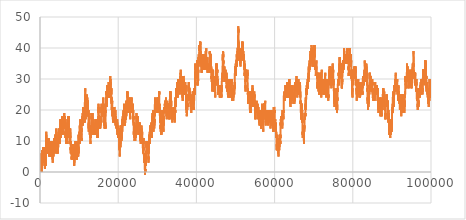
| Category | a |
|---|---|
| 2.0 | 0 |
| 3.0 | 1 |
| 5.0 | 0 |
| 7.0 | 1 |
| 11.0 | 2 |
| 13.0 | 1 |
| 17.0 | 0 |
| 19.0 | 1 |
| 23.0 | 2 |
| 29.0 | 1 |
| 31.0 | 2 |
| 37.0 | 1 |
| 41.0 | 0 |
| 43.0 | 1 |
| 47.0 | 2 |
| 53.0 | 1 |
| 59.0 | 2 |
| 61.0 | 1 |
| 67.0 | 2 |
| 71.0 | 3 |
| 73.0 | 2 |
| 79.0 | 3 |
| 83.0 | 4 |
| 89.0 | 3 |
| 97.0 | 2 |
| 101.0 | 1 |
| 103.0 | 2 |
| 107.0 | 3 |
| 109.0 | 2 |
| 113.0 | 1 |
| 127.0 | 2 |
| 131.0 | 3 |
| 137.0 | 2 |
| 139.0 | 3 |
| 149.0 | 2 |
| 151.0 | 3 |
| 157.0 | 2 |
| 163.0 | 3 |
| 167.0 | 4 |
| 173.0 | 3 |
| 179.0 | 4 |
| 181.0 | 3 |
| 191.0 | 4 |
| 193.0 | 3 |
| 197.0 | 2 |
| 199.0 | 3 |
| 211.0 | 4 |
| 223.0 | 5 |
| 227.0 | 6 |
| 229.0 | 5 |
| 233.0 | 4 |
| 239.0 | 5 |
| 241.0 | 4 |
| 251.0 | 5 |
| 257.0 | 4 |
| 263.0 | 5 |
| 269.0 | 4 |
| 271.0 | 5 |
| 277.0 | 4 |
| 281.0 | 3 |
| 283.0 | 4 |
| 293.0 | 3 |
| 307.0 | 4 |
| 311.0 | 5 |
| 313.0 | 4 |
| 317.0 | 3 |
| 331.0 | 4 |
| 337.0 | 3 |
| 347.0 | 4 |
| 349.0 | 3 |
| 353.0 | 2 |
| 359.0 | 3 |
| 367.0 | 4 |
| 373.0 | 3 |
| 379.0 | 4 |
| 383.0 | 5 |
| 389.0 | 4 |
| 397.0 | 3 |
| 401.0 | 2 |
| 409.0 | 1 |
| 419.0 | 2 |
| 421.0 | 1 |
| 431.0 | 2 |
| 433.0 | 1 |
| 439.0 | 2 |
| 443.0 | 3 |
| 449.0 | 2 |
| 457.0 | 1 |
| 461.0 | 0 |
| 463.0 | 1 |
| 467.0 | 2 |
| 479.0 | 3 |
| 487.0 | 4 |
| 491.0 | 5 |
| 499.0 | 6 |
| 503.0 | 7 |
| 509.0 | 6 |
| 521.0 | 5 |
| 523.0 | 6 |
| 541.0 | 5 |
| 547.0 | 6 |
| 557.0 | 5 |
| 563.0 | 6 |
| 569.0 | 5 |
| 571.0 | 6 |
| 577.0 | 5 |
| 587.0 | 6 |
| 593.0 | 5 |
| 599.0 | 6 |
| 601.0 | 5 |
| 607.0 | 6 |
| 613.0 | 5 |
| 617.0 | 4 |
| 619.0 | 5 |
| 631.0 | 6 |
| 641.0 | 5 |
| 643.0 | 6 |
| 647.0 | 7 |
| 653.0 | 6 |
| 659.0 | 7 |
| 661.0 | 6 |
| 673.0 | 5 |
| 677.0 | 4 |
| 683.0 | 5 |
| 691.0 | 6 |
| 701.0 | 5 |
| 709.0 | 4 |
| 719.0 | 5 |
| 727.0 | 6 |
| 733.0 | 5 |
| 739.0 | 6 |
| 743.0 | 7 |
| 751.0 | 8 |
| 757.0 | 7 |
| 761.0 | 6 |
| 769.0 | 5 |
| 773.0 | 4 |
| 787.0 | 5 |
| 797.0 | 4 |
| 809.0 | 3 |
| 811.0 | 4 |
| 821.0 | 3 |
| 823.0 | 4 |
| 827.0 | 5 |
| 829.0 | 4 |
| 839.0 | 5 |
| 853.0 | 4 |
| 857.0 | 3 |
| 859.0 | 4 |
| 863.0 | 5 |
| 877.0 | 4 |
| 881.0 | 3 |
| 883.0 | 4 |
| 887.0 | 5 |
| 907.0 | 6 |
| 911.0 | 7 |
| 919.0 | 8 |
| 929.0 | 7 |
| 937.0 | 6 |
| 941.0 | 5 |
| 947.0 | 6 |
| 953.0 | 5 |
| 967.0 | 6 |
| 971.0 | 7 |
| 977.0 | 6 |
| 983.0 | 7 |
| 991.0 | 8 |
| 997.0 | 7 |
| 1009.0 | 6 |
| 1013.0 | 5 |
| 1019.0 | 6 |
| 1021.0 | 5 |
| 1031.0 | 6 |
| 1033.0 | 5 |
| 1039.0 | 6 |
| 1049.0 | 5 |
| 1051.0 | 6 |
| 1061.0 | 5 |
| 1063.0 | 6 |
| 1069.0 | 5 |
| 1087.0 | 6 |
| 1091.0 | 7 |
| 1093.0 | 6 |
| 1097.0 | 5 |
| 1103.0 | 6 |
| 1109.0 | 5 |
| 1117.0 | 4 |
| 1123.0 | 5 |
| 1129.0 | 4 |
| 1151.0 | 5 |
| 1153.0 | 4 |
| 1163.0 | 5 |
| 1171.0 | 6 |
| 1181.0 | 5 |
| 1187.0 | 6 |
| 1193.0 | 5 |
| 1201.0 | 4 |
| 1213.0 | 3 |
| 1217.0 | 2 |
| 1223.0 | 3 |
| 1229.0 | 2 |
| 1231.0 | 3 |
| 1237.0 | 2 |
| 1249.0 | 1 |
| 1259.0 | 2 |
| 1277.0 | 1 |
| 1279.0 | 2 |
| 1283.0 | 3 |
| 1289.0 | 2 |
| 1291.0 | 3 |
| 1297.0 | 2 |
| 1301.0 | 1 |
| 1303.0 | 2 |
| 1307.0 | 3 |
| 1319.0 | 4 |
| 1321.0 | 3 |
| 1327.0 | 4 |
| 1361.0 | 3 |
| 1367.0 | 4 |
| 1373.0 | 3 |
| 1381.0 | 2 |
| 1399.0 | 3 |
| 1409.0 | 2 |
| 1423.0 | 3 |
| 1427.0 | 4 |
| 1429.0 | 3 |
| 1433.0 | 2 |
| 1439.0 | 3 |
| 1447.0 | 4 |
| 1451.0 | 5 |
| 1453.0 | 4 |
| 1459.0 | 5 |
| 1471.0 | 6 |
| 1481.0 | 5 |
| 1483.0 | 6 |
| 1487.0 | 7 |
| 1489.0 | 6 |
| 1493.0 | 5 |
| 1499.0 | 6 |
| 1511.0 | 7 |
| 1523.0 | 8 |
| 1531.0 | 9 |
| 1543.0 | 10 |
| 1549.0 | 9 |
| 1553.0 | 8 |
| 1559.0 | 9 |
| 1567.0 | 10 |
| 1571.0 | 11 |
| 1579.0 | 12 |
| 1583.0 | 13 |
| 1597.0 | 12 |
| 1601.0 | 11 |
| 1607.0 | 12 |
| 1609.0 | 11 |
| 1613.0 | 10 |
| 1619.0 | 11 |
| 1621.0 | 10 |
| 1627.0 | 11 |
| 1637.0 | 10 |
| 1657.0 | 9 |
| 1663.0 | 10 |
| 1667.0 | 11 |
| 1669.0 | 10 |
| 1693.0 | 9 |
| 1697.0 | 8 |
| 1699.0 | 9 |
| 1709.0 | 8 |
| 1721.0 | 7 |
| 1723.0 | 8 |
| 1733.0 | 7 |
| 1741.0 | 6 |
| 1747.0 | 7 |
| 1753.0 | 6 |
| 1759.0 | 7 |
| 1777.0 | 6 |
| 1783.0 | 7 |
| 1787.0 | 8 |
| 1789.0 | 7 |
| 1801.0 | 6 |
| 1811.0 | 7 |
| 1823.0 | 8 |
| 1831.0 | 9 |
| 1847.0 | 10 |
| 1861.0 | 9 |
| 1867.0 | 10 |
| 1871.0 | 11 |
| 1873.0 | 10 |
| 1877.0 | 9 |
| 1879.0 | 10 |
| 1889.0 | 9 |
| 1901.0 | 8 |
| 1907.0 | 9 |
| 1913.0 | 8 |
| 1931.0 | 9 |
| 1933.0 | 8 |
| 1949.0 | 7 |
| 1951.0 | 8 |
| 1973.0 | 7 |
| 1979.0 | 8 |
| 1987.0 | 9 |
| 1993.0 | 8 |
| 1997.0 | 7 |
| 1999.0 | 8 |
| 2003.0 | 9 |
| 2011.0 | 10 |
| 2017.0 | 9 |
| 2027.0 | 10 |
| 2029.0 | 9 |
| 2039.0 | 10 |
| 2053.0 | 9 |
| 2063.0 | 10 |
| 2069.0 | 9 |
| 2081.0 | 8 |
| 2083.0 | 9 |
| 2087.0 | 10 |
| 2089.0 | 9 |
| 2099.0 | 10 |
| 2111.0 | 11 |
| 2113.0 | 10 |
| 2129.0 | 9 |
| 2131.0 | 10 |
| 2137.0 | 9 |
| 2141.0 | 8 |
| 2143.0 | 9 |
| 2153.0 | 8 |
| 2161.0 | 7 |
| 2179.0 | 8 |
| 2203.0 | 9 |
| 2207.0 | 10 |
| 2213.0 | 9 |
| 2221.0 | 8 |
| 2237.0 | 7 |
| 2239.0 | 8 |
| 2243.0 | 9 |
| 2251.0 | 10 |
| 2267.0 | 11 |
| 2269.0 | 10 |
| 2273.0 | 9 |
| 2281.0 | 8 |
| 2287.0 | 9 |
| 2293.0 | 8 |
| 2297.0 | 7 |
| 2309.0 | 6 |
| 2311.0 | 7 |
| 2333.0 | 6 |
| 2339.0 | 7 |
| 2341.0 | 6 |
| 2347.0 | 7 |
| 2351.0 | 8 |
| 2357.0 | 7 |
| 2371.0 | 8 |
| 2377.0 | 7 |
| 2381.0 | 6 |
| 2383.0 | 7 |
| 2389.0 | 6 |
| 2393.0 | 5 |
| 2399.0 | 6 |
| 2411.0 | 7 |
| 2417.0 | 6 |
| 2423.0 | 7 |
| 2437.0 | 6 |
| 2441.0 | 5 |
| 2447.0 | 6 |
| 2459.0 | 7 |
| 2467.0 | 8 |
| 2473.0 | 7 |
| 2477.0 | 6 |
| 2503.0 | 7 |
| 2521.0 | 6 |
| 2531.0 | 7 |
| 2539.0 | 8 |
| 2543.0 | 9 |
| 2549.0 | 8 |
| 2551.0 | 9 |
| 2557.0 | 8 |
| 2579.0 | 9 |
| 2591.0 | 10 |
| 2593.0 | 9 |
| 2609.0 | 8 |
| 2617.0 | 7 |
| 2621.0 | 6 |
| 2633.0 | 5 |
| 2647.0 | 6 |
| 2657.0 | 5 |
| 2659.0 | 6 |
| 2663.0 | 7 |
| 2671.0 | 8 |
| 2677.0 | 7 |
| 2683.0 | 8 |
| 2687.0 | 9 |
| 2689.0 | 8 |
| 2693.0 | 7 |
| 2699.0 | 8 |
| 2707.0 | 9 |
| 2711.0 | 10 |
| 2713.0 | 9 |
| 2719.0 | 10 |
| 2729.0 | 9 |
| 2731.0 | 10 |
| 2741.0 | 9 |
| 2749.0 | 8 |
| 2753.0 | 7 |
| 2767.0 | 8 |
| 2777.0 | 7 |
| 2789.0 | 6 |
| 2791.0 | 7 |
| 2797.0 | 6 |
| 2801.0 | 5 |
| 2803.0 | 6 |
| 2819.0 | 7 |
| 2833.0 | 6 |
| 2837.0 | 5 |
| 2843.0 | 6 |
| 2851.0 | 7 |
| 2857.0 | 6 |
| 2861.0 | 5 |
| 2879.0 | 6 |
| 2887.0 | 7 |
| 2897.0 | 6 |
| 2903.0 | 7 |
| 2909.0 | 6 |
| 2917.0 | 5 |
| 2927.0 | 6 |
| 2939.0 | 7 |
| 2953.0 | 6 |
| 2957.0 | 5 |
| 2963.0 | 6 |
| 2969.0 | 5 |
| 2971.0 | 6 |
| 2999.0 | 7 |
| 3001.0 | 6 |
| 3011.0 | 7 |
| 3019.0 | 8 |
| 3023.0 | 9 |
| 3037.0 | 8 |
| 3041.0 | 7 |
| 3049.0 | 6 |
| 3061.0 | 5 |
| 3067.0 | 6 |
| 3079.0 | 7 |
| 3083.0 | 8 |
| 3089.0 | 7 |
| 3109.0 | 6 |
| 3119.0 | 7 |
| 3121.0 | 6 |
| 3137.0 | 5 |
| 3163.0 | 6 |
| 3167.0 | 7 |
| 3169.0 | 6 |
| 3181.0 | 5 |
| 3187.0 | 6 |
| 3191.0 | 7 |
| 3203.0 | 8 |
| 3209.0 | 7 |
| 3217.0 | 6 |
| 3221.0 | 5 |
| 3229.0 | 4 |
| 3251.0 | 5 |
| 3253.0 | 4 |
| 3257.0 | 3 |
| 3259.0 | 4 |
| 3271.0 | 5 |
| 3299.0 | 6 |
| 3301.0 | 5 |
| 3307.0 | 6 |
| 3313.0 | 5 |
| 3319.0 | 6 |
| 3323.0 | 7 |
| 3329.0 | 6 |
| 3331.0 | 7 |
| 3343.0 | 8 |
| 3347.0 | 9 |
| 3359.0 | 10 |
| 3361.0 | 9 |
| 3371.0 | 10 |
| 3373.0 | 9 |
| 3389.0 | 8 |
| 3391.0 | 9 |
| 3407.0 | 10 |
| 3413.0 | 9 |
| 3433.0 | 8 |
| 3449.0 | 7 |
| 3457.0 | 6 |
| 3461.0 | 5 |
| 3463.0 | 6 |
| 3467.0 | 7 |
| 3469.0 | 6 |
| 3491.0 | 7 |
| 3499.0 | 8 |
| 3511.0 | 9 |
| 3517.0 | 8 |
| 3527.0 | 9 |
| 3529.0 | 8 |
| 3533.0 | 7 |
| 3539.0 | 8 |
| 3541.0 | 7 |
| 3547.0 | 8 |
| 3557.0 | 7 |
| 3559.0 | 8 |
| 3571.0 | 9 |
| 3581.0 | 8 |
| 3583.0 | 9 |
| 3593.0 | 8 |
| 3607.0 | 9 |
| 3613.0 | 8 |
| 3617.0 | 7 |
| 3623.0 | 8 |
| 3631.0 | 9 |
| 3637.0 | 8 |
| 3643.0 | 9 |
| 3659.0 | 10 |
| 3671.0 | 11 |
| 3673.0 | 10 |
| 3677.0 | 9 |
| 3691.0 | 10 |
| 3697.0 | 9 |
| 3701.0 | 8 |
| 3709.0 | 7 |
| 3719.0 | 8 |
| 3727.0 | 9 |
| 3733.0 | 8 |
| 3739.0 | 9 |
| 3761.0 | 8 |
| 3767.0 | 9 |
| 3769.0 | 8 |
| 3779.0 | 9 |
| 3793.0 | 8 |
| 3797.0 | 7 |
| 3803.0 | 8 |
| 3821.0 | 7 |
| 3823.0 | 8 |
| 3833.0 | 7 |
| 3847.0 | 8 |
| 3851.0 | 9 |
| 3853.0 | 8 |
| 3863.0 | 9 |
| 3877.0 | 8 |
| 3881.0 | 7 |
| 3889.0 | 6 |
| 3907.0 | 7 |
| 3911.0 | 8 |
| 3917.0 | 7 |
| 3919.0 | 8 |
| 3923.0 | 9 |
| 3929.0 | 8 |
| 3931.0 | 9 |
| 3943.0 | 10 |
| 3947.0 | 11 |
| 3967.0 | 12 |
| 3989.0 | 11 |
| 4001.0 | 10 |
| 4003.0 | 11 |
| 4007.0 | 12 |
| 4013.0 | 11 |
| 4019.0 | 12 |
| 4021.0 | 11 |
| 4027.0 | 12 |
| 4049.0 | 11 |
| 4051.0 | 12 |
| 4057.0 | 11 |
| 4073.0 | 10 |
| 4079.0 | 11 |
| 4091.0 | 12 |
| 4093.0 | 11 |
| 4099.0 | 12 |
| 4111.0 | 13 |
| 4127.0 | 14 |
| 4129.0 | 13 |
| 4133.0 | 12 |
| 4139.0 | 13 |
| 4153.0 | 12 |
| 4157.0 | 11 |
| 4159.0 | 12 |
| 4177.0 | 11 |
| 4201.0 | 10 |
| 4211.0 | 11 |
| 4217.0 | 10 |
| 4219.0 | 11 |
| 4229.0 | 10 |
| 4231.0 | 11 |
| 4241.0 | 10 |
| 4243.0 | 11 |
| 4253.0 | 10 |
| 4259.0 | 11 |
| 4261.0 | 10 |
| 4271.0 | 11 |
| 4273.0 | 10 |
| 4283.0 | 11 |
| 4289.0 | 10 |
| 4297.0 | 9 |
| 4327.0 | 10 |
| 4337.0 | 9 |
| 4339.0 | 10 |
| 4349.0 | 9 |
| 4357.0 | 8 |
| 4363.0 | 9 |
| 4373.0 | 8 |
| 4391.0 | 9 |
| 4397.0 | 8 |
| 4409.0 | 7 |
| 4421.0 | 6 |
| 4423.0 | 7 |
| 4441.0 | 6 |
| 4447.0 | 7 |
| 4451.0 | 8 |
| 4457.0 | 7 |
| 4463.0 | 8 |
| 4481.0 | 7 |
| 4483.0 | 8 |
| 4493.0 | 7 |
| 4507.0 | 8 |
| 4513.0 | 7 |
| 4517.0 | 6 |
| 4519.0 | 7 |
| 4523.0 | 8 |
| 4547.0 | 9 |
| 4549.0 | 8 |
| 4561.0 | 7 |
| 4567.0 | 8 |
| 4583.0 | 9 |
| 4591.0 | 10 |
| 4597.0 | 9 |
| 4603.0 | 10 |
| 4621.0 | 9 |
| 4637.0 | 8 |
| 4639.0 | 9 |
| 4643.0 | 10 |
| 4649.0 | 9 |
| 4651.0 | 10 |
| 4657.0 | 9 |
| 4663.0 | 10 |
| 4673.0 | 9 |
| 4679.0 | 10 |
| 4691.0 | 11 |
| 4703.0 | 12 |
| 4721.0 | 11 |
| 4723.0 | 12 |
| 4729.0 | 11 |
| 4733.0 | 10 |
| 4751.0 | 11 |
| 4759.0 | 12 |
| 4783.0 | 13 |
| 4787.0 | 14 |
| 4789.0 | 13 |
| 4793.0 | 12 |
| 4799.0 | 13 |
| 4801.0 | 12 |
| 4813.0 | 11 |
| 4817.0 | 10 |
| 4831.0 | 11 |
| 4861.0 | 10 |
| 4871.0 | 11 |
| 4877.0 | 10 |
| 4889.0 | 9 |
| 4903.0 | 10 |
| 4909.0 | 9 |
| 4919.0 | 10 |
| 4931.0 | 11 |
| 4933.0 | 10 |
| 4937.0 | 9 |
| 4943.0 | 10 |
| 4951.0 | 11 |
| 4957.0 | 10 |
| 4967.0 | 11 |
| 4969.0 | 10 |
| 4973.0 | 9 |
| 4987.0 | 10 |
| 4993.0 | 9 |
| 4999.0 | 10 |
| 5003.0 | 11 |
| 5009.0 | 10 |
| 5011.0 | 11 |
| 5021.0 | 10 |
| 5023.0 | 11 |
| 5039.0 | 12 |
| 5051.0 | 13 |
| 5059.0 | 14 |
| 5077.0 | 13 |
| 5081.0 | 12 |
| 5087.0 | 13 |
| 5099.0 | 14 |
| 5101.0 | 13 |
| 5107.0 | 14 |
| 5113.0 | 13 |
| 5119.0 | 14 |
| 5147.0 | 15 |
| 5153.0 | 14 |
| 5167.0 | 15 |
| 5171.0 | 16 |
| 5179.0 | 17 |
| 5189.0 | 16 |
| 5197.0 | 15 |
| 5209.0 | 14 |
| 5227.0 | 15 |
| 5231.0 | 16 |
| 5233.0 | 15 |
| 5237.0 | 14 |
| 5261.0 | 13 |
| 5273.0 | 12 |
| 5279.0 | 13 |
| 5281.0 | 12 |
| 5297.0 | 11 |
| 5303.0 | 12 |
| 5309.0 | 11 |
| 5323.0 | 12 |
| 5333.0 | 11 |
| 5347.0 | 12 |
| 5351.0 | 13 |
| 5381.0 | 12 |
| 5387.0 | 13 |
| 5393.0 | 12 |
| 5399.0 | 13 |
| 5407.0 | 14 |
| 5413.0 | 13 |
| 5417.0 | 12 |
| 5419.0 | 13 |
| 5431.0 | 14 |
| 5437.0 | 13 |
| 5441.0 | 12 |
| 5443.0 | 13 |
| 5449.0 | 12 |
| 5471.0 | 13 |
| 5477.0 | 12 |
| 5479.0 | 13 |
| 5483.0 | 14 |
| 5501.0 | 13 |
| 5503.0 | 14 |
| 5507.0 | 15 |
| 5519.0 | 16 |
| 5521.0 | 15 |
| 5527.0 | 16 |
| 5531.0 | 17 |
| 5557.0 | 16 |
| 5563.0 | 17 |
| 5569.0 | 16 |
| 5573.0 | 15 |
| 5581.0 | 14 |
| 5591.0 | 15 |
| 5623.0 | 16 |
| 5639.0 | 17 |
| 5641.0 | 16 |
| 5647.0 | 17 |
| 5651.0 | 18 |
| 5653.0 | 17 |
| 5657.0 | 16 |
| 5659.0 | 17 |
| 5669.0 | 16 |
| 5683.0 | 17 |
| 5689.0 | 16 |
| 5693.0 | 15 |
| 5701.0 | 14 |
| 5711.0 | 15 |
| 5717.0 | 14 |
| 5737.0 | 13 |
| 5741.0 | 12 |
| 5743.0 | 13 |
| 5749.0 | 12 |
| 5779.0 | 13 |
| 5783.0 | 14 |
| 5791.0 | 15 |
| 5801.0 | 14 |
| 5807.0 | 15 |
| 5813.0 | 14 |
| 5821.0 | 13 |
| 5827.0 | 14 |
| 5839.0 | 15 |
| 5843.0 | 16 |
| 5849.0 | 15 |
| 5851.0 | 16 |
| 5857.0 | 15 |
| 5861.0 | 14 |
| 5867.0 | 15 |
| 5869.0 | 14 |
| 5879.0 | 15 |
| 5881.0 | 14 |
| 5897.0 | 13 |
| 5903.0 | 14 |
| 5923.0 | 15 |
| 5927.0 | 16 |
| 5939.0 | 17 |
| 5953.0 | 16 |
| 5981.0 | 15 |
| 5987.0 | 16 |
| 6007.0 | 17 |
| 6011.0 | 18 |
| 6029.0 | 17 |
| 6037.0 | 16 |
| 6043.0 | 17 |
| 6047.0 | 18 |
| 6053.0 | 17 |
| 6067.0 | 18 |
| 6073.0 | 17 |
| 6079.0 | 18 |
| 6089.0 | 17 |
| 6091.0 | 18 |
| 6101.0 | 17 |
| 6113.0 | 16 |
| 6121.0 | 15 |
| 6131.0 | 16 |
| 6133.0 | 15 |
| 6143.0 | 16 |
| 6151.0 | 17 |
| 6163.0 | 18 |
| 6173.0 | 17 |
| 6197.0 | 16 |
| 6199.0 | 17 |
| 6203.0 | 18 |
| 6211.0 | 19 |
| 6217.0 | 18 |
| 6221.0 | 17 |
| 6229.0 | 16 |
| 6247.0 | 17 |
| 6257.0 | 16 |
| 6263.0 | 17 |
| 6269.0 | 16 |
| 6271.0 | 17 |
| 6277.0 | 16 |
| 6287.0 | 17 |
| 6299.0 | 18 |
| 6301.0 | 17 |
| 6311.0 | 18 |
| 6317.0 | 17 |
| 6323.0 | 18 |
| 6329.0 | 17 |
| 6337.0 | 16 |
| 6343.0 | 17 |
| 6353.0 | 16 |
| 6359.0 | 17 |
| 6361.0 | 16 |
| 6367.0 | 17 |
| 6373.0 | 16 |
| 6379.0 | 17 |
| 6389.0 | 16 |
| 6397.0 | 15 |
| 6421.0 | 14 |
| 6427.0 | 15 |
| 6449.0 | 14 |
| 6451.0 | 15 |
| 6469.0 | 14 |
| 6473.0 | 13 |
| 6481.0 | 12 |
| 6491.0 | 13 |
| 6521.0 | 12 |
| 6529.0 | 11 |
| 6547.0 | 12 |
| 6551.0 | 13 |
| 6553.0 | 12 |
| 6563.0 | 13 |
| 6569.0 | 12 |
| 6571.0 | 13 |
| 6577.0 | 12 |
| 6581.0 | 11 |
| 6599.0 | 12 |
| 6607.0 | 13 |
| 6619.0 | 14 |
| 6637.0 | 13 |
| 6653.0 | 12 |
| 6659.0 | 13 |
| 6661.0 | 12 |
| 6673.0 | 11 |
| 6679.0 | 12 |
| 6689.0 | 11 |
| 6691.0 | 12 |
| 6701.0 | 11 |
| 6703.0 | 12 |
| 6709.0 | 11 |
| 6719.0 | 12 |
| 6733.0 | 11 |
| 6737.0 | 10 |
| 6761.0 | 9 |
| 6763.0 | 10 |
| 6779.0 | 11 |
| 6781.0 | 10 |
| 6791.0 | 11 |
| 6793.0 | 10 |
| 6803.0 | 11 |
| 6823.0 | 12 |
| 6827.0 | 13 |
| 6829.0 | 12 |
| 6833.0 | 11 |
| 6841.0 | 10 |
| 6857.0 | 9 |
| 6863.0 | 10 |
| 6869.0 | 9 |
| 6871.0 | 10 |
| 6883.0 | 11 |
| 6899.0 | 12 |
| 6907.0 | 13 |
| 6911.0 | 14 |
| 6917.0 | 13 |
| 6947.0 | 14 |
| 6949.0 | 13 |
| 6959.0 | 14 |
| 6961.0 | 13 |
| 6967.0 | 14 |
| 6971.0 | 15 |
| 6977.0 | 14 |
| 6983.0 | 15 |
| 6991.0 | 16 |
| 6997.0 | 15 |
| 7001.0 | 14 |
| 7013.0 | 13 |
| 7019.0 | 14 |
| 7027.0 | 15 |
| 7039.0 | 16 |
| 7043.0 | 17 |
| 7057.0 | 16 |
| 7069.0 | 15 |
| 7079.0 | 16 |
| 7103.0 | 17 |
| 7109.0 | 16 |
| 7121.0 | 15 |
| 7127.0 | 16 |
| 7129.0 | 15 |
| 7151.0 | 16 |
| 7159.0 | 17 |
| 7177.0 | 16 |
| 7187.0 | 17 |
| 7193.0 | 16 |
| 7207.0 | 17 |
| 7211.0 | 18 |
| 7213.0 | 17 |
| 7219.0 | 18 |
| 7229.0 | 17 |
| 7237.0 | 16 |
| 7243.0 | 17 |
| 7247.0 | 18 |
| 7253.0 | 17 |
| 7283.0 | 18 |
| 7297.0 | 17 |
| 7307.0 | 18 |
| 7309.0 | 17 |
| 7321.0 | 16 |
| 7331.0 | 17 |
| 7333.0 | 16 |
| 7349.0 | 15 |
| 7351.0 | 16 |
| 7369.0 | 15 |
| 7393.0 | 14 |
| 7411.0 | 15 |
| 7417.0 | 14 |
| 7433.0 | 13 |
| 7451.0 | 14 |
| 7457.0 | 13 |
| 7459.0 | 14 |
| 7477.0 | 13 |
| 7481.0 | 12 |
| 7487.0 | 13 |
| 7489.0 | 12 |
| 7499.0 | 13 |
| 7507.0 | 14 |
| 7517.0 | 13 |
| 7523.0 | 14 |
| 7529.0 | 13 |
| 7537.0 | 12 |
| 7541.0 | 11 |
| 7547.0 | 12 |
| 7549.0 | 11 |
| 7559.0 | 12 |
| 7561.0 | 11 |
| 7573.0 | 10 |
| 7577.0 | 9 |
| 7583.0 | 10 |
| 7589.0 | 9 |
| 7591.0 | 10 |
| 7603.0 | 11 |
| 7607.0 | 12 |
| 7621.0 | 11 |
| 7639.0 | 12 |
| 7643.0 | 13 |
| 7649.0 | 12 |
| 7669.0 | 11 |
| 7673.0 | 10 |
| 7681.0 | 9 |
| 7687.0 | 10 |
| 7691.0 | 11 |
| 7699.0 | 12 |
| 7703.0 | 13 |
| 7717.0 | 12 |
| 7723.0 | 13 |
| 7727.0 | 14 |
| 7741.0 | 13 |
| 7753.0 | 12 |
| 7757.0 | 11 |
| 7759.0 | 12 |
| 7789.0 | 11 |
| 7793.0 | 10 |
| 7817.0 | 9 |
| 7823.0 | 10 |
| 7829.0 | 9 |
| 7841.0 | 8 |
| 7853.0 | 7 |
| 7867.0 | 8 |
| 7873.0 | 7 |
| 7877.0 | 6 |
| 7879.0 | 7 |
| 7883.0 | 8 |
| 7901.0 | 7 |
| 7907.0 | 8 |
| 7919.0 | 9 |
| 7927.0 | 10 |
| 7933.0 | 9 |
| 7937.0 | 8 |
| 7949.0 | 7 |
| 7951.0 | 8 |
| 7963.0 | 9 |
| 7993.0 | 8 |
| 8009.0 | 7 |
| 8011.0 | 8 |
| 8017.0 | 7 |
| 8039.0 | 8 |
| 8053.0 | 7 |
| 8059.0 | 8 |
| 8069.0 | 7 |
| 8081.0 | 6 |
| 8087.0 | 7 |
| 8089.0 | 6 |
| 8093.0 | 5 |
| 8101.0 | 4 |
| 8111.0 | 5 |
| 8117.0 | 4 |
| 8123.0 | 5 |
| 8147.0 | 6 |
| 8161.0 | 5 |
| 8167.0 | 6 |
| 8171.0 | 7 |
| 8179.0 | 8 |
| 8191.0 | 9 |
| 8209.0 | 8 |
| 8219.0 | 9 |
| 8221.0 | 8 |
| 8231.0 | 9 |
| 8233.0 | 8 |
| 8237.0 | 7 |
| 8243.0 | 8 |
| 8263.0 | 9 |
| 8269.0 | 8 |
| 8273.0 | 7 |
| 8287.0 | 8 |
| 8291.0 | 9 |
| 8293.0 | 8 |
| 8297.0 | 7 |
| 8311.0 | 8 |
| 8317.0 | 7 |
| 8329.0 | 6 |
| 8353.0 | 5 |
| 8363.0 | 6 |
| 8369.0 | 5 |
| 8377.0 | 4 |
| 8387.0 | 5 |
| 8389.0 | 4 |
| 8419.0 | 5 |
| 8423.0 | 6 |
| 8429.0 | 5 |
| 8431.0 | 6 |
| 8443.0 | 7 |
| 8447.0 | 8 |
| 8461.0 | 7 |
| 8467.0 | 8 |
| 8501.0 | 7 |
| 8513.0 | 6 |
| 8521.0 | 5 |
| 8527.0 | 6 |
| 8537.0 | 5 |
| 8539.0 | 6 |
| 8543.0 | 7 |
| 8563.0 | 8 |
| 8573.0 | 7 |
| 8581.0 | 6 |
| 8597.0 | 5 |
| 8599.0 | 6 |
| 8609.0 | 5 |
| 8623.0 | 6 |
| 8627.0 | 7 |
| 8629.0 | 6 |
| 8641.0 | 5 |
| 8647.0 | 6 |
| 8663.0 | 7 |
| 8669.0 | 6 |
| 8677.0 | 5 |
| 8681.0 | 4 |
| 8689.0 | 3 |
| 8693.0 | 2 |
| 8699.0 | 3 |
| 8707.0 | 4 |
| 8713.0 | 3 |
| 8719.0 | 4 |
| 8731.0 | 5 |
| 8737.0 | 4 |
| 8741.0 | 3 |
| 8747.0 | 4 |
| 8753.0 | 3 |
| 8761.0 | 2 |
| 8779.0 | 3 |
| 8783.0 | 4 |
| 8803.0 | 5 |
| 8807.0 | 6 |
| 8819.0 | 7 |
| 8821.0 | 6 |
| 8831.0 | 7 |
| 8837.0 | 6 |
| 8839.0 | 7 |
| 8849.0 | 6 |
| 8861.0 | 5 |
| 8863.0 | 6 |
| 8867.0 | 7 |
| 8887.0 | 8 |
| 8893.0 | 7 |
| 8923.0 | 8 |
| 8929.0 | 7 |
| 8933.0 | 6 |
| 8941.0 | 5 |
| 8951.0 | 6 |
| 8963.0 | 7 |
| 8969.0 | 6 |
| 8971.0 | 7 |
| 8999.0 | 8 |
| 9001.0 | 7 |
| 9007.0 | 8 |
| 9011.0 | 9 |
| 9013.0 | 8 |
| 9029.0 | 7 |
| 9041.0 | 6 |
| 9043.0 | 7 |
| 9049.0 | 6 |
| 9059.0 | 7 |
| 9067.0 | 8 |
| 9091.0 | 9 |
| 9103.0 | 10 |
| 9109.0 | 9 |
| 9127.0 | 10 |
| 9133.0 | 9 |
| 9137.0 | 8 |
| 9151.0 | 9 |
| 9157.0 | 8 |
| 9161.0 | 7 |
| 9173.0 | 6 |
| 9181.0 | 5 |
| 9187.0 | 6 |
| 9199.0 | 7 |
| 9203.0 | 8 |
| 9209.0 | 7 |
| 9221.0 | 6 |
| 9227.0 | 7 |
| 9239.0 | 8 |
| 9241.0 | 7 |
| 9257.0 | 6 |
| 9277.0 | 5 |
| 9281.0 | 4 |
| 9283.0 | 5 |
| 9293.0 | 4 |
| 9311.0 | 5 |
| 9319.0 | 6 |
| 9323.0 | 7 |
| 9337.0 | 6 |
| 9341.0 | 5 |
| 9343.0 | 6 |
| 9349.0 | 5 |
| 9371.0 | 6 |
| 9377.0 | 5 |
| 9391.0 | 6 |
| 9397.0 | 5 |
| 9403.0 | 6 |
| 9413.0 | 5 |
| 9419.0 | 6 |
| 9421.0 | 5 |
| 9431.0 | 6 |
| 9433.0 | 5 |
| 9437.0 | 4 |
| 9439.0 | 5 |
| 9461.0 | 4 |
| 9463.0 | 5 |
| 9467.0 | 6 |
| 9473.0 | 5 |
| 9479.0 | 6 |
| 9491.0 | 7 |
| 9497.0 | 6 |
| 9511.0 | 7 |
| 9521.0 | 6 |
| 9533.0 | 5 |
| 9539.0 | 6 |
| 9547.0 | 7 |
| 9551.0 | 8 |
| 9587.0 | 9 |
| 9601.0 | 8 |
| 9613.0 | 7 |
| 9619.0 | 8 |
| 9623.0 | 9 |
| 9629.0 | 8 |
| 9631.0 | 9 |
| 9643.0 | 10 |
| 9649.0 | 9 |
| 9661.0 | 8 |
| 9677.0 | 7 |
| 9679.0 | 8 |
| 9689.0 | 7 |
| 9697.0 | 6 |
| 9719.0 | 7 |
| 9721.0 | 6 |
| 9733.0 | 5 |
| 9739.0 | 6 |
| 9743.0 | 7 |
| 9749.0 | 6 |
| 9767.0 | 7 |
| 9769.0 | 6 |
| 9781.0 | 5 |
| 9787.0 | 6 |
| 9791.0 | 7 |
| 9803.0 | 8 |
| 9811.0 | 9 |
| 9817.0 | 8 |
| 9829.0 | 7 |
| 9833.0 | 6 |
| 9839.0 | 7 |
| 9851.0 | 8 |
| 9857.0 | 7 |
| 9859.0 | 8 |
| 9871.0 | 9 |
| 9883.0 | 10 |
| 9887.0 | 11 |
| 9901.0 | 10 |
| 9907.0 | 11 |
| 9923.0 | 12 |
| 9929.0 | 11 |
| 9931.0 | 12 |
| 9941.0 | 11 |
| 9949.0 | 10 |
| 9967.0 | 11 |
| 9973.0 | 10 |
| 10007.0 | 11 |
| 10009.0 | 10 |
| 10037.0 | 9 |
| 10039.0 | 10 |
| 10061.0 | 9 |
| 10067.0 | 10 |
| 10069.0 | 9 |
| 10079.0 | 10 |
| 10091.0 | 11 |
| 10093.0 | 10 |
| 10099.0 | 11 |
| 10103.0 | 12 |
| 10111.0 | 13 |
| 10133.0 | 12 |
| 10139.0 | 13 |
| 10141.0 | 12 |
| 10151.0 | 13 |
| 10159.0 | 14 |
| 10163.0 | 15 |
| 10169.0 | 14 |
| 10177.0 | 13 |
| 10181.0 | 12 |
| 10193.0 | 11 |
| 10211.0 | 12 |
| 10223.0 | 13 |
| 10243.0 | 14 |
| 10247.0 | 15 |
| 10253.0 | 14 |
| 10259.0 | 15 |
| 10267.0 | 16 |
| 10271.0 | 17 |
| 10273.0 | 16 |
| 10289.0 | 15 |
| 10301.0 | 14 |
| 10303.0 | 15 |
| 10313.0 | 14 |
| 10321.0 | 13 |
| 10331.0 | 14 |
| 10333.0 | 13 |
| 10337.0 | 12 |
| 10343.0 | 13 |
| 10357.0 | 12 |
| 10369.0 | 11 |
| 10391.0 | 12 |
| 10399.0 | 13 |
| 10427.0 | 14 |
| 10429.0 | 13 |
| 10433.0 | 12 |
| 10453.0 | 11 |
| 10457.0 | 10 |
| 10459.0 | 11 |
| 10463.0 | 12 |
| 10477.0 | 11 |
| 10487.0 | 12 |
| 10499.0 | 13 |
| 10501.0 | 12 |
| 10513.0 | 11 |
| 10529.0 | 10 |
| 10531.0 | 11 |
| 10559.0 | 12 |
| 10567.0 | 13 |
| 10589.0 | 12 |
| 10597.0 | 11 |
| 10601.0 | 10 |
| 10607.0 | 11 |
| 10613.0 | 10 |
| 10627.0 | 11 |
| 10631.0 | 12 |
| 10639.0 | 13 |
| 10651.0 | 14 |
| 10657.0 | 13 |
| 10663.0 | 14 |
| 10667.0 | 15 |
| 10687.0 | 16 |
| 10691.0 | 17 |
| 10709.0 | 16 |
| 10711.0 | 17 |
| 10723.0 | 18 |
| 10729.0 | 17 |
| 10733.0 | 16 |
| 10739.0 | 17 |
| 10753.0 | 16 |
| 10771.0 | 17 |
| 10781.0 | 16 |
| 10789.0 | 15 |
| 10799.0 | 16 |
| 10831.0 | 17 |
| 10837.0 | 16 |
| 10847.0 | 17 |
| 10853.0 | 16 |
| 10859.0 | 17 |
| 10861.0 | 16 |
| 10867.0 | 17 |
| 10883.0 | 18 |
| 10889.0 | 17 |
| 10891.0 | 18 |
| 10903.0 | 19 |
| 10909.0 | 18 |
| 10937.0 | 17 |
| 10939.0 | 18 |
| 10949.0 | 17 |
| 10957.0 | 16 |
| 10973.0 | 15 |
| 10979.0 | 16 |
| 10987.0 | 17 |
| 10993.0 | 16 |
| 11003.0 | 17 |
| 11027.0 | 18 |
| 11047.0 | 19 |
| 11057.0 | 18 |
| 11059.0 | 19 |
| 11069.0 | 18 |
| 11071.0 | 19 |
| 11083.0 | 20 |
| 11087.0 | 21 |
| 11093.0 | 20 |
| 11113.0 | 19 |
| 11117.0 | 18 |
| 11119.0 | 19 |
| 11131.0 | 20 |
| 11149.0 | 19 |
| 11159.0 | 20 |
| 11161.0 | 19 |
| 11171.0 | 20 |
| 11173.0 | 19 |
| 11177.0 | 18 |
| 11197.0 | 17 |
| 11213.0 | 16 |
| 11239.0 | 17 |
| 11243.0 | 18 |
| 11251.0 | 19 |
| 11257.0 | 18 |
| 11261.0 | 17 |
| 11273.0 | 16 |
| 11279.0 | 17 |
| 11287.0 | 18 |
| 11299.0 | 19 |
| 11311.0 | 20 |
| 11317.0 | 19 |
| 11321.0 | 18 |
| 11329.0 | 17 |
| 11351.0 | 18 |
| 11353.0 | 17 |
| 11369.0 | 16 |
| 11383.0 | 17 |
| 11393.0 | 16 |
| 11399.0 | 17 |
| 11411.0 | 18 |
| 11423.0 | 19 |
| 11437.0 | 18 |
| 11443.0 | 19 |
| 11447.0 | 20 |
| 11467.0 | 21 |
| 11471.0 | 22 |
| 11483.0 | 23 |
| 11489.0 | 22 |
| 11491.0 | 23 |
| 11497.0 | 22 |
| 11503.0 | 23 |
| 11519.0 | 24 |
| 11527.0 | 25 |
| 11549.0 | 24 |
| 11551.0 | 25 |
| 11579.0 | 26 |
| 11587.0 | 27 |
| 11593.0 | 26 |
| 11597.0 | 25 |
| 11617.0 | 24 |
| 11621.0 | 23 |
| 11633.0 | 22 |
| 11657.0 | 21 |
| 11677.0 | 20 |
| 11681.0 | 19 |
| 11689.0 | 18 |
| 11699.0 | 19 |
| 11701.0 | 18 |
| 11717.0 | 17 |
| 11719.0 | 18 |
| 11731.0 | 19 |
| 11743.0 | 20 |
| 11777.0 | 19 |
| 11779.0 | 20 |
| 11783.0 | 21 |
| 11789.0 | 20 |
| 11801.0 | 19 |
| 11807.0 | 20 |
| 11813.0 | 19 |
| 11821.0 | 18 |
| 11827.0 | 19 |
| 11831.0 | 20 |
| 11833.0 | 19 |
| 11839.0 | 20 |
| 11863.0 | 21 |
| 11867.0 | 22 |
| 11887.0 | 23 |
| 11897.0 | 22 |
| 11903.0 | 23 |
| 11909.0 | 22 |
| 11923.0 | 23 |
| 11927.0 | 24 |
| 11933.0 | 23 |
| 11939.0 | 24 |
| 11941.0 | 23 |
| 11953.0 | 22 |
| 11959.0 | 23 |
| 11969.0 | 22 |
| 11971.0 | 23 |
| 11981.0 | 22 |
| 11987.0 | 23 |
| 12007.0 | 24 |
| 12011.0 | 25 |
| 12037.0 | 24 |
| 12041.0 | 23 |
| 12043.0 | 24 |
| 12049.0 | 23 |
| 12071.0 | 24 |
| 12073.0 | 23 |
| 12097.0 | 22 |
| 12101.0 | 21 |
| 12107.0 | 22 |
| 12109.0 | 21 |
| 12113.0 | 20 |
| 12119.0 | 21 |
| 12143.0 | 22 |
| 12149.0 | 21 |
| 12157.0 | 20 |
| 12161.0 | 19 |
| 12163.0 | 20 |
| 12197.0 | 19 |
| 12203.0 | 20 |
| 12211.0 | 21 |
| 12227.0 | 22 |
| 12239.0 | 23 |
| 12241.0 | 22 |
| 12251.0 | 23 |
| 12253.0 | 22 |
| 12263.0 | 23 |
| 12269.0 | 22 |
| 12277.0 | 21 |
| 12281.0 | 20 |
| 12289.0 | 19 |
| 12301.0 | 18 |
| 12323.0 | 19 |
| 12329.0 | 18 |
| 12343.0 | 19 |
| 12347.0 | 20 |
| 12373.0 | 19 |
| 12377.0 | 18 |
| 12379.0 | 19 |
| 12391.0 | 20 |
| 12401.0 | 19 |
| 12409.0 | 18 |
| 12413.0 | 17 |
| 12421.0 | 16 |
| 12433.0 | 15 |
| 12437.0 | 14 |
| 12451.0 | 15 |
| 12457.0 | 14 |
| 12473.0 | 13 |
| 12479.0 | 14 |
| 12487.0 | 15 |
| 12491.0 | 16 |
| 12497.0 | 15 |
| 12503.0 | 16 |
| 12511.0 | 17 |
| 12517.0 | 16 |
| 12527.0 | 17 |
| 12539.0 | 18 |
| 12541.0 | 17 |
| 12547.0 | 18 |
| 12553.0 | 17 |
| 12569.0 | 16 |
| 12577.0 | 15 |
| 12583.0 | 16 |
| 12589.0 | 15 |
| 12601.0 | 14 |
| 12611.0 | 15 |
| 12613.0 | 14 |
| 12619.0 | 15 |
| 12637.0 | 14 |
| 12641.0 | 13 |
| 12647.0 | 14 |
| 12653.0 | 13 |
| 12659.0 | 14 |
| 12671.0 | 15 |
| 12689.0 | 14 |
| 12697.0 | 13 |
| 12703.0 | 14 |
| 12713.0 | 13 |
| 12721.0 | 12 |
| 12739.0 | 13 |
| 12743.0 | 14 |
| 12757.0 | 13 |
| 12763.0 | 14 |
| 12781.0 | 13 |
| 12791.0 | 14 |
| 12799.0 | 15 |
| 12809.0 | 14 |
| 12821.0 | 13 |
| 12823.0 | 14 |
| 12829.0 | 13 |
| 12841.0 | 12 |
| 12853.0 | 11 |
| 12889.0 | 10 |
| 12893.0 | 9 |
| 12899.0 | 10 |
| 12907.0 | 11 |
| 12911.0 | 12 |
| 12917.0 | 11 |
| 12919.0 | 12 |
| 12923.0 | 13 |
| 12941.0 | 12 |
| 12953.0 | 11 |
| 12959.0 | 12 |
| 12967.0 | 13 |
| 12973.0 | 12 |
| 12979.0 | 13 |
| 12983.0 | 14 |
| 13001.0 | 13 |
| 13003.0 | 14 |
| 13007.0 | 15 |
| 13009.0 | 14 |
| 13033.0 | 13 |
| 13037.0 | 12 |
| 13043.0 | 13 |
| 13049.0 | 12 |
| 13063.0 | 13 |
| 13093.0 | 12 |
| 13099.0 | 13 |
| 13103.0 | 14 |
| 13109.0 | 13 |
| 13121.0 | 12 |
| 13127.0 | 13 |
| 13147.0 | 14 |
| 13151.0 | 15 |
| 13159.0 | 16 |
| 13163.0 | 17 |
| 13171.0 | 18 |
| 13177.0 | 17 |
| 13183.0 | 18 |
| 13187.0 | 19 |
| 13217.0 | 18 |
| 13219.0 | 19 |
| 13229.0 | 18 |
| 13241.0 | 17 |
| 13249.0 | 16 |
| 13259.0 | 17 |
| 13267.0 | 18 |
| 13291.0 | 19 |
| 13297.0 | 18 |
| 13309.0 | 17 |
| 13313.0 | 16 |
| 13327.0 | 17 |
| 13331.0 | 18 |
| 13337.0 | 17 |
| 13339.0 | 18 |
| 13367.0 | 19 |
| 13381.0 | 18 |
| 13397.0 | 17 |
| 13399.0 | 18 |
| 13411.0 | 19 |
| 13417.0 | 18 |
| 13421.0 | 17 |
| 13441.0 | 16 |
| 13451.0 | 17 |
| 13457.0 | 16 |
| 13463.0 | 17 |
| 13469.0 | 16 |
| 13477.0 | 15 |
| 13487.0 | 16 |
| 13499.0 | 17 |
| 13513.0 | 16 |
| 13523.0 | 17 |
| 13537.0 | 16 |
| 13553.0 | 15 |
| 13567.0 | 16 |
| 13577.0 | 15 |
| 13591.0 | 16 |
| 13597.0 | 15 |
| 13613.0 | 14 |
| 13619.0 | 15 |
| 13627.0 | 16 |
| 13633.0 | 15 |
| 13649.0 | 14 |
| 13669.0 | 13 |
| 13679.0 | 14 |
| 13681.0 | 13 |
| 13687.0 | 14 |
| 13691.0 | 15 |
| 13693.0 | 14 |
| 13697.0 | 13 |
| 13709.0 | 12 |
| 13711.0 | 13 |
| 13721.0 | 12 |
| 13723.0 | 13 |
| 13729.0 | 12 |
| 13751.0 | 13 |
| 13757.0 | 12 |
| 13759.0 | 13 |
| 13763.0 | 14 |
| 13781.0 | 13 |
| 13789.0 | 12 |
| 13799.0 | 13 |
| 13807.0 | 14 |
| 13829.0 | 13 |
| 13831.0 | 14 |
| 13841.0 | 13 |
| 13859.0 | 14 |
| 13873.0 | 13 |
| 13877.0 | 12 |
| 13879.0 | 13 |
| 13883.0 | 14 |
| 13901.0 | 13 |
| 13903.0 | 14 |
| 13907.0 | 15 |
| 13913.0 | 14 |
| 13921.0 | 13 |
| 13931.0 | 14 |
| 13933.0 | 13 |
| 13963.0 | 14 |
| 13967.0 | 15 |
| 13997.0 | 14 |
| 13999.0 | 15 |
| 14009.0 | 14 |
| 14011.0 | 15 |
| 14029.0 | 14 |
| 14033.0 | 13 |
| 14051.0 | 14 |
| 14057.0 | 13 |
| 14071.0 | 14 |
| 14081.0 | 13 |
| 14083.0 | 14 |
| 14087.0 | 15 |
| 14107.0 | 16 |
| 14143.0 | 17 |
| 14149.0 | 16 |
| 14153.0 | 15 |
| 14159.0 | 16 |
| 14173.0 | 15 |
| 14177.0 | 14 |
| 14197.0 | 13 |
| 14207.0 | 14 |
| 14221.0 | 13 |
| 14243.0 | 14 |
| 14249.0 | 13 |
| 14251.0 | 14 |
| 14281.0 | 13 |
| 14293.0 | 12 |
| 14303.0 | 13 |
| 14321.0 | 12 |
| 14323.0 | 13 |
| 14327.0 | 14 |
| 14341.0 | 13 |
| 14347.0 | 14 |
| 14369.0 | 13 |
| 14387.0 | 14 |
| 14389.0 | 13 |
| 14401.0 | 12 |
| 14407.0 | 13 |
| 14411.0 | 14 |
| 14419.0 | 15 |
| 14423.0 | 16 |
| 14431.0 | 17 |
| 14437.0 | 16 |
| 14447.0 | 17 |
| 14449.0 | 16 |
| 14461.0 | 15 |
| 14479.0 | 16 |
| 14489.0 | 15 |
| 14503.0 | 16 |
| 14519.0 | 17 |
| 14533.0 | 16 |
| 14537.0 | 15 |
| 14543.0 | 16 |
| 14549.0 | 15 |
| 14551.0 | 16 |
| 14557.0 | 15 |
| 14561.0 | 14 |
| 14563.0 | 15 |
| 14591.0 | 16 |
| 14593.0 | 15 |
| 14621.0 | 14 |
| 14627.0 | 15 |
| 14629.0 | 14 |
| 14633.0 | 13 |
| 14639.0 | 14 |
| 14653.0 | 13 |
| 14657.0 | 12 |
| 14669.0 | 11 |
| 14683.0 | 12 |
| 14699.0 | 13 |
| 14713.0 | 12 |
| 14717.0 | 11 |
| 14723.0 | 12 |
| 14731.0 | 13 |
| 14737.0 | 12 |
| 14741.0 | 11 |
| 14747.0 | 12 |
| 14753.0 | 11 |
| 14759.0 | 12 |
| 14767.0 | 13 |
| 14771.0 | 14 |
| 14779.0 | 15 |
| 14783.0 | 16 |
| 14797.0 | 15 |
| 14813.0 | 14 |
| 14821.0 | 13 |
| 14827.0 | 14 |
| 14831.0 | 15 |
| 14843.0 | 16 |
| 14851.0 | 17 |
| 14867.0 | 18 |
| 14869.0 | 17 |
| 14879.0 | 18 |
| 14887.0 | 19 |
| 14891.0 | 20 |
| 14897.0 | 19 |
| 14923.0 | 20 |
| 14929.0 | 19 |
| 14939.0 | 20 |
| 14947.0 | 21 |
| 14951.0 | 22 |
| 14957.0 | 21 |
| 14969.0 | 20 |
| 14983.0 | 21 |
| 15013.0 | 20 |
| 15017.0 | 19 |
| 15031.0 | 20 |
| 15053.0 | 19 |
| 15061.0 | 18 |
| 15073.0 | 17 |
| 15077.0 | 16 |
| 15083.0 | 17 |
| 15091.0 | 18 |
| 15101.0 | 17 |
| 15107.0 | 18 |
| 15121.0 | 17 |
| 15131.0 | 18 |
| 15137.0 | 17 |
| 15139.0 | 18 |
| 15149.0 | 17 |
| 15161.0 | 16 |
| 15173.0 | 15 |
| 15187.0 | 16 |
| 15193.0 | 15 |
| 15199.0 | 16 |
| 15217.0 | 15 |
| 15227.0 | 16 |
| 15233.0 | 15 |
| 15241.0 | 14 |
| 15259.0 | 15 |
| 15263.0 | 16 |
| 15269.0 | 15 |
| 15271.0 | 16 |
| 15277.0 | 15 |
| 15287.0 | 16 |
| 15289.0 | 15 |
| 15299.0 | 16 |
| 15307.0 | 17 |
| 15313.0 | 16 |
| 15319.0 | 17 |
| 15329.0 | 16 |
| 15331.0 | 17 |
| 15349.0 | 16 |
| 15359.0 | 17 |
| 15361.0 | 16 |
| 15373.0 | 15 |
| 15377.0 | 14 |
| 15383.0 | 15 |
| 15391.0 | 16 |
| 15401.0 | 15 |
| 15413.0 | 14 |
| 15427.0 | 15 |
| 15439.0 | 16 |
| 15443.0 | 17 |
| 15451.0 | 18 |
| 15461.0 | 17 |
| 15467.0 | 18 |
| 15473.0 | 17 |
| 15493.0 | 16 |
| 15497.0 | 15 |
| 15511.0 | 16 |
| 15527.0 | 17 |
| 15541.0 | 16 |
| 15551.0 | 17 |
| 15559.0 | 18 |
| 15569.0 | 17 |
| 15581.0 | 16 |
| 15583.0 | 17 |
| 15601.0 | 16 |
| 15607.0 | 17 |
| 15619.0 | 18 |
| 15629.0 | 17 |
| 15641.0 | 16 |
| 15643.0 | 17 |
| 15647.0 | 18 |
| 15649.0 | 17 |
| 15661.0 | 16 |
| 15667.0 | 17 |
| 15671.0 | 18 |
| 15679.0 | 19 |
| 15683.0 | 20 |
| 15727.0 | 21 |
| 15731.0 | 22 |
| 15733.0 | 21 |
| 15737.0 | 20 |
| 15739.0 | 21 |
| 15749.0 | 20 |
| 15761.0 | 19 |
| 15767.0 | 20 |
| 15773.0 | 19 |
| 15787.0 | 20 |
| 15791.0 | 21 |
| 15797.0 | 20 |
| 15803.0 | 21 |
| 15809.0 | 20 |
| 15817.0 | 19 |
| 15823.0 | 20 |
| 15859.0 | 21 |
| 15877.0 | 20 |
| 15881.0 | 19 |
| 15887.0 | 20 |
| 15889.0 | 19 |
| 15901.0 | 18 |
| 15907.0 | 19 |
| 15913.0 | 18 |
| 15919.0 | 19 |
| 15923.0 | 20 |
| 15937.0 | 19 |
| 15959.0 | 20 |
| 15971.0 | 21 |
| 15973.0 | 20 |
| 15991.0 | 21 |
| 16001.0 | 20 |
| 16007.0 | 21 |
| 16033.0 | 20 |
| 16057.0 | 19 |
| 16061.0 | 18 |
| 16063.0 | 19 |
| 16067.0 | 20 |
| 16069.0 | 19 |
| 16073.0 | 18 |
| 16087.0 | 19 |
| 16091.0 | 20 |
| 16097.0 | 19 |
| 16103.0 | 20 |
| 16111.0 | 21 |
| 16127.0 | 22 |
| 16139.0 | 23 |
| 16141.0 | 22 |
| 16183.0 | 23 |
| 16187.0 | 24 |
| 16189.0 | 23 |
| 16193.0 | 22 |
| 16217.0 | 21 |
| 16223.0 | 22 |
| 16229.0 | 21 |
| 16231.0 | 22 |
| 16249.0 | 21 |
| 16253.0 | 20 |
| 16267.0 | 21 |
| 16273.0 | 20 |
| 16301.0 | 19 |
| 16319.0 | 20 |
| 16333.0 | 19 |
| 16339.0 | 20 |
| 16349.0 | 19 |
| 16361.0 | 18 |
| 16363.0 | 19 |
| 16369.0 | 18 |
| 16381.0 | 17 |
| 16411.0 | 18 |
| 16417.0 | 17 |
| 16421.0 | 16 |
| 16427.0 | 17 |
| 16433.0 | 16 |
| 16447.0 | 17 |
| 16451.0 | 18 |
| 16453.0 | 17 |
| 16477.0 | 16 |
| 16481.0 | 15 |
| 16487.0 | 16 |
| 16493.0 | 15 |
| 16519.0 | 16 |
| 16529.0 | 15 |
| 16547.0 | 16 |
| 16553.0 | 15 |
| 16561.0 | 14 |
| 16567.0 | 15 |
| 16573.0 | 14 |
| 16603.0 | 15 |
| 16607.0 | 16 |
| 16619.0 | 17 |
| 16631.0 | 18 |
| 16633.0 | 17 |
| 16649.0 | 16 |
| 16651.0 | 17 |
| 16657.0 | 16 |
| 16661.0 | 15 |
| 16673.0 | 14 |
| 16691.0 | 15 |
| 16693.0 | 14 |
| 16699.0 | 15 |
| 16703.0 | 16 |
| 16729.0 | 15 |
| 16741.0 | 14 |
| 16747.0 | 15 |
| 16759.0 | 16 |
| 16763.0 | 17 |
| 16787.0 | 18 |
| 16811.0 | 19 |
| 16823.0 | 20 |
| 16829.0 | 19 |
| 16831.0 | 20 |
| 16843.0 | 21 |
| 16871.0 | 22 |
| 16879.0 | 23 |
| 16883.0 | 24 |
| 16889.0 | 23 |
| 16901.0 | 22 |
| 16903.0 | 23 |
| 16921.0 | 22 |
| 16927.0 | 23 |
| 16931.0 | 24 |
| 16937.0 | 23 |
| 16943.0 | 24 |
| 16963.0 | 25 |
| 16979.0 | 26 |
| 16981.0 | 25 |
| 16987.0 | 26 |
| 16993.0 | 25 |
| 17011.0 | 26 |
| 17021.0 | 25 |
| 17027.0 | 26 |
| 17029.0 | 25 |
| 17033.0 | 24 |
| 17041.0 | 23 |
| 17047.0 | 24 |
| 17053.0 | 23 |
| 17077.0 | 22 |
| 17093.0 | 21 |
| 17099.0 | 22 |
| 17107.0 | 23 |
| 17117.0 | 22 |
| 17123.0 | 23 |
| 17137.0 | 22 |
| 17159.0 | 23 |
| 17167.0 | 24 |
| 17183.0 | 25 |
| 17189.0 | 24 |
| 17191.0 | 25 |
| 17203.0 | 26 |
| 17207.0 | 27 |
| 17209.0 | 26 |
| 17231.0 | 27 |
| 17239.0 | 28 |
| 17257.0 | 27 |
| 17291.0 | 28 |
| 17293.0 | 27 |
| 17299.0 | 28 |
| 17317.0 | 27 |
| 17321.0 | 26 |
| 17327.0 | 27 |
| 17333.0 | 26 |
| 17341.0 | 25 |
| 17351.0 | 26 |
| 17359.0 | 27 |
| 17377.0 | 26 |
| 17383.0 | 27 |
| 17387.0 | 28 |
| 17389.0 | 27 |
| 17393.0 | 26 |
| 17401.0 | 25 |
| 17417.0 | 24 |
| 17419.0 | 25 |
| 17431.0 | 26 |
| 17443.0 | 27 |
| 17449.0 | 26 |
| 17467.0 | 27 |
| 17471.0 | 28 |
| 17477.0 | 27 |
| 17483.0 | 28 |
| 17489.0 | 27 |
| 17491.0 | 28 |
| 17497.0 | 27 |
| 17509.0 | 26 |
| 17519.0 | 27 |
| 17539.0 | 28 |
| 17551.0 | 29 |
| 17569.0 | 28 |
| 17573.0 | 27 |
| 17579.0 | 28 |
| 17581.0 | 27 |
| 17597.0 | 26 |
| 17599.0 | 27 |
| 17609.0 | 26 |
| 17623.0 | 27 |
| 17627.0 | 28 |
| 17657.0 | 27 |
| 17659.0 | 28 |
| 17669.0 | 27 |
| 17681.0 | 26 |
| 17683.0 | 27 |
| 17707.0 | 28 |
| 17713.0 | 27 |
| 17729.0 | 26 |
| 17737.0 | 25 |
| 17747.0 | 26 |
| 17749.0 | 25 |
| 17761.0 | 24 |
| 17783.0 | 25 |
| 17789.0 | 24 |
| 17791.0 | 25 |
| 17807.0 | 26 |
| 17827.0 | 27 |
| 17837.0 | 26 |
| 17839.0 | 27 |
| 17851.0 | 28 |
| 17863.0 | 29 |
| 17881.0 | 28 |
| 17891.0 | 29 |
| 17903.0 | 30 |
| 17909.0 | 29 |
| 17911.0 | 30 |
| 17921.0 | 29 |
| 17923.0 | 30 |
| 17929.0 | 29 |
| 17939.0 | 30 |
| 17957.0 | 29 |
| 17959.0 | 30 |
| 17971.0 | 31 |
| 17977.0 | 30 |
| 17981.0 | 29 |
| 17987.0 | 30 |
| 17989.0 | 29 |
| 18013.0 | 28 |
| 18041.0 | 27 |
| 18043.0 | 28 |
| 18047.0 | 29 |
| 18049.0 | 28 |
| 18059.0 | 29 |
| 18061.0 | 28 |
| 18077.0 | 27 |
| 18089.0 | 26 |
| 18097.0 | 25 |
| 18119.0 | 26 |
| 18121.0 | 25 |
| 18127.0 | 26 |
| 18131.0 | 27 |
| 18133.0 | 26 |
| 18143.0 | 27 |
| 18149.0 | 26 |
| 18169.0 | 25 |
| 18181.0 | 24 |
| 18191.0 | 25 |
| 18199.0 | 26 |
| 18211.0 | 27 |
| 18217.0 | 26 |
| 18223.0 | 27 |
| 18229.0 | 26 |
| 18233.0 | 25 |
| 18251.0 | 26 |
| 18253.0 | 25 |
| 18257.0 | 24 |
| 18269.0 | 23 |
| 18287.0 | 24 |
| 18289.0 | 23 |
| 18301.0 | 22 |
| 18307.0 | 23 |
| 18311.0 | 24 |
| 18313.0 | 23 |
| 18329.0 | 22 |
| 18341.0 | 21 |
| 18353.0 | 20 |
| 18367.0 | 21 |
| 18371.0 | 22 |
| 18379.0 | 23 |
| 18397.0 | 22 |
| 18401.0 | 21 |
| 18413.0 | 20 |
| 18427.0 | 21 |
| 18433.0 | 20 |
| 18439.0 | 21 |
| 18443.0 | 22 |
| 18451.0 | 23 |
| 18457.0 | 22 |
| 18461.0 | 21 |
| 18481.0 | 20 |
| 18493.0 | 19 |
| 18503.0 | 20 |
| 18517.0 | 19 |
| 18521.0 | 18 |
| 18523.0 | 19 |
| 18539.0 | 20 |
| 18541.0 | 19 |
| 18553.0 | 18 |
| 18583.0 | 19 |
| 18587.0 | 20 |
| 18593.0 | 19 |
| 18617.0 | 18 |
| 18637.0 | 17 |
| 18661.0 | 16 |
| 18671.0 | 17 |
| 18679.0 | 18 |
| 18691.0 | 19 |
| 18701.0 | 18 |
| 18713.0 | 17 |
| 18719.0 | 18 |
| 18731.0 | 19 |
| 18743.0 | 20 |
| 18749.0 | 19 |
| 18757.0 | 18 |
| 18773.0 | 17 |
| 18787.0 | 18 |
| 18793.0 | 17 |
| 18797.0 | 16 |
| 18803.0 | 17 |
| 18839.0 | 18 |
| 18859.0 | 19 |
| 18869.0 | 18 |
| 18899.0 | 19 |
| 18911.0 | 20 |
| 18913.0 | 19 |
| 18917.0 | 18 |
| 18919.0 | 19 |
| 18947.0 | 20 |
| 18959.0 | 21 |
| 18973.0 | 20 |
| 18979.0 | 21 |
| 19001.0 | 20 |
| 19009.0 | 19 |
| 19013.0 | 18 |
| 19031.0 | 19 |
| 19037.0 | 18 |
| 19051.0 | 19 |
| 19069.0 | 18 |
| 19073.0 | 17 |
| 19079.0 | 18 |
| 19081.0 | 17 |
| 19087.0 | 18 |
| 19121.0 | 17 |
| 19139.0 | 18 |
| 19141.0 | 17 |
| 19157.0 | 16 |
| 19163.0 | 17 |
| 19181.0 | 16 |
| 19183.0 | 17 |
| 19207.0 | 18 |
| 19211.0 | 19 |
| 19213.0 | 18 |
| 19219.0 | 19 |
| 19231.0 | 20 |
| 19237.0 | 19 |
| 19249.0 | 18 |
| 19259.0 | 19 |
| 19267.0 | 20 |
| 19273.0 | 19 |
| 19289.0 | 18 |
| 19301.0 | 17 |
| 19309.0 | 16 |
| 19319.0 | 17 |
| 19333.0 | 16 |
| 19373.0 | 15 |
| 19379.0 | 16 |
| 19381.0 | 15 |
| 19387.0 | 16 |
| 19391.0 | 17 |
| 19403.0 | 18 |
| 19417.0 | 17 |
| 19421.0 | 16 |
| 19423.0 | 17 |
| 19427.0 | 18 |
| 19429.0 | 17 |
| 19433.0 | 16 |
| 19441.0 | 15 |
| 19447.0 | 16 |
| 19457.0 | 15 |
| 19463.0 | 16 |
| 19469.0 | 15 |
| 19471.0 | 16 |
| 19477.0 | 15 |
| 19483.0 | 16 |
| 19489.0 | 15 |
| 19501.0 | 14 |
| 19507.0 | 15 |
| 19531.0 | 16 |
| 19541.0 | 15 |
| 19543.0 | 16 |
| 19553.0 | 15 |
| 19559.0 | 16 |
| 19571.0 | 17 |
| 19577.0 | 16 |
| 19583.0 | 17 |
| 19597.0 | 16 |
| 19603.0 | 17 |
| 19609.0 | 16 |
| 19661.0 | 15 |
| 19681.0 | 14 |
| 19687.0 | 15 |
| 19697.0 | 14 |
| 19699.0 | 15 |
| 19709.0 | 14 |
| 19717.0 | 13 |
| 19727.0 | 14 |
| 19739.0 | 15 |
| 19751.0 | 16 |
| 19753.0 | 15 |
| 19759.0 | 16 |
| 19763.0 | 17 |
| 19777.0 | 16 |
| 19793.0 | 15 |
| 19801.0 | 14 |
| 19813.0 | 13 |
| 19819.0 | 14 |
| 19841.0 | 13 |
| 19843.0 | 14 |
| 19853.0 | 13 |
| 19861.0 | 12 |
| 19867.0 | 13 |
| 19889.0 | 12 |
| 19891.0 | 13 |
| 19913.0 | 12 |
| 19919.0 | 13 |
| 19927.0 | 14 |
| 19937.0 | 13 |
| 19949.0 | 12 |
| 19961.0 | 11 |
| 19963.0 | 12 |
| 19973.0 | 11 |
| 19979.0 | 12 |
| 19991.0 | 13 |
| 19993.0 | 12 |
| 19997.0 | 11 |
| 20011.0 | 12 |
| 20021.0 | 11 |
| 20023.0 | 12 |
| 20029.0 | 11 |
| 20047.0 | 12 |
| 20051.0 | 13 |
| 20063.0 | 14 |
| 20071.0 | 15 |
| 20089.0 | 14 |
| 20101.0 | 13 |
| 20107.0 | 14 |
| 20113.0 | 13 |
| 20117.0 | 12 |
| 20123.0 | 13 |
| 20129.0 | 12 |
| 20143.0 | 13 |
| 20147.0 | 14 |
| 20149.0 | 13 |
| 20161.0 | 12 |
| 20173.0 | 11 |
| 20177.0 | 10 |
| 20183.0 | 11 |
| 20201.0 | 10 |
| 20219.0 | 11 |
| 20231.0 | 12 |
| 20233.0 | 11 |
| 20249.0 | 10 |
| 20261.0 | 9 |
| 20269.0 | 8 |
| 20287.0 | 9 |
| 20297.0 | 8 |
| 20323.0 | 9 |
| 20327.0 | 10 |
| 20333.0 | 9 |
| 20341.0 | 8 |
| 20347.0 | 9 |
| 20353.0 | 8 |
| 20357.0 | 7 |
| 20359.0 | 8 |
| 20369.0 | 7 |
| 20389.0 | 6 |
| 20393.0 | 5 |
| 20399.0 | 6 |
| 20407.0 | 7 |
| 20411.0 | 8 |
| 20431.0 | 9 |
| 20441.0 | 8 |
| 20443.0 | 9 |
| 20477.0 | 8 |
| 20479.0 | 9 |
| 20483.0 | 10 |
| 20507.0 | 11 |
| 20509.0 | 10 |
| 20521.0 | 9 |
| 20533.0 | 8 |
| 20543.0 | 9 |
| 20549.0 | 8 |
| 20551.0 | 9 |
| 20563.0 | 10 |
| 20593.0 | 9 |
| 20599.0 | 10 |
| 20611.0 | 11 |
| 20627.0 | 12 |
| 20639.0 | 13 |
| 20641.0 | 12 |
| 20663.0 | 13 |
| 20681.0 | 12 |
| 20693.0 | 11 |
| 20707.0 | 12 |
| 20717.0 | 11 |
| 20719.0 | 12 |
| 20731.0 | 13 |
| 20743.0 | 14 |
| 20747.0 | 15 |
| 20749.0 | 14 |
| 20753.0 | 13 |
| 20759.0 | 14 |
| 20771.0 | 15 |
| 20773.0 | 14 |
| 20789.0 | 13 |
| 20807.0 | 14 |
| 20809.0 | 13 |
| 20849.0 | 12 |
| 20857.0 | 11 |
| 20873.0 | 10 |
| 20879.0 | 11 |
| 20887.0 | 12 |
| 20897.0 | 11 |
| 20899.0 | 12 |
| 20903.0 | 13 |
| 20921.0 | 12 |
| 20929.0 | 11 |
| 20939.0 | 12 |
| 20947.0 | 13 |
| 20959.0 | 14 |
| 20963.0 | 15 |
| 20981.0 | 14 |
| 20983.0 | 15 |
| 21001.0 | 14 |
| 21011.0 | 15 |
| 21013.0 | 14 |
| 21017.0 | 13 |
| 21019.0 | 14 |
| 21023.0 | 15 |
| 21031.0 | 16 |
| 21059.0 | 17 |
| 21061.0 | 16 |
| 21067.0 | 17 |
| 21089.0 | 16 |
| 21101.0 | 15 |
| 21107.0 | 16 |
| 21121.0 | 15 |
| 21139.0 | 16 |
| 21143.0 | 17 |
| 21149.0 | 16 |
| 21157.0 | 15 |
| 21163.0 | 16 |
| 21169.0 | 15 |
| 21179.0 | 16 |
| 21187.0 | 17 |
| 21191.0 | 18 |
| 21193.0 | 17 |
| 21211.0 | 18 |
| 21221.0 | 17 |
| 21227.0 | 18 |
| 21247.0 | 19 |
| 21269.0 | 18 |
| 21277.0 | 17 |
| 21283.0 | 18 |
| 21313.0 | 17 |
| 21317.0 | 16 |
| 21319.0 | 17 |
| 21323.0 | 18 |
| 21341.0 | 17 |
| 21347.0 | 18 |
| 21377.0 | 17 |
| 21379.0 | 18 |
| 21383.0 | 19 |
| 21391.0 | 20 |
| 21397.0 | 19 |
| 21401.0 | 18 |
| 21407.0 | 19 |
| 21419.0 | 20 |
| 21433.0 | 19 |
| 21467.0 | 20 |
| 21481.0 | 19 |
| 21487.0 | 20 |
| 21491.0 | 21 |
| 21493.0 | 20 |
| 21499.0 | 21 |
| 21503.0 | 22 |
| 21517.0 | 21 |
| 21521.0 | 20 |
| 21523.0 | 21 |
| 21529.0 | 20 |
| 21557.0 | 19 |
| 21559.0 | 20 |
| 21563.0 | 21 |
| 21569.0 | 20 |
| 21577.0 | 19 |
| 21587.0 | 20 |
| 21589.0 | 19 |
| 21599.0 | 20 |
| 21601.0 | 19 |
| 21611.0 | 20 |
| 21613.0 | 19 |
| 21617.0 | 18 |
| 21647.0 | 19 |
| 21649.0 | 18 |
| 21661.0 | 17 |
| 21673.0 | 16 |
| 21683.0 | 17 |
| 21701.0 | 16 |
| 21713.0 | 15 |
| 21727.0 | 16 |
| 21737.0 | 15 |
| 21739.0 | 16 |
| 21751.0 | 17 |
| 21757.0 | 16 |
| 21767.0 | 17 |
| 21773.0 | 16 |
| 21787.0 | 17 |
| 21799.0 | 18 |
| 21803.0 | 19 |
| 21817.0 | 18 |
| 21821.0 | 17 |
| 21839.0 | 18 |
| 21841.0 | 17 |
| 21851.0 | 18 |
| 21859.0 | 19 |
| 21863.0 | 20 |
| 21871.0 | 21 |
| 21881.0 | 20 |
| 21893.0 | 19 |
| 21911.0 | 20 |
| 21929.0 | 19 |
| 21937.0 | 18 |
| 21943.0 | 19 |
| 21961.0 | 18 |
| 21977.0 | 17 |
| 21991.0 | 18 |
| 21997.0 | 17 |
| 22003.0 | 18 |
| 22013.0 | 17 |
| 22027.0 | 18 |
| 22031.0 | 19 |
| 22037.0 | 18 |
| 22039.0 | 19 |
| 22051.0 | 20 |
| 22063.0 | 21 |
| 22067.0 | 22 |
| 22073.0 | 21 |
| 22079.0 | 22 |
| 22091.0 | 23 |
| 22093.0 | 22 |
| 22109.0 | 21 |
| 22111.0 | 22 |
| 22123.0 | 23 |
| 22129.0 | 22 |
| 22133.0 | 21 |
| 22147.0 | 22 |
| 22153.0 | 21 |
| 22157.0 | 20 |
| 22159.0 | 21 |
| 22171.0 | 22 |
| 22189.0 | 21 |
| 22193.0 | 20 |
| 22229.0 | 19 |
| 22247.0 | 20 |
| 22259.0 | 21 |
| 22271.0 | 22 |
| 22273.0 | 21 |
| 22277.0 | 20 |
| 22279.0 | 21 |
| 22283.0 | 22 |
| 22291.0 | 23 |
| 22303.0 | 24 |
| 22307.0 | 25 |
| 22343.0 | 26 |
| 22349.0 | 25 |
| 22367.0 | 26 |
| 22369.0 | 25 |
| 22381.0 | 24 |
| 22391.0 | 25 |
| 22397.0 | 24 |
| 22409.0 | 23 |
| 22433.0 | 22 |
| 22441.0 | 21 |
| 22447.0 | 22 |
| 22453.0 | 21 |
| 22469.0 | 20 |
| 22481.0 | 19 |
| 22483.0 | 20 |
| 22501.0 | 19 |
| 22511.0 | 20 |
| 22531.0 | 21 |
| 22541.0 | 20 |
| 22543.0 | 21 |
| 22549.0 | 20 |
| 22567.0 | 21 |
| 22571.0 | 22 |
| 22573.0 | 21 |
| 22613.0 | 20 |
| 22619.0 | 21 |
| 22621.0 | 20 |
| 22637.0 | 19 |
| 22639.0 | 20 |
| 22643.0 | 21 |
| 22651.0 | 22 |
| 22669.0 | 21 |
| 22679.0 | 22 |
| 22691.0 | 23 |
| 22697.0 | 22 |
| 22699.0 | 23 |
| 22709.0 | 22 |
| 22717.0 | 21 |
| 22721.0 | 20 |
| 22727.0 | 21 |
| 22739.0 | 22 |
| 22741.0 | 21 |
| 22751.0 | 22 |
| 22769.0 | 21 |
| 22777.0 | 20 |
| 22783.0 | 21 |
| 22787.0 | 22 |
| 22807.0 | 23 |
| 22811.0 | 24 |
| 22817.0 | 23 |
| 22853.0 | 22 |
| 22859.0 | 23 |
| 22861.0 | 22 |
| 22871.0 | 23 |
| 22877.0 | 22 |
| 22901.0 | 21 |
| 22907.0 | 22 |
| 22921.0 | 21 |
| 22937.0 | 20 |
| 22943.0 | 21 |
| 22961.0 | 20 |
| 22963.0 | 21 |
| 22973.0 | 20 |
| 22993.0 | 19 |
| 23003.0 | 20 |
| 23011.0 | 21 |
| 23017.0 | 20 |
| 23021.0 | 19 |
| 23027.0 | 20 |
| 23029.0 | 19 |
| 23039.0 | 20 |
| 23041.0 | 19 |
| 23053.0 | 18 |
| 23057.0 | 17 |
| 23059.0 | 18 |
| 23063.0 | 19 |
| 23071.0 | 20 |
| 23081.0 | 19 |
| 23087.0 | 20 |
| 23099.0 | 21 |
| 23117.0 | 20 |
| 23131.0 | 21 |
| 23143.0 | 22 |
| 23159.0 | 23 |
| 23167.0 | 24 |
| 23173.0 | 23 |
| 23189.0 | 22 |
| 23197.0 | 21 |
| 23201.0 | 20 |
| 23203.0 | 21 |
| 23209.0 | 20 |
| 23227.0 | 21 |
| 23251.0 | 22 |
| 23269.0 | 21 |
| 23279.0 | 22 |
| 23291.0 | 23 |
| 23293.0 | 22 |
| 23297.0 | 21 |
| 23311.0 | 22 |
| 23321.0 | 21 |
| 23327.0 | 22 |
| 23333.0 | 21 |
| 23339.0 | 22 |
| 23357.0 | 21 |
| 23369.0 | 20 |
| 23371.0 | 21 |
| 23399.0 | 22 |
| 23417.0 | 21 |
| 23431.0 | 22 |
| 23447.0 | 23 |
| 23459.0 | 24 |
| 23473.0 | 23 |
| 23497.0 | 22 |
| 23509.0 | 21 |
| 23531.0 | 22 |
| 23537.0 | 21 |
| 23539.0 | 22 |
| 23549.0 | 21 |
| 23557.0 | 20 |
| 23561.0 | 19 |
| 23563.0 | 20 |
| 23567.0 | 21 |
| 23581.0 | 20 |
| 23593.0 | 19 |
| 23599.0 | 20 |
| 23603.0 | 21 |
| 23609.0 | 20 |
| 23623.0 | 21 |
| 23627.0 | 22 |
| 23629.0 | 21 |
| 23633.0 | 20 |
| 23663.0 | 21 |
| 23669.0 | 20 |
| 23671.0 | 21 |
| 23677.0 | 20 |
| 23687.0 | 21 |
| 23689.0 | 20 |
| 23719.0 | 21 |
| 23741.0 | 20 |
| 23743.0 | 21 |
| 23747.0 | 22 |
| 23753.0 | 21 |
| 23761.0 | 20 |
| 23767.0 | 21 |
| 23773.0 | 20 |
| 23789.0 | 19 |
| 23801.0 | 18 |
| 23813.0 | 17 |
| 23819.0 | 18 |
| 23827.0 | 19 |
| 23831.0 | 20 |
| 23833.0 | 19 |
| 23857.0 | 18 |
| 23869.0 | 17 |
| 23873.0 | 16 |
| 23879.0 | 17 |
| 23887.0 | 18 |
| 23893.0 | 17 |
| 23899.0 | 18 |
| 23909.0 | 17 |
| 23911.0 | 18 |
| 23917.0 | 17 |
| 23929.0 | 16 |
| 23957.0 | 15 |
| 23971.0 | 16 |
| 23977.0 | 15 |
| 23981.0 | 14 |
| 23993.0 | 13 |
| 24001.0 | 12 |
| 24007.0 | 13 |
| 24019.0 | 14 |
| 24023.0 | 15 |
| 24029.0 | 14 |
| 24043.0 | 15 |
| 24049.0 | 14 |
| 24061.0 | 13 |
| 24071.0 | 14 |
| 24077.0 | 13 |
| 24083.0 | 14 |
| 24091.0 | 15 |
| 24097.0 | 14 |
| 24103.0 | 15 |
| 24107.0 | 16 |
| 24109.0 | 15 |
| 24113.0 | 14 |
| 24121.0 | 13 |
| 24133.0 | 12 |
| 24137.0 | 11 |
| 24151.0 | 12 |
| 24169.0 | 11 |
| 24179.0 | 12 |
| 24181.0 | 11 |
| 24197.0 | 10 |
| 24203.0 | 11 |
| 24223.0 | 12 |
| 24229.0 | 11 |
| 24239.0 | 12 |
| 24247.0 | 13 |
| 24251.0 | 14 |
| 24281.0 | 13 |
| 24317.0 | 12 |
| 24329.0 | 11 |
| 24337.0 | 10 |
| 24359.0 | 11 |
| 24371.0 | 12 |
| 24373.0 | 11 |
| 24379.0 | 12 |
| 24391.0 | 13 |
| 24407.0 | 14 |
| 24413.0 | 13 |
| 24419.0 | 14 |
| 24421.0 | 13 |
| 24439.0 | 14 |
| 24443.0 | 15 |
| 24469.0 | 14 |
| 24473.0 | 13 |
| 24481.0 | 12 |
| 24499.0 | 13 |
| 24509.0 | 12 |
| 24517.0 | 11 |
| 24527.0 | 12 |
| 24533.0 | 11 |
| 24547.0 | 12 |
| 24551.0 | 13 |
| 24571.0 | 14 |
| 24593.0 | 13 |
| 24611.0 | 14 |
| 24623.0 | 15 |
| 24631.0 | 16 |
| 24659.0 | 17 |
| 24671.0 | 18 |
| 24677.0 | 17 |
| 24683.0 | 18 |
| 24691.0 | 19 |
| 24697.0 | 18 |
| 24709.0 | 17 |
| 24733.0 | 16 |
| 24749.0 | 15 |
| 24763.0 | 16 |
| 24767.0 | 17 |
| 24781.0 | 16 |
| 24793.0 | 15 |
| 24799.0 | 16 |
| 24809.0 | 15 |
| 24821.0 | 14 |
| 24841.0 | 13 |
| 24847.0 | 14 |
| 24851.0 | 15 |
| 24859.0 | 16 |
| 24877.0 | 15 |
| 24889.0 | 14 |
| 24907.0 | 15 |
| 24917.0 | 14 |
| 24919.0 | 15 |
| 24923.0 | 16 |
| 24943.0 | 17 |
| 24953.0 | 16 |
| 24967.0 | 17 |
| 24971.0 | 18 |
| 24977.0 | 17 |
| 24979.0 | 18 |
| 24989.0 | 17 |
| 25013.0 | 16 |
| 25031.0 | 17 |
| 25033.0 | 16 |
| 25037.0 | 15 |
| 25057.0 | 14 |
| 25073.0 | 13 |
| 25087.0 | 14 |
| 25097.0 | 13 |
| 25111.0 | 14 |
| 25117.0 | 13 |
| 25121.0 | 12 |
| 25127.0 | 13 |
| 25147.0 | 14 |
| 25153.0 | 13 |
| 25163.0 | 14 |
| 25169.0 | 13 |
| 25171.0 | 14 |
| 25183.0 | 15 |
| 25189.0 | 14 |
| 25219.0 | 15 |
| 25229.0 | 14 |
| 25237.0 | 13 |
| 25243.0 | 14 |
| 25247.0 | 15 |
| 25253.0 | 14 |
| 25261.0 | 13 |
| 25301.0 | 12 |
| 25303.0 | 13 |
| 25307.0 | 14 |
| 25309.0 | 13 |
| 25321.0 | 12 |
| 25339.0 | 13 |
| 25343.0 | 14 |
| 25349.0 | 13 |
| 25357.0 | 12 |
| 25367.0 | 13 |
| 25373.0 | 12 |
| 25391.0 | 13 |
| 25409.0 | 12 |
| 25411.0 | 13 |
| 25423.0 | 14 |
| 25439.0 | 15 |
| 25447.0 | 16 |
| 25453.0 | 15 |
| 25457.0 | 14 |
| 25463.0 | 15 |
| 25469.0 | 14 |
| 25471.0 | 15 |
| 25523.0 | 16 |
| 25537.0 | 15 |
| 25541.0 | 14 |
| 25561.0 | 13 |
| 25577.0 | 12 |
| 25579.0 | 13 |
| 25583.0 | 14 |
| 25589.0 | 13 |
| 25601.0 | 12 |
| 25603.0 | 13 |
| 25609.0 | 12 |
| 25621.0 | 11 |
| 25633.0 | 10 |
| 25639.0 | 11 |
| 25643.0 | 12 |
| 25657.0 | 11 |
| 25667.0 | 12 |
| 25673.0 | 11 |
| 25679.0 | 12 |
| 25693.0 | 11 |
| 25703.0 | 12 |
| 25717.0 | 11 |
| 25733.0 | 10 |
| 25741.0 | 9 |
| 25747.0 | 10 |
| 25759.0 | 11 |
| 25763.0 | 12 |
| 25771.0 | 13 |
| 25793.0 | 12 |
| 25799.0 | 13 |
| 25801.0 | 12 |
| 25819.0 | 13 |
| 25841.0 | 12 |
| 25847.0 | 13 |
| 25849.0 | 12 |
| 25867.0 | 13 |
| 25873.0 | 12 |
| 25889.0 | 11 |
| 25903.0 | 12 |
| 25913.0 | 11 |
| 25919.0 | 12 |
| 25931.0 | 13 |
| 25933.0 | 12 |
| 25939.0 | 13 |
| 25943.0 | 14 |
| 25951.0 | 15 |
| 25969.0 | 14 |
| 25981.0 | 13 |
| 25997.0 | 12 |
| 25999.0 | 13 |
| 26003.0 | 14 |
| 26017.0 | 13 |
| 26021.0 | 12 |
| 26029.0 | 11 |
| 26041.0 | 10 |
| 26053.0 | 9 |
| 26083.0 | 10 |
| 26099.0 | 11 |
| 26107.0 | 12 |
| 26111.0 | 13 |
| 26113.0 | 12 |
| 26119.0 | 13 |
| 26141.0 | 12 |
| 26153.0 | 11 |
| 26161.0 | 10 |
| 26171.0 | 11 |
| 26177.0 | 10 |
| 26183.0 | 11 |
| 26189.0 | 10 |
| 26203.0 | 11 |
| 26209.0 | 10 |
| 26227.0 | 11 |
| 26237.0 | 10 |
| 26249.0 | 9 |
| 26251.0 | 10 |
| 26261.0 | 9 |
| 26263.0 | 10 |
| 26267.0 | 11 |
| 26293.0 | 10 |
| 26297.0 | 9 |
| 26309.0 | 8 |
| 26317.0 | 7 |
| 26321.0 | 6 |
| 26339.0 | 7 |
| 26347.0 | 8 |
| 26357.0 | 7 |
| 26371.0 | 8 |
| 26387.0 | 9 |
| 26393.0 | 8 |
| 26399.0 | 9 |
| 26407.0 | 10 |
| 26417.0 | 9 |
| 26423.0 | 10 |
| 26431.0 | 11 |
| 26437.0 | 10 |
| 26449.0 | 9 |
| 26459.0 | 10 |
| 26479.0 | 11 |
| 26489.0 | 10 |
| 26497.0 | 9 |
| 26501.0 | 8 |
| 26513.0 | 7 |
| 26539.0 | 8 |
| 26557.0 | 7 |
| 26561.0 | 6 |
| 26573.0 | 5 |
| 26591.0 | 6 |
| 26597.0 | 5 |
| 26627.0 | 6 |
| 26633.0 | 5 |
| 26641.0 | 4 |
| 26647.0 | 5 |
| 26669.0 | 4 |
| 26681.0 | 3 |
| 26683.0 | 4 |
| 26687.0 | 5 |
| 26693.0 | 4 |
| 26699.0 | 5 |
| 26701.0 | 4 |
| 26711.0 | 5 |
| 26713.0 | 4 |
| 26717.0 | 3 |
| 26723.0 | 4 |
| 26729.0 | 3 |
| 26731.0 | 4 |
| 26737.0 | 3 |
| 26759.0 | 4 |
| 26777.0 | 3 |
| 26783.0 | 4 |
| 26801.0 | 3 |
| 26813.0 | 2 |
| 26821.0 | 1 |
| 26833.0 | 0 |
| 26839.0 | 1 |
| 26849.0 | 0 |
| 26861.0 | -1 |
| 26863.0 | 0 |
| 26879.0 | 1 |
| 26881.0 | 0 |
| 26891.0 | 1 |
| 26893.0 | 0 |
| 26903.0 | 1 |
| 26921.0 | 0 |
| 26927.0 | 1 |
| 26947.0 | 2 |
| 26951.0 | 3 |
| 26953.0 | 2 |
| 26959.0 | 3 |
| 26981.0 | 2 |
| 26987.0 | 3 |
| 26993.0 | 2 |
| 27011.0 | 3 |
| 27017.0 | 2 |
| 27031.0 | 3 |
| 27043.0 | 4 |
| 27059.0 | 5 |
| 27061.0 | 4 |
| 27067.0 | 5 |
| 27073.0 | 4 |
| 27077.0 | 3 |
| 27091.0 | 4 |
| 27103.0 | 5 |
| 27107.0 | 6 |
| 27109.0 | 5 |
| 27127.0 | 6 |
| 27143.0 | 7 |
| 27179.0 | 8 |
| 27191.0 | 9 |
| 27197.0 | 8 |
| 27211.0 | 9 |
| 27239.0 | 10 |
| 27241.0 | 9 |
| 27253.0 | 8 |
| 27259.0 | 9 |
| 27271.0 | 10 |
| 27277.0 | 9 |
| 27281.0 | 8 |
| 27283.0 | 9 |
| 27299.0 | 10 |
| 27329.0 | 9 |
| 27337.0 | 8 |
| 27361.0 | 7 |
| 27367.0 | 8 |
| 27397.0 | 7 |
| 27407.0 | 8 |
| 27409.0 | 7 |
| 27427.0 | 8 |
| 27431.0 | 9 |
| 27437.0 | 8 |
| 27449.0 | 7 |
| 27457.0 | 6 |
| 27479.0 | 7 |
| 27481.0 | 6 |
| 27487.0 | 7 |
| 27509.0 | 6 |
| 27527.0 | 7 |
| 27529.0 | 6 |
| 27539.0 | 7 |
| 27541.0 | 6 |
| 27551.0 | 7 |
| 27581.0 | 6 |
| 27583.0 | 7 |
| 27611.0 | 8 |
| 27617.0 | 7 |
| 27631.0 | 8 |
| 27647.0 | 9 |
| 27653.0 | 8 |
| 27673.0 | 7 |
| 27689.0 | 6 |
| 27691.0 | 7 |
| 27697.0 | 6 |
| 27701.0 | 5 |
| 27733.0 | 4 |
| 27737.0 | 3 |
| 27739.0 | 4 |
| 27743.0 | 5 |
| 27749.0 | 4 |
| 27751.0 | 5 |
| 27763.0 | 6 |
| 27767.0 | 7 |
| 27773.0 | 6 |
| 27779.0 | 7 |
| 27791.0 | 8 |
| 27793.0 | 7 |
| 27799.0 | 8 |
| 27803.0 | 9 |
| 27809.0 | 8 |
| 27817.0 | 7 |
| 27823.0 | 8 |
| 27827.0 | 9 |
| 27847.0 | 10 |
| 27851.0 | 11 |
| 27883.0 | 12 |
| 27893.0 | 11 |
| 27901.0 | 10 |
| 27917.0 | 9 |
| 27919.0 | 10 |
| 27941.0 | 9 |
| 27943.0 | 10 |
| 27947.0 | 11 |
| 27953.0 | 10 |
| 27961.0 | 9 |
| 27967.0 | 10 |
| 27983.0 | 11 |
| 27997.0 | 10 |
| 28001.0 | 9 |
| 28019.0 | 10 |
| 28027.0 | 11 |
| 28031.0 | 12 |
| 28051.0 | 13 |
| 28057.0 | 12 |
| 28069.0 | 11 |
| 28081.0 | 10 |
| 28087.0 | 11 |
| 28097.0 | 10 |
| 28099.0 | 11 |
| 28109.0 | 10 |
| 28111.0 | 11 |
| 28123.0 | 12 |
| 28151.0 | 13 |
| 28163.0 | 14 |
| 28181.0 | 13 |
| 28183.0 | 14 |
| 28201.0 | 13 |
| 28211.0 | 14 |
| 28219.0 | 15 |
| 28229.0 | 14 |
| 28277.0 | 13 |
| 28279.0 | 14 |
| 28283.0 | 15 |
| 28289.0 | 14 |
| 28297.0 | 13 |
| 28307.0 | 14 |
| 28309.0 | 13 |
| 28319.0 | 14 |
| 28349.0 | 13 |
| 28351.0 | 14 |
| 28387.0 | 15 |
| 28393.0 | 14 |
| 28403.0 | 15 |
| 28409.0 | 14 |
| 28411.0 | 15 |
| 28429.0 | 14 |
| 28433.0 | 13 |
| 28439.0 | 14 |
| 28447.0 | 15 |
| 28463.0 | 16 |
| 28477.0 | 15 |
| 28493.0 | 14 |
| 28499.0 | 15 |
| 28513.0 | 14 |
| 28517.0 | 13 |
| 28537.0 | 12 |
| 28541.0 | 11 |
| 28547.0 | 12 |
| 28549.0 | 11 |
| 28559.0 | 12 |
| 28571.0 | 13 |
| 28573.0 | 12 |
| 28579.0 | 13 |
| 28591.0 | 14 |
| 28597.0 | 13 |
| 28603.0 | 14 |
| 28607.0 | 15 |
| 28619.0 | 16 |
| 28621.0 | 15 |
| 28627.0 | 16 |
| 28631.0 | 17 |
| 28643.0 | 18 |
| 28649.0 | 17 |
| 28657.0 | 16 |
| 28661.0 | 15 |
| 28663.0 | 16 |
| 28669.0 | 15 |
| 28687.0 | 16 |
| 28697.0 | 15 |
| 28703.0 | 16 |
| 28711.0 | 17 |
| 28723.0 | 18 |
| 28729.0 | 17 |
| 28751.0 | 18 |
| 28753.0 | 17 |
| 28759.0 | 18 |
| 28771.0 | 19 |
| 28789.0 | 18 |
| 28793.0 | 17 |
| 28807.0 | 18 |
| 28813.0 | 17 |
| 28817.0 | 16 |
| 28837.0 | 15 |
| 28843.0 | 16 |
| 28859.0 | 17 |
| 28867.0 | 18 |
| 28871.0 | 19 |
| 28879.0 | 20 |
| 28901.0 | 19 |
| 28909.0 | 18 |
| 28921.0 | 17 |
| 28927.0 | 18 |
| 28933.0 | 17 |
| 28949.0 | 16 |
| 28961.0 | 15 |
| 28979.0 | 16 |
| 29009.0 | 15 |
| 29017.0 | 14 |
| 29021.0 | 13 |
| 29023.0 | 14 |
| 29027.0 | 15 |
| 29033.0 | 14 |
| 29059.0 | 15 |
| 29063.0 | 16 |
| 29077.0 | 15 |
| 29101.0 | 14 |
| 29123.0 | 15 |
| 29129.0 | 14 |
| 29131.0 | 15 |
| 29137.0 | 14 |
| 29147.0 | 15 |
| 29153.0 | 14 |
| 29167.0 | 15 |
| 29173.0 | 14 |
| 29179.0 | 15 |
| 29191.0 | 16 |
| 29201.0 | 15 |
| 29207.0 | 16 |
| 29209.0 | 15 |
| 29221.0 | 14 |
| 29231.0 | 15 |
| 29243.0 | 16 |
| 29251.0 | 17 |
| 29269.0 | 16 |
| 29287.0 | 17 |
| 29297.0 | 16 |
| 29303.0 | 17 |
| 29311.0 | 18 |
| 29327.0 | 19 |
| 29333.0 | 18 |
| 29339.0 | 19 |
| 29347.0 | 20 |
| 29363.0 | 21 |
| 29383.0 | 22 |
| 29387.0 | 23 |
| 29389.0 | 22 |
| 29399.0 | 23 |
| 29401.0 | 22 |
| 29411.0 | 23 |
| 29423.0 | 24 |
| 29429.0 | 23 |
| 29437.0 | 22 |
| 29443.0 | 23 |
| 29453.0 | 22 |
| 29473.0 | 21 |
| 29483.0 | 22 |
| 29501.0 | 21 |
| 29527.0 | 22 |
| 29531.0 | 23 |
| 29537.0 | 22 |
| 29567.0 | 23 |
| 29569.0 | 22 |
| 29573.0 | 21 |
| 29581.0 | 20 |
| 29587.0 | 21 |
| 29599.0 | 22 |
| 29611.0 | 23 |
| 29629.0 | 22 |
| 29633.0 | 21 |
| 29641.0 | 20 |
| 29663.0 | 21 |
| 29669.0 | 20 |
| 29671.0 | 21 |
| 29683.0 | 22 |
| 29717.0 | 21 |
| 29723.0 | 22 |
| 29741.0 | 21 |
| 29753.0 | 20 |
| 29759.0 | 21 |
| 29761.0 | 20 |
| 29789.0 | 19 |
| 29803.0 | 20 |
| 29819.0 | 21 |
| 29833.0 | 20 |
| 29837.0 | 19 |
| 29851.0 | 20 |
| 29863.0 | 21 |
| 29867.0 | 22 |
| 29873.0 | 21 |
| 29879.0 | 22 |
| 29881.0 | 21 |
| 29917.0 | 20 |
| 29921.0 | 19 |
| 29927.0 | 20 |
| 29947.0 | 21 |
| 29959.0 | 22 |
| 29983.0 | 23 |
| 29989.0 | 22 |
| 30011.0 | 23 |
| 30013.0 | 22 |
| 30029.0 | 21 |
| 30047.0 | 22 |
| 30059.0 | 23 |
| 30071.0 | 24 |
| 30089.0 | 23 |
| 30091.0 | 24 |
| 30097.0 | 23 |
| 30103.0 | 24 |
| 30109.0 | 23 |
| 30113.0 | 22 |
| 30119.0 | 23 |
| 30133.0 | 22 |
| 30137.0 | 21 |
| 30139.0 | 22 |
| 30161.0 | 21 |
| 30169.0 | 20 |
| 30181.0 | 19 |
| 30187.0 | 20 |
| 30197.0 | 19 |
| 30203.0 | 20 |
| 30211.0 | 21 |
| 30223.0 | 22 |
| 30241.0 | 21 |
| 30253.0 | 20 |
| 30259.0 | 21 |
| 30269.0 | 20 |
| 30271.0 | 21 |
| 30293.0 | 20 |
| 30307.0 | 21 |
| 30313.0 | 20 |
| 30319.0 | 21 |
| 30323.0 | 22 |
| 30341.0 | 21 |
| 30347.0 | 22 |
| 30367.0 | 23 |
| 30389.0 | 22 |
| 30391.0 | 23 |
| 30403.0 | 24 |
| 30427.0 | 25 |
| 30431.0 | 26 |
| 30449.0 | 25 |
| 30467.0 | 26 |
| 30469.0 | 25 |
| 30491.0 | 26 |
| 30493.0 | 25 |
| 30497.0 | 24 |
| 30509.0 | 23 |
| 30517.0 | 22 |
| 30529.0 | 21 |
| 30539.0 | 22 |
| 30553.0 | 21 |
| 30557.0 | 20 |
| 30559.0 | 21 |
| 30577.0 | 20 |
| 30593.0 | 19 |
| 30631.0 | 20 |
| 30637.0 | 19 |
| 30643.0 | 20 |
| 30649.0 | 19 |
| 30661.0 | 18 |
| 30671.0 | 19 |
| 30677.0 | 18 |
| 30689.0 | 17 |
| 30697.0 | 16 |
| 30703.0 | 17 |
| 30707.0 | 18 |
| 30713.0 | 17 |
| 30727.0 | 18 |
| 30757.0 | 17 |
| 30763.0 | 18 |
| 30773.0 | 17 |
| 30781.0 | 16 |
| 30803.0 | 17 |
| 30809.0 | 16 |
| 30817.0 | 15 |
| 30829.0 | 14 |
| 30839.0 | 15 |
| 30841.0 | 14 |
| 30851.0 | 15 |
| 30853.0 | 14 |
| 30859.0 | 15 |
| 30869.0 | 14 |
| 30871.0 | 15 |
| 30881.0 | 14 |
| 30893.0 | 13 |
| 30911.0 | 14 |
| 30931.0 | 15 |
| 30937.0 | 14 |
| 30941.0 | 13 |
| 30949.0 | 12 |
| 30971.0 | 13 |
| 30977.0 | 12 |
| 30983.0 | 13 |
| 31013.0 | 12 |
| 31019.0 | 13 |
| 31033.0 | 12 |
| 31039.0 | 13 |
| 31051.0 | 14 |
| 31063.0 | 15 |
| 31069.0 | 14 |
| 31079.0 | 15 |
| 31081.0 | 14 |
| 31091.0 | 15 |
| 31121.0 | 14 |
| 31123.0 | 15 |
| 31139.0 | 16 |
| 31147.0 | 17 |
| 31151.0 | 18 |
| 31153.0 | 17 |
| 31159.0 | 18 |
| 31177.0 | 17 |
| 31181.0 | 16 |
| 31183.0 | 17 |
| 31189.0 | 16 |
| 31193.0 | 15 |
| 31219.0 | 16 |
| 31223.0 | 17 |
| 31231.0 | 18 |
| 31237.0 | 17 |
| 31247.0 | 18 |
| 31249.0 | 17 |
| 31253.0 | 16 |
| 31259.0 | 17 |
| 31267.0 | 18 |
| 31271.0 | 19 |
| 31277.0 | 18 |
| 31307.0 | 19 |
| 31319.0 | 20 |
| 31321.0 | 19 |
| 31327.0 | 20 |
| 31333.0 | 19 |
| 31337.0 | 18 |
| 31357.0 | 17 |
| 31379.0 | 18 |
| 31387.0 | 19 |
| 31391.0 | 20 |
| 31393.0 | 19 |
| 31397.0 | 18 |
| 31469.0 | 17 |
| 31477.0 | 16 |
| 31481.0 | 15 |
| 31489.0 | 14 |
| 31511.0 | 15 |
| 31513.0 | 14 |
| 31517.0 | 13 |
| 31531.0 | 14 |
| 31541.0 | 13 |
| 31543.0 | 14 |
| 31547.0 | 15 |
| 31567.0 | 16 |
| 31573.0 | 15 |
| 31583.0 | 16 |
| 31601.0 | 15 |
| 31607.0 | 16 |
| 31627.0 | 17 |
| 31643.0 | 18 |
| 31649.0 | 17 |
| 31657.0 | 16 |
| 31663.0 | 17 |
| 31667.0 | 18 |
| 31687.0 | 19 |
| 31699.0 | 20 |
| 31721.0 | 19 |
| 31723.0 | 20 |
| 31727.0 | 21 |
| 31729.0 | 20 |
| 31741.0 | 19 |
| 31751.0 | 20 |
| 31769.0 | 19 |
| 31771.0 | 20 |
| 31793.0 | 19 |
| 31799.0 | 20 |
| 31817.0 | 19 |
| 31847.0 | 20 |
| 31849.0 | 19 |
| 31859.0 | 20 |
| 31873.0 | 19 |
| 31883.0 | 20 |
| 31891.0 | 21 |
| 31907.0 | 22 |
| 31957.0 | 21 |
| 31963.0 | 22 |
| 31973.0 | 21 |
| 31981.0 | 20 |
| 31991.0 | 21 |
| 32003.0 | 22 |
| 32009.0 | 21 |
| 32027.0 | 22 |
| 32029.0 | 21 |
| 32051.0 | 22 |
| 32057.0 | 21 |
| 32059.0 | 22 |
| 32063.0 | 23 |
| 32069.0 | 22 |
| 32077.0 | 21 |
| 32083.0 | 22 |
| 32089.0 | 21 |
| 32099.0 | 22 |
| 32117.0 | 21 |
| 32119.0 | 22 |
| 32141.0 | 21 |
| 32143.0 | 22 |
| 32159.0 | 23 |
| 32173.0 | 22 |
| 32183.0 | 23 |
| 32189.0 | 22 |
| 32191.0 | 23 |
| 32203.0 | 24 |
| 32213.0 | 23 |
| 32233.0 | 22 |
| 32237.0 | 21 |
| 32251.0 | 22 |
| 32257.0 | 21 |
| 32261.0 | 20 |
| 32297.0 | 19 |
| 32299.0 | 20 |
| 32303.0 | 21 |
| 32309.0 | 20 |
| 32321.0 | 19 |
| 32323.0 | 20 |
| 32327.0 | 21 |
| 32341.0 | 20 |
| 32353.0 | 19 |
| 32359.0 | 20 |
| 32363.0 | 21 |
| 32369.0 | 20 |
| 32371.0 | 21 |
| 32377.0 | 20 |
| 32381.0 | 19 |
| 32401.0 | 18 |
| 32411.0 | 19 |
| 32413.0 | 18 |
| 32423.0 | 19 |
| 32429.0 | 18 |
| 32441.0 | 17 |
| 32443.0 | 18 |
| 32467.0 | 19 |
| 32479.0 | 20 |
| 32491.0 | 21 |
| 32497.0 | 20 |
| 32503.0 | 21 |
| 32507.0 | 22 |
| 32531.0 | 23 |
| 32533.0 | 22 |
| 32537.0 | 21 |
| 32561.0 | 20 |
| 32563.0 | 21 |
| 32569.0 | 20 |
| 32573.0 | 19 |
| 32579.0 | 20 |
| 32587.0 | 21 |
| 32603.0 | 22 |
| 32609.0 | 21 |
| 32611.0 | 22 |
| 32621.0 | 21 |
| 32633.0 | 20 |
| 32647.0 | 21 |
| 32653.0 | 20 |
| 32687.0 | 21 |
| 32693.0 | 20 |
| 32707.0 | 21 |
| 32713.0 | 20 |
| 32717.0 | 19 |
| 32719.0 | 20 |
| 32749.0 | 19 |
| 32771.0 | 20 |
| 32779.0 | 21 |
| 32783.0 | 22 |
| 32789.0 | 21 |
| 32797.0 | 20 |
| 32801.0 | 19 |
| 32803.0 | 20 |
| 32831.0 | 21 |
| 32833.0 | 20 |
| 32839.0 | 21 |
| 32843.0 | 22 |
| 32869.0 | 21 |
| 32887.0 | 22 |
| 32909.0 | 21 |
| 32911.0 | 22 |
| 32917.0 | 21 |
| 32933.0 | 20 |
| 32939.0 | 21 |
| 32941.0 | 20 |
| 32957.0 | 19 |
| 32969.0 | 18 |
| 32971.0 | 19 |
| 32983.0 | 20 |
| 32987.0 | 21 |
| 32993.0 | 20 |
| 32999.0 | 21 |
| 33013.0 | 20 |
| 33023.0 | 21 |
| 33029.0 | 20 |
| 33037.0 | 19 |
| 33049.0 | 18 |
| 33053.0 | 17 |
| 33071.0 | 18 |
| 33073.0 | 17 |
| 33083.0 | 18 |
| 33091.0 | 19 |
| 33107.0 | 20 |
| 33113.0 | 19 |
| 33119.0 | 20 |
| 33149.0 | 19 |
| 33151.0 | 20 |
| 33161.0 | 19 |
| 33179.0 | 20 |
| 33181.0 | 19 |
| 33191.0 | 20 |
| 33199.0 | 21 |
| 33203.0 | 22 |
| 33211.0 | 23 |
| 33223.0 | 24 |
| 33247.0 | 25 |
| 33287.0 | 26 |
| 33289.0 | 25 |
| 33301.0 | 24 |
| 33311.0 | 25 |
| 33317.0 | 24 |
| 33329.0 | 23 |
| 33331.0 | 24 |
| 33343.0 | 25 |
| 33347.0 | 26 |
| 33349.0 | 25 |
| 33353.0 | 24 |
| 33359.0 | 25 |
| 33377.0 | 24 |
| 33391.0 | 25 |
| 33403.0 | 26 |
| 33409.0 | 25 |
| 33413.0 | 24 |
| 33427.0 | 25 |
| 33457.0 | 24 |
| 33461.0 | 23 |
| 33469.0 | 22 |
| 33479.0 | 23 |
| 33487.0 | 24 |
| 33493.0 | 23 |
| 33503.0 | 24 |
| 33521.0 | 23 |
| 33529.0 | 22 |
| 33533.0 | 21 |
| 33547.0 | 22 |
| 33563.0 | 23 |
| 33569.0 | 22 |
| 33577.0 | 21 |
| 33581.0 | 20 |
| 33587.0 | 21 |
| 33589.0 | 20 |
| 33599.0 | 21 |
| 33601.0 | 20 |
| 33613.0 | 19 |
| 33617.0 | 18 |
| 33619.0 | 19 |
| 33623.0 | 20 |
| 33629.0 | 19 |
| 33637.0 | 18 |
| 33641.0 | 17 |
| 33647.0 | 18 |
| 33679.0 | 19 |
| 33703.0 | 20 |
| 33713.0 | 19 |
| 33721.0 | 18 |
| 33739.0 | 19 |
| 33749.0 | 18 |
| 33751.0 | 19 |
| 33757.0 | 18 |
| 33767.0 | 19 |
| 33769.0 | 18 |
| 33773.0 | 17 |
| 33791.0 | 18 |
| 33797.0 | 17 |
| 33809.0 | 16 |
| 33811.0 | 17 |
| 33827.0 | 18 |
| 33829.0 | 17 |
| 33851.0 | 18 |
| 33857.0 | 17 |
| 33863.0 | 18 |
| 33871.0 | 19 |
| 33889.0 | 18 |
| 33893.0 | 17 |
| 33911.0 | 18 |
| 33923.0 | 19 |
| 33931.0 | 20 |
| 33937.0 | 19 |
| 33941.0 | 18 |
| 33961.0 | 17 |
| 33967.0 | 18 |
| 33997.0 | 17 |
| 34019.0 | 18 |
| 34031.0 | 19 |
| 34033.0 | 18 |
| 34039.0 | 19 |
| 34057.0 | 18 |
| 34061.0 | 17 |
| 34123.0 | 18 |
| 34127.0 | 19 |
| 34129.0 | 18 |
| 34141.0 | 17 |
| 34147.0 | 18 |
| 34157.0 | 17 |
| 34159.0 | 18 |
| 34171.0 | 19 |
| 34183.0 | 20 |
| 34211.0 | 21 |
| 34213.0 | 20 |
| 34217.0 | 19 |
| 34231.0 | 20 |
| 34253.0 | 19 |
| 34259.0 | 20 |
| 34261.0 | 19 |
| 34267.0 | 20 |
| 34273.0 | 19 |
| 34283.0 | 20 |
| 34297.0 | 19 |
| 34301.0 | 18 |
| 34303.0 | 19 |
| 34313.0 | 18 |
| 34319.0 | 19 |
| 34327.0 | 20 |
| 34337.0 | 19 |
| 34351.0 | 20 |
| 34361.0 | 19 |
| 34367.0 | 20 |
| 34369.0 | 19 |
| 34381.0 | 18 |
| 34403.0 | 19 |
| 34421.0 | 18 |
| 34429.0 | 17 |
| 34439.0 | 18 |
| 34457.0 | 17 |
| 34469.0 | 16 |
| 34471.0 | 17 |
| 34483.0 | 18 |
| 34487.0 | 19 |
| 34499.0 | 20 |
| 34501.0 | 19 |
| 34511.0 | 20 |
| 34513.0 | 19 |
| 34519.0 | 20 |
| 34537.0 | 19 |
| 34543.0 | 20 |
| 34549.0 | 19 |
| 34583.0 | 20 |
| 34589.0 | 19 |
| 34591.0 | 20 |
| 34603.0 | 21 |
| 34607.0 | 22 |
| 34613.0 | 21 |
| 34631.0 | 22 |
| 34649.0 | 21 |
| 34651.0 | 22 |
| 34667.0 | 23 |
| 34673.0 | 22 |
| 34679.0 | 23 |
| 34687.0 | 24 |
| 34693.0 | 23 |
| 34703.0 | 24 |
| 34721.0 | 23 |
| 34729.0 | 22 |
| 34739.0 | 23 |
| 34747.0 | 24 |
| 34757.0 | 23 |
| 34759.0 | 24 |
| 34763.0 | 25 |
| 34781.0 | 24 |
| 34807.0 | 25 |
| 34819.0 | 26 |
| 34841.0 | 25 |
| 34843.0 | 26 |
| 34847.0 | 27 |
| 34849.0 | 26 |
| 34871.0 | 27 |
| 34877.0 | 26 |
| 34883.0 | 27 |
| 34897.0 | 26 |
| 34913.0 | 25 |
| 34919.0 | 26 |
| 34939.0 | 27 |
| 34949.0 | 26 |
| 34961.0 | 25 |
| 34963.0 | 26 |
| 34981.0 | 25 |
| 35023.0 | 26 |
| 35027.0 | 27 |
| 35051.0 | 28 |
| 35053.0 | 27 |
| 35059.0 | 28 |
| 35069.0 | 27 |
| 35081.0 | 26 |
| 35083.0 | 27 |
| 35089.0 | 26 |
| 35099.0 | 27 |
| 35107.0 | 28 |
| 35111.0 | 29 |
| 35117.0 | 28 |
| 35129.0 | 27 |
| 35141.0 | 26 |
| 35149.0 | 25 |
| 35153.0 | 24 |
| 35159.0 | 25 |
| 35171.0 | 26 |
| 35201.0 | 25 |
| 35221.0 | 24 |
| 35227.0 | 25 |
| 35251.0 | 26 |
| 35257.0 | 25 |
| 35267.0 | 26 |
| 35279.0 | 27 |
| 35281.0 | 26 |
| 35291.0 | 27 |
| 35311.0 | 28 |
| 35317.0 | 27 |
| 35323.0 | 28 |
| 35327.0 | 29 |
| 35339.0 | 30 |
| 35353.0 | 29 |
| 35363.0 | 30 |
| 35381.0 | 29 |
| 35393.0 | 28 |
| 35401.0 | 27 |
| 35407.0 | 28 |
| 35419.0 | 29 |
| 35423.0 | 30 |
| 35437.0 | 29 |
| 35447.0 | 30 |
| 35449.0 | 29 |
| 35461.0 | 28 |
| 35491.0 | 29 |
| 35507.0 | 30 |
| 35509.0 | 29 |
| 35521.0 | 28 |
| 35527.0 | 29 |
| 35531.0 | 30 |
| 35533.0 | 29 |
| 35537.0 | 28 |
| 35543.0 | 29 |
| 35569.0 | 28 |
| 35573.0 | 27 |
| 35591.0 | 28 |
| 35593.0 | 27 |
| 35597.0 | 26 |
| 35603.0 | 27 |
| 35617.0 | 26 |
| 35671.0 | 27 |
| 35677.0 | 26 |
| 35729.0 | 25 |
| 35731.0 | 26 |
| 35747.0 | 27 |
| 35753.0 | 26 |
| 35759.0 | 27 |
| 35771.0 | 28 |
| 35797.0 | 27 |
| 35801.0 | 26 |
| 35803.0 | 27 |
| 35809.0 | 26 |
| 35831.0 | 27 |
| 35837.0 | 26 |
| 35839.0 | 27 |
| 35851.0 | 28 |
| 35863.0 | 29 |
| 35869.0 | 28 |
| 35879.0 | 29 |
| 35897.0 | 28 |
| 35899.0 | 29 |
| 35911.0 | 30 |
| 35923.0 | 31 |
| 35933.0 | 30 |
| 35951.0 | 31 |
| 35963.0 | 32 |
| 35969.0 | 31 |
| 35977.0 | 30 |
| 35983.0 | 31 |
| 35993.0 | 30 |
| 35999.0 | 31 |
| 36007.0 | 32 |
| 36011.0 | 33 |
| 36013.0 | 32 |
| 36017.0 | 31 |
| 36037.0 | 30 |
| 36061.0 | 29 |
| 36067.0 | 30 |
| 36073.0 | 29 |
| 36083.0 | 30 |
| 36097.0 | 29 |
| 36107.0 | 30 |
| 36109.0 | 29 |
| 36131.0 | 30 |
| 36137.0 | 29 |
| 36151.0 | 30 |
| 36161.0 | 29 |
| 36187.0 | 30 |
| 36191.0 | 31 |
| 36209.0 | 30 |
| 36217.0 | 29 |
| 36229.0 | 28 |
| 36241.0 | 27 |
| 36251.0 | 28 |
| 36263.0 | 29 |
| 36269.0 | 28 |
| 36277.0 | 27 |
| 36293.0 | 26 |
| 36299.0 | 27 |
| 36307.0 | 28 |
| 36313.0 | 27 |
| 36319.0 | 28 |
| 36341.0 | 27 |
| 36343.0 | 28 |
| 36353.0 | 27 |
| 36373.0 | 26 |
| 36383.0 | 27 |
| 36389.0 | 26 |
| 36433.0 | 25 |
| 36451.0 | 26 |
| 36457.0 | 25 |
| 36467.0 | 26 |
| 36469.0 | 25 |
| 36473.0 | 24 |
| 36479.0 | 25 |
| 36493.0 | 24 |
| 36497.0 | 23 |
| 36523.0 | 24 |
| 36527.0 | 25 |
| 36529.0 | 24 |
| 36541.0 | 23 |
| 36551.0 | 24 |
| 36559.0 | 25 |
| 36563.0 | 26 |
| 36571.0 | 27 |
| 36583.0 | 28 |
| 36587.0 | 29 |
| 36599.0 | 30 |
| 36607.0 | 31 |
| 36629.0 | 30 |
| 36637.0 | 29 |
| 36643.0 | 30 |
| 36653.0 | 29 |
| 36671.0 | 30 |
| 36677.0 | 29 |
| 36683.0 | 30 |
| 36691.0 | 31 |
| 36697.0 | 30 |
| 36709.0 | 29 |
| 36713.0 | 28 |
| 36721.0 | 27 |
| 36739.0 | 28 |
| 36749.0 | 27 |
| 36761.0 | 26 |
| 36767.0 | 27 |
| 36779.0 | 28 |
| 36781.0 | 27 |
| 36787.0 | 28 |
| 36791.0 | 29 |
| 36793.0 | 28 |
| 36809.0 | 27 |
| 36821.0 | 26 |
| 36833.0 | 25 |
| 36847.0 | 26 |
| 36857.0 | 25 |
| 36871.0 | 26 |
| 36877.0 | 25 |
| 36887.0 | 26 |
| 36899.0 | 27 |
| 36901.0 | 26 |
| 36913.0 | 25 |
| 36919.0 | 26 |
| 36923.0 | 27 |
| 36929.0 | 26 |
| 36931.0 | 27 |
| 36943.0 | 28 |
| 36947.0 | 29 |
| 36973.0 | 28 |
| 36979.0 | 29 |
| 36997.0 | 28 |
| 37003.0 | 29 |
| 37013.0 | 28 |
| 37019.0 | 29 |
| 37021.0 | 28 |
| 37039.0 | 29 |
| 37049.0 | 28 |
| 37057.0 | 27 |
| 37061.0 | 26 |
| 37087.0 | 27 |
| 37097.0 | 26 |
| 37117.0 | 25 |
| 37123.0 | 26 |
| 37139.0 | 27 |
| 37159.0 | 28 |
| 37171.0 | 29 |
| 37181.0 | 28 |
| 37189.0 | 27 |
| 37199.0 | 28 |
| 37201.0 | 27 |
| 37217.0 | 26 |
| 37223.0 | 27 |
| 37243.0 | 28 |
| 37253.0 | 27 |
| 37273.0 | 26 |
| 37277.0 | 25 |
| 37307.0 | 26 |
| 37309.0 | 25 |
| 37313.0 | 24 |
| 37321.0 | 23 |
| 37337.0 | 22 |
| 37339.0 | 23 |
| 37357.0 | 22 |
| 37361.0 | 21 |
| 37363.0 | 22 |
| 37369.0 | 21 |
| 37379.0 | 22 |
| 37397.0 | 21 |
| 37409.0 | 20 |
| 37423.0 | 21 |
| 37441.0 | 20 |
| 37447.0 | 21 |
| 37463.0 | 22 |
| 37483.0 | 23 |
| 37489.0 | 22 |
| 37493.0 | 21 |
| 37501.0 | 20 |
| 37507.0 | 21 |
| 37511.0 | 22 |
| 37517.0 | 21 |
| 37529.0 | 20 |
| 37537.0 | 19 |
| 37547.0 | 20 |
| 37549.0 | 19 |
| 37561.0 | 18 |
| 37567.0 | 19 |
| 37571.0 | 20 |
| 37573.0 | 19 |
| 37579.0 | 20 |
| 37589.0 | 19 |
| 37591.0 | 20 |
| 37607.0 | 21 |
| 37619.0 | 22 |
| 37633.0 | 21 |
| 37643.0 | 22 |
| 37649.0 | 21 |
| 37657.0 | 20 |
| 37663.0 | 21 |
| 37691.0 | 22 |
| 37693.0 | 21 |
| 37699.0 | 22 |
| 37717.0 | 21 |
| 37747.0 | 22 |
| 37781.0 | 21 |
| 37783.0 | 22 |
| 37799.0 | 23 |
| 37811.0 | 24 |
| 37813.0 | 23 |
| 37831.0 | 24 |
| 37847.0 | 25 |
| 37853.0 | 24 |
| 37861.0 | 23 |
| 37871.0 | 24 |
| 37879.0 | 25 |
| 37889.0 | 24 |
| 37897.0 | 23 |
| 37907.0 | 24 |
| 37951.0 | 25 |
| 37957.0 | 24 |
| 37963.0 | 25 |
| 37967.0 | 26 |
| 37987.0 | 27 |
| 37991.0 | 28 |
| 37993.0 | 27 |
| 37997.0 | 26 |
| 38011.0 | 27 |
| 38039.0 | 28 |
| 38047.0 | 29 |
| 38053.0 | 28 |
| 38069.0 | 27 |
| 38083.0 | 28 |
| 38113.0 | 27 |
| 38119.0 | 28 |
| 38149.0 | 27 |
| 38153.0 | 26 |
| 38167.0 | 27 |
| 38177.0 | 26 |
| 38183.0 | 27 |
| 38189.0 | 26 |
| 38197.0 | 25 |
| 38201.0 | 24 |
| 38219.0 | 25 |
| 38231.0 | 26 |
| 38237.0 | 25 |
| 38239.0 | 26 |
| 38261.0 | 25 |
| 38273.0 | 24 |
| 38281.0 | 23 |
| 38287.0 | 24 |
| 38299.0 | 25 |
| 38303.0 | 26 |
| 38317.0 | 25 |
| 38321.0 | 24 |
| 38327.0 | 25 |
| 38329.0 | 24 |
| 38333.0 | 23 |
| 38351.0 | 24 |
| 38371.0 | 25 |
| 38377.0 | 24 |
| 38393.0 | 23 |
| 38431.0 | 24 |
| 38447.0 | 25 |
| 38449.0 | 24 |
| 38453.0 | 23 |
| 38459.0 | 24 |
| 38461.0 | 23 |
| 38501.0 | 22 |
| 38543.0 | 23 |
| 38557.0 | 22 |
| 38561.0 | 21 |
| 38567.0 | 22 |
| 38569.0 | 21 |
| 38593.0 | 20 |
| 38603.0 | 21 |
| 38609.0 | 20 |
| 38611.0 | 21 |
| 38629.0 | 20 |
| 38639.0 | 21 |
| 38651.0 | 22 |
| 38653.0 | 21 |
| 38669.0 | 20 |
| 38671.0 | 21 |
| 38677.0 | 20 |
| 38693.0 | 19 |
| 38699.0 | 20 |
| 38707.0 | 21 |
| 38711.0 | 22 |
| 38713.0 | 21 |
| 38723.0 | 22 |
| 38729.0 | 21 |
| 38737.0 | 20 |
| 38747.0 | 21 |
| 38749.0 | 20 |
| 38767.0 | 21 |
| 38783.0 | 22 |
| 38791.0 | 23 |
| 38803.0 | 24 |
| 38821.0 | 23 |
| 38833.0 | 22 |
| 38839.0 | 23 |
| 38851.0 | 24 |
| 38861.0 | 23 |
| 38867.0 | 24 |
| 38873.0 | 23 |
| 38891.0 | 24 |
| 38903.0 | 25 |
| 38917.0 | 24 |
| 38921.0 | 23 |
| 38923.0 | 24 |
| 38933.0 | 23 |
| 38953.0 | 22 |
| 38959.0 | 23 |
| 38971.0 | 24 |
| 38977.0 | 23 |
| 38993.0 | 22 |
| 39019.0 | 23 |
| 39023.0 | 24 |
| 39041.0 | 23 |
| 39043.0 | 24 |
| 39047.0 | 25 |
| 39079.0 | 26 |
| 39089.0 | 25 |
| 39097.0 | 24 |
| 39103.0 | 25 |
| 39107.0 | 26 |
| 39113.0 | 25 |
| 39119.0 | 26 |
| 39133.0 | 25 |
| 39139.0 | 26 |
| 39157.0 | 25 |
| 39161.0 | 24 |
| 39163.0 | 25 |
| 39181.0 | 24 |
| 39191.0 | 25 |
| 39199.0 | 26 |
| 39209.0 | 25 |
| 39217.0 | 24 |
| 39227.0 | 25 |
| 39229.0 | 24 |
| 39233.0 | 23 |
| 39239.0 | 24 |
| 39241.0 | 23 |
| 39251.0 | 24 |
| 39293.0 | 23 |
| 39301.0 | 22 |
| 39313.0 | 21 |
| 39317.0 | 20 |
| 39323.0 | 21 |
| 39341.0 | 20 |
| 39343.0 | 21 |
| 39359.0 | 22 |
| 39367.0 | 23 |
| 39371.0 | 24 |
| 39373.0 | 23 |
| 39383.0 | 24 |
| 39397.0 | 23 |
| 39409.0 | 22 |
| 39419.0 | 23 |
| 39439.0 | 24 |
| 39443.0 | 25 |
| 39451.0 | 26 |
| 39461.0 | 25 |
| 39499.0 | 26 |
| 39503.0 | 27 |
| 39509.0 | 26 |
| 39511.0 | 27 |
| 39521.0 | 26 |
| 39541.0 | 25 |
| 39551.0 | 26 |
| 39563.0 | 27 |
| 39569.0 | 26 |
| 39581.0 | 25 |
| 39607.0 | 26 |
| 39619.0 | 27 |
| 39623.0 | 28 |
| 39631.0 | 29 |
| 39659.0 | 30 |
| 39667.0 | 31 |
| 39671.0 | 32 |
| 39679.0 | 33 |
| 39703.0 | 34 |
| 39709.0 | 33 |
| 39719.0 | 34 |
| 39727.0 | 35 |
| 39733.0 | 34 |
| 39749.0 | 33 |
| 39761.0 | 32 |
| 39769.0 | 31 |
| 39779.0 | 32 |
| 39791.0 | 33 |
| 39799.0 | 34 |
| 39821.0 | 33 |
| 39827.0 | 34 |
| 39829.0 | 33 |
| 39839.0 | 34 |
| 39841.0 | 33 |
| 39847.0 | 34 |
| 39857.0 | 33 |
| 39863.0 | 34 |
| 39869.0 | 33 |
| 39877.0 | 32 |
| 39883.0 | 33 |
| 39887.0 | 34 |
| 39901.0 | 33 |
| 39929.0 | 32 |
| 39937.0 | 31 |
| 39953.0 | 30 |
| 39971.0 | 31 |
| 39979.0 | 32 |
| 39983.0 | 33 |
| 39989.0 | 32 |
| 40009.0 | 31 |
| 40013.0 | 30 |
| 40031.0 | 31 |
| 40037.0 | 30 |
| 40039.0 | 31 |
| 40063.0 | 32 |
| 40087.0 | 33 |
| 40093.0 | 32 |
| 40099.0 | 33 |
| 40111.0 | 34 |
| 40123.0 | 35 |
| 40127.0 | 36 |
| 40129.0 | 35 |
| 40151.0 | 36 |
| 40153.0 | 35 |
| 40163.0 | 36 |
| 40169.0 | 35 |
| 40177.0 | 34 |
| 40189.0 | 33 |
| 40193.0 | 32 |
| 40213.0 | 31 |
| 40231.0 | 32 |
| 40237.0 | 31 |
| 40241.0 | 30 |
| 40253.0 | 29 |
| 40277.0 | 28 |
| 40283.0 | 29 |
| 40289.0 | 28 |
| 40343.0 | 29 |
| 40351.0 | 30 |
| 40357.0 | 29 |
| 40361.0 | 28 |
| 40387.0 | 29 |
| 40423.0 | 30 |
| 40427.0 | 31 |
| 40429.0 | 30 |
| 40433.0 | 29 |
| 40459.0 | 30 |
| 40471.0 | 31 |
| 40483.0 | 32 |
| 40487.0 | 33 |
| 40493.0 | 32 |
| 40499.0 | 33 |
| 40507.0 | 34 |
| 40519.0 | 35 |
| 40529.0 | 34 |
| 40531.0 | 35 |
| 40543.0 | 36 |
| 40559.0 | 37 |
| 40577.0 | 36 |
| 40583.0 | 37 |
| 40591.0 | 38 |
| 40597.0 | 37 |
| 40609.0 | 36 |
| 40627.0 | 37 |
| 40637.0 | 36 |
| 40639.0 | 37 |
| 40693.0 | 36 |
| 40697.0 | 35 |
| 40699.0 | 36 |
| 40709.0 | 35 |
| 40739.0 | 36 |
| 40751.0 | 37 |
| 40759.0 | 38 |
| 40763.0 | 39 |
| 40771.0 | 40 |
| 40787.0 | 41 |
| 40801.0 | 40 |
| 40813.0 | 39 |
| 40819.0 | 40 |
| 40823.0 | 41 |
| 40829.0 | 40 |
| 40841.0 | 39 |
| 40847.0 | 40 |
| 40849.0 | 39 |
| 40853.0 | 38 |
| 40867.0 | 39 |
| 40879.0 | 40 |
| 40883.0 | 41 |
| 40897.0 | 40 |
| 40903.0 | 41 |
| 40927.0 | 42 |
| 40933.0 | 41 |
| 40939.0 | 42 |
| 40949.0 | 41 |
| 40961.0 | 40 |
| 40973.0 | 39 |
| 40993.0 | 38 |
| 41011.0 | 39 |
| 41017.0 | 38 |
| 41023.0 | 39 |
| 41039.0 | 40 |
| 41047.0 | 41 |
| 41051.0 | 42 |
| 41057.0 | 41 |
| 41077.0 | 40 |
| 41081.0 | 39 |
| 41113.0 | 38 |
| 41117.0 | 37 |
| 41131.0 | 38 |
| 41141.0 | 37 |
| 41143.0 | 38 |
| 41149.0 | 37 |
| 41161.0 | 36 |
| 41177.0 | 35 |
| 41179.0 | 36 |
| 41183.0 | 37 |
| 41189.0 | 36 |
| 41201.0 | 35 |
| 41203.0 | 36 |
| 41213.0 | 35 |
| 41221.0 | 34 |
| 41227.0 | 35 |
| 41231.0 | 36 |
| 41233.0 | 35 |
| 41243.0 | 36 |
| 41257.0 | 35 |
| 41263.0 | 36 |
| 41269.0 | 35 |
| 41281.0 | 34 |
| 41299.0 | 35 |
| 41333.0 | 34 |
| 41341.0 | 33 |
| 41351.0 | 34 |
| 41357.0 | 33 |
| 41381.0 | 32 |
| 41387.0 | 33 |
| 41389.0 | 32 |
| 41399.0 | 33 |
| 41411.0 | 34 |
| 41413.0 | 33 |
| 41443.0 | 34 |
| 41453.0 | 33 |
| 41467.0 | 34 |
| 41479.0 | 35 |
| 41491.0 | 36 |
| 41507.0 | 37 |
| 41513.0 | 36 |
| 41519.0 | 37 |
| 41521.0 | 36 |
| 41539.0 | 37 |
| 41543.0 | 38 |
| 41549.0 | 37 |
| 41579.0 | 38 |
| 41593.0 | 37 |
| 41597.0 | 36 |
| 41603.0 | 37 |
| 41609.0 | 36 |
| 41611.0 | 37 |
| 41617.0 | 36 |
| 41621.0 | 35 |
| 41627.0 | 36 |
| 41641.0 | 35 |
| 41647.0 | 36 |
| 41651.0 | 37 |
| 41659.0 | 38 |
| 41669.0 | 37 |
| 41681.0 | 36 |
| 41687.0 | 37 |
| 41719.0 | 38 |
| 41729.0 | 37 |
| 41737.0 | 36 |
| 41759.0 | 37 |
| 41761.0 | 36 |
| 41771.0 | 37 |
| 41777.0 | 36 |
| 41801.0 | 35 |
| 41809.0 | 34 |
| 41813.0 | 33 |
| 41843.0 | 34 |
| 41849.0 | 33 |
| 41851.0 | 34 |
| 41863.0 | 35 |
| 41879.0 | 36 |
| 41887.0 | 37 |
| 41893.0 | 36 |
| 41897.0 | 35 |
| 41903.0 | 36 |
| 41911.0 | 37 |
| 41927.0 | 38 |
| 41941.0 | 37 |
| 41947.0 | 38 |
| 41953.0 | 37 |
| 41957.0 | 36 |
| 41959.0 | 37 |
| 41969.0 | 36 |
| 41981.0 | 35 |
| 41983.0 | 36 |
| 41999.0 | 37 |
| 42013.0 | 36 |
| 42017.0 | 35 |
| 42019.0 | 36 |
| 42023.0 | 37 |
| 42043.0 | 38 |
| 42061.0 | 37 |
| 42071.0 | 38 |
| 42073.0 | 37 |
| 42083.0 | 38 |
| 42089.0 | 37 |
| 42101.0 | 36 |
| 42131.0 | 37 |
| 42139.0 | 38 |
| 42157.0 | 37 |
| 42169.0 | 36 |
| 42179.0 | 37 |
| 42181.0 | 36 |
| 42187.0 | 37 |
| 42193.0 | 36 |
| 42197.0 | 35 |
| 42209.0 | 34 |
| 42221.0 | 33 |
| 42223.0 | 34 |
| 42227.0 | 35 |
| 42239.0 | 36 |
| 42257.0 | 35 |
| 42281.0 | 34 |
| 42283.0 | 35 |
| 42293.0 | 34 |
| 42299.0 | 35 |
| 42307.0 | 36 |
| 42323.0 | 37 |
| 42331.0 | 38 |
| 42337.0 | 37 |
| 42349.0 | 36 |
| 42359.0 | 37 |
| 42373.0 | 36 |
| 42379.0 | 37 |
| 42391.0 | 38 |
| 42397.0 | 37 |
| 42403.0 | 38 |
| 42407.0 | 39 |
| 42409.0 | 38 |
| 42433.0 | 37 |
| 42437.0 | 36 |
| 42443.0 | 37 |
| 42451.0 | 38 |
| 42457.0 | 37 |
| 42461.0 | 36 |
| 42463.0 | 37 |
| 42467.0 | 38 |
| 42473.0 | 37 |
| 42487.0 | 38 |
| 42491.0 | 39 |
| 42499.0 | 40 |
| 42509.0 | 39 |
| 42533.0 | 38 |
| 42557.0 | 37 |
| 42569.0 | 36 |
| 42571.0 | 37 |
| 42577.0 | 36 |
| 42589.0 | 35 |
| 42611.0 | 36 |
| 42641.0 | 35 |
| 42643.0 | 36 |
| 42649.0 | 35 |
| 42667.0 | 36 |
| 42677.0 | 35 |
| 42683.0 | 36 |
| 42689.0 | 35 |
| 42697.0 | 34 |
| 42701.0 | 33 |
| 42703.0 | 34 |
| 42709.0 | 33 |
| 42719.0 | 34 |
| 42727.0 | 35 |
| 42737.0 | 34 |
| 42743.0 | 35 |
| 42751.0 | 36 |
| 42767.0 | 37 |
| 42773.0 | 36 |
| 42787.0 | 37 |
| 42793.0 | 36 |
| 42797.0 | 35 |
| 42821.0 | 34 |
| 42829.0 | 33 |
| 42839.0 | 34 |
| 42841.0 | 33 |
| 42853.0 | 32 |
| 42859.0 | 33 |
| 42863.0 | 34 |
| 42899.0 | 35 |
| 42901.0 | 34 |
| 42923.0 | 35 |
| 42929.0 | 34 |
| 42937.0 | 33 |
| 42943.0 | 34 |
| 42953.0 | 33 |
| 42961.0 | 32 |
| 42967.0 | 33 |
| 42979.0 | 34 |
| 42989.0 | 33 |
| 43003.0 | 34 |
| 43013.0 | 33 |
| 43019.0 | 34 |
| 43037.0 | 33 |
| 43049.0 | 32 |
| 43051.0 | 33 |
| 43063.0 | 34 |
| 43067.0 | 35 |
| 43093.0 | 34 |
| 43103.0 | 35 |
| 43117.0 | 34 |
| 43133.0 | 33 |
| 43151.0 | 34 |
| 43159.0 | 35 |
| 43177.0 | 34 |
| 43189.0 | 33 |
| 43201.0 | 32 |
| 43207.0 | 33 |
| 43223.0 | 34 |
| 43237.0 | 33 |
| 43261.0 | 32 |
| 43271.0 | 33 |
| 43283.0 | 34 |
| 43291.0 | 35 |
| 43313.0 | 34 |
| 43319.0 | 35 |
| 43321.0 | 34 |
| 43331.0 | 35 |
| 43391.0 | 36 |
| 43397.0 | 35 |
| 43399.0 | 36 |
| 43403.0 | 37 |
| 43411.0 | 38 |
| 43427.0 | 39 |
| 43441.0 | 38 |
| 43451.0 | 39 |
| 43457.0 | 38 |
| 43481.0 | 37 |
| 43487.0 | 38 |
| 43499.0 | 39 |
| 43517.0 | 38 |
| 43541.0 | 37 |
| 43543.0 | 38 |
| 43573.0 | 37 |
| 43577.0 | 36 |
| 43579.0 | 37 |
| 43591.0 | 38 |
| 43597.0 | 37 |
| 43607.0 | 38 |
| 43609.0 | 37 |
| 43613.0 | 36 |
| 43627.0 | 37 |
| 43633.0 | 36 |
| 43649.0 | 35 |
| 43651.0 | 36 |
| 43661.0 | 35 |
| 43669.0 | 34 |
| 43691.0 | 35 |
| 43711.0 | 36 |
| 43717.0 | 35 |
| 43721.0 | 34 |
| 43753.0 | 33 |
| 43759.0 | 34 |
| 43777.0 | 33 |
| 43781.0 | 32 |
| 43783.0 | 33 |
| 43787.0 | 34 |
| 43789.0 | 33 |
| 43793.0 | 32 |
| 43801.0 | 31 |
| 43853.0 | 30 |
| 43867.0 | 31 |
| 43889.0 | 30 |
| 43891.0 | 31 |
| 43913.0 | 30 |
| 43933.0 | 29 |
| 43943.0 | 30 |
| 43951.0 | 31 |
| 43961.0 | 30 |
| 43963.0 | 31 |
| 43969.0 | 30 |
| 43973.0 | 29 |
| 43987.0 | 30 |
| 43991.0 | 31 |
| 43997.0 | 30 |
| 44017.0 | 29 |
| 44021.0 | 28 |
| 44027.0 | 29 |
| 44029.0 | 28 |
| 44041.0 | 27 |
| 44053.0 | 26 |
| 44059.0 | 27 |
| 44071.0 | 28 |
| 44087.0 | 29 |
| 44089.0 | 28 |
| 44101.0 | 27 |
| 44111.0 | 28 |
| 44119.0 | 29 |
| 44123.0 | 30 |
| 44129.0 | 29 |
| 44131.0 | 30 |
| 44159.0 | 31 |
| 44171.0 | 32 |
| 44179.0 | 33 |
| 44189.0 | 32 |
| 44201.0 | 31 |
| 44203.0 | 32 |
| 44207.0 | 33 |
| 44221.0 | 32 |
| 44249.0 | 31 |
| 44257.0 | 30 |
| 44263.0 | 31 |
| 44267.0 | 32 |
| 44269.0 | 31 |
| 44273.0 | 30 |
| 44279.0 | 31 |
| 44281.0 | 30 |
| 44293.0 | 29 |
| 44351.0 | 30 |
| 44357.0 | 29 |
| 44371.0 | 30 |
| 44381.0 | 29 |
| 44383.0 | 30 |
| 44389.0 | 29 |
| 44417.0 | 28 |
| 44449.0 | 27 |
| 44453.0 | 26 |
| 44483.0 | 27 |
| 44491.0 | 28 |
| 44497.0 | 27 |
| 44501.0 | 26 |
| 44507.0 | 27 |
| 44519.0 | 28 |
| 44531.0 | 29 |
| 44533.0 | 28 |
| 44537.0 | 27 |
| 44543.0 | 28 |
| 44549.0 | 27 |
| 44563.0 | 28 |
| 44579.0 | 29 |
| 44587.0 | 30 |
| 44617.0 | 29 |
| 44621.0 | 28 |
| 44623.0 | 29 |
| 44633.0 | 28 |
| 44641.0 | 27 |
| 44647.0 | 28 |
| 44651.0 | 29 |
| 44657.0 | 28 |
| 44683.0 | 29 |
| 44687.0 | 30 |
| 44699.0 | 31 |
| 44701.0 | 30 |
| 44711.0 | 31 |
| 44729.0 | 30 |
| 44741.0 | 29 |
| 44753.0 | 28 |
| 44771.0 | 29 |
| 44773.0 | 28 |
| 44777.0 | 27 |
| 44789.0 | 26 |
| 44797.0 | 25 |
| 44809.0 | 24 |
| 44819.0 | 25 |
| 44839.0 | 26 |
| 44843.0 | 27 |
| 44851.0 | 28 |
| 44867.0 | 29 |
| 44879.0 | 30 |
| 44887.0 | 31 |
| 44893.0 | 30 |
| 44909.0 | 29 |
| 44917.0 | 28 |
| 44927.0 | 29 |
| 44939.0 | 30 |
| 44953.0 | 29 |
| 44959.0 | 30 |
| 44963.0 | 31 |
| 44971.0 | 32 |
| 44983.0 | 33 |
| 44987.0 | 34 |
| 45007.0 | 35 |
| 45013.0 | 34 |
| 45053.0 | 33 |
| 45061.0 | 32 |
| 45077.0 | 31 |
| 45083.0 | 32 |
| 45119.0 | 33 |
| 45121.0 | 32 |
| 45127.0 | 33 |
| 45131.0 | 34 |
| 45137.0 | 33 |
| 45139.0 | 34 |
| 45161.0 | 33 |
| 45179.0 | 34 |
| 45181.0 | 33 |
| 45191.0 | 34 |
| 45197.0 | 33 |
| 45233.0 | 32 |
| 45247.0 | 33 |
| 45259.0 | 34 |
| 45263.0 | 35 |
| 45281.0 | 34 |
| 45289.0 | 33 |
| 45293.0 | 32 |
| 45307.0 | 33 |
| 45317.0 | 32 |
| 45319.0 | 33 |
| 45329.0 | 32 |
| 45337.0 | 31 |
| 45341.0 | 30 |
| 45343.0 | 31 |
| 45361.0 | 30 |
| 45377.0 | 29 |
| 45389.0 | 28 |
| 45403.0 | 29 |
| 45413.0 | 28 |
| 45427.0 | 29 |
| 45433.0 | 28 |
| 45439.0 | 29 |
| 45481.0 | 28 |
| 45491.0 | 29 |
| 45497.0 | 28 |
| 45503.0 | 29 |
| 45523.0 | 30 |
| 45533.0 | 29 |
| 45541.0 | 28 |
| 45553.0 | 27 |
| 45557.0 | 26 |
| 45569.0 | 25 |
| 45587.0 | 26 |
| 45589.0 | 25 |
| 45599.0 | 26 |
| 45613.0 | 25 |
| 45631.0 | 26 |
| 45641.0 | 25 |
| 45659.0 | 26 |
| 45667.0 | 27 |
| 45673.0 | 26 |
| 45677.0 | 25 |
| 45691.0 | 26 |
| 45697.0 | 25 |
| 45707.0 | 26 |
| 45737.0 | 25 |
| 45751.0 | 26 |
| 45757.0 | 25 |
| 45763.0 | 26 |
| 45767.0 | 27 |
| 45779.0 | 28 |
| 45817.0 | 27 |
| 45821.0 | 26 |
| 45823.0 | 27 |
| 45827.0 | 28 |
| 45833.0 | 27 |
| 45841.0 | 26 |
| 45853.0 | 25 |
| 45863.0 | 26 |
| 45869.0 | 25 |
| 45887.0 | 26 |
| 45893.0 | 25 |
| 45943.0 | 26 |
| 45949.0 | 25 |
| 45953.0 | 24 |
| 45959.0 | 25 |
| 45971.0 | 26 |
| 45979.0 | 27 |
| 45989.0 | 26 |
| 46021.0 | 25 |
| 46027.0 | 26 |
| 46049.0 | 25 |
| 46051.0 | 26 |
| 46061.0 | 25 |
| 46073.0 | 24 |
| 46091.0 | 25 |
| 46093.0 | 24 |
| 46099.0 | 25 |
| 46103.0 | 26 |
| 46133.0 | 25 |
| 46141.0 | 24 |
| 46147.0 | 25 |
| 46153.0 | 24 |
| 46171.0 | 25 |
| 46181.0 | 24 |
| 46183.0 | 25 |
| 46187.0 | 26 |
| 46199.0 | 27 |
| 46219.0 | 28 |
| 46229.0 | 27 |
| 46237.0 | 26 |
| 46261.0 | 25 |
| 46271.0 | 26 |
| 46273.0 | 25 |
| 46279.0 | 26 |
| 46301.0 | 25 |
| 46307.0 | 26 |
| 46309.0 | 25 |
| 46327.0 | 26 |
| 46337.0 | 25 |
| 46349.0 | 24 |
| 46351.0 | 25 |
| 46381.0 | 24 |
| 46399.0 | 25 |
| 46411.0 | 26 |
| 46439.0 | 27 |
| 46441.0 | 26 |
| 46447.0 | 27 |
| 46451.0 | 28 |
| 46457.0 | 27 |
| 46471.0 | 28 |
| 46477.0 | 27 |
| 46489.0 | 26 |
| 46499.0 | 27 |
| 46507.0 | 28 |
| 46511.0 | 29 |
| 46523.0 | 30 |
| 46549.0 | 29 |
| 46559.0 | 30 |
| 46567.0 | 31 |
| 46573.0 | 30 |
| 46589.0 | 29 |
| 46591.0 | 30 |
| 46601.0 | 29 |
| 46619.0 | 30 |
| 46633.0 | 29 |
| 46639.0 | 30 |
| 46643.0 | 31 |
| 46649.0 | 30 |
| 46663.0 | 31 |
| 46679.0 | 32 |
| 46681.0 | 31 |
| 46687.0 | 32 |
| 46691.0 | 33 |
| 46703.0 | 34 |
| 46723.0 | 35 |
| 46727.0 | 36 |
| 46747.0 | 37 |
| 46751.0 | 38 |
| 46757.0 | 37 |
| 46769.0 | 36 |
| 46771.0 | 37 |
| 46807.0 | 38 |
| 46811.0 | 39 |
| 46817.0 | 38 |
| 46819.0 | 39 |
| 46829.0 | 38 |
| 46831.0 | 39 |
| 46853.0 | 38 |
| 46861.0 | 37 |
| 46867.0 | 38 |
| 46877.0 | 37 |
| 46889.0 | 36 |
| 46901.0 | 35 |
| 46919.0 | 36 |
| 46933.0 | 35 |
| 46957.0 | 34 |
| 46993.0 | 33 |
| 46997.0 | 32 |
| 47017.0 | 31 |
| 47041.0 | 30 |
| 47051.0 | 31 |
| 47057.0 | 30 |
| 47059.0 | 31 |
| 47087.0 | 32 |
| 47093.0 | 31 |
| 47111.0 | 32 |
| 47119.0 | 33 |
| 47123.0 | 34 |
| 47129.0 | 33 |
| 47137.0 | 32 |
| 47143.0 | 33 |
| 47147.0 | 34 |
| 47149.0 | 33 |
| 47161.0 | 32 |
| 47189.0 | 31 |
| 47207.0 | 32 |
| 47221.0 | 31 |
| 47237.0 | 30 |
| 47251.0 | 31 |
| 47269.0 | 30 |
| 47279.0 | 31 |
| 47287.0 | 32 |
| 47293.0 | 31 |
| 47297.0 | 30 |
| 47303.0 | 31 |
| 47309.0 | 30 |
| 47317.0 | 29 |
| 47339.0 | 30 |
| 47351.0 | 31 |
| 47353.0 | 30 |
| 47363.0 | 31 |
| 47381.0 | 30 |
| 47387.0 | 31 |
| 47389.0 | 30 |
| 47407.0 | 31 |
| 47417.0 | 30 |
| 47419.0 | 31 |
| 47431.0 | 32 |
| 47441.0 | 31 |
| 47459.0 | 32 |
| 47491.0 | 33 |
| 47497.0 | 32 |
| 47501.0 | 31 |
| 47507.0 | 32 |
| 47513.0 | 31 |
| 47521.0 | 30 |
| 47527.0 | 31 |
| 47533.0 | 30 |
| 47543.0 | 31 |
| 47563.0 | 32 |
| 47569.0 | 31 |
| 47581.0 | 30 |
| 47591.0 | 31 |
| 47599.0 | 32 |
| 47609.0 | 31 |
| 47623.0 | 32 |
| 47629.0 | 31 |
| 47639.0 | 32 |
| 47653.0 | 31 |
| 47657.0 | 30 |
| 47659.0 | 31 |
| 47681.0 | 30 |
| 47699.0 | 31 |
| 47701.0 | 30 |
| 47711.0 | 31 |
| 47713.0 | 30 |
| 47717.0 | 29 |
| 47737.0 | 28 |
| 47741.0 | 27 |
| 47743.0 | 28 |
| 47777.0 | 27 |
| 47779.0 | 28 |
| 47791.0 | 29 |
| 47797.0 | 28 |
| 47807.0 | 29 |
| 47809.0 | 28 |
| 47819.0 | 29 |
| 47837.0 | 28 |
| 47843.0 | 29 |
| 47857.0 | 28 |
| 47869.0 | 27 |
| 47881.0 | 26 |
| 47903.0 | 27 |
| 47911.0 | 28 |
| 47917.0 | 27 |
| 47933.0 | 26 |
| 47939.0 | 27 |
| 47947.0 | 28 |
| 47951.0 | 29 |
| 47963.0 | 30 |
| 47969.0 | 29 |
| 47977.0 | 28 |
| 47981.0 | 27 |
| 48017.0 | 26 |
| 48023.0 | 27 |
| 48029.0 | 26 |
| 48049.0 | 25 |
| 48073.0 | 24 |
| 48079.0 | 25 |
| 48091.0 | 26 |
| 48109.0 | 25 |
| 48119.0 | 26 |
| 48121.0 | 25 |
| 48131.0 | 26 |
| 48157.0 | 25 |
| 48163.0 | 26 |
| 48179.0 | 27 |
| 48187.0 | 28 |
| 48193.0 | 27 |
| 48197.0 | 26 |
| 48221.0 | 25 |
| 48239.0 | 26 |
| 48247.0 | 27 |
| 48259.0 | 28 |
| 48271.0 | 29 |
| 48281.0 | 28 |
| 48299.0 | 29 |
| 48311.0 | 30 |
| 48313.0 | 29 |
| 48337.0 | 28 |
| 48341.0 | 27 |
| 48353.0 | 26 |
| 48371.0 | 27 |
| 48383.0 | 28 |
| 48397.0 | 27 |
| 48407.0 | 28 |
| 48409.0 | 27 |
| 48413.0 | 26 |
| 48437.0 | 25 |
| 48449.0 | 24 |
| 48463.0 | 25 |
| 48473.0 | 24 |
| 48479.0 | 25 |
| 48481.0 | 24 |
| 48487.0 | 25 |
| 48491.0 | 26 |
| 48497.0 | 25 |
| 48523.0 | 26 |
| 48527.0 | 27 |
| 48533.0 | 26 |
| 48539.0 | 27 |
| 48541.0 | 26 |
| 48563.0 | 27 |
| 48571.0 | 28 |
| 48589.0 | 27 |
| 48593.0 | 26 |
| 48611.0 | 27 |
| 48619.0 | 28 |
| 48623.0 | 29 |
| 48647.0 | 30 |
| 48649.0 | 29 |
| 48661.0 | 28 |
| 48673.0 | 27 |
| 48677.0 | 26 |
| 48679.0 | 27 |
| 48731.0 | 28 |
| 48733.0 | 27 |
| 48751.0 | 28 |
| 48757.0 | 27 |
| 48761.0 | 26 |
| 48767.0 | 27 |
| 48779.0 | 28 |
| 48781.0 | 27 |
| 48787.0 | 28 |
| 48799.0 | 29 |
| 48809.0 | 28 |
| 48817.0 | 27 |
| 48821.0 | 26 |
| 48823.0 | 27 |
| 48847.0 | 28 |
| 48857.0 | 27 |
| 48859.0 | 28 |
| 48869.0 | 27 |
| 48871.0 | 28 |
| 48883.0 | 29 |
| 48889.0 | 28 |
| 48907.0 | 29 |
| 48947.0 | 30 |
| 48953.0 | 29 |
| 48973.0 | 28 |
| 48989.0 | 27 |
| 48991.0 | 28 |
| 49003.0 | 29 |
| 49009.0 | 28 |
| 49019.0 | 29 |
| 49031.0 | 30 |
| 49033.0 | 29 |
| 49037.0 | 28 |
| 49043.0 | 29 |
| 49057.0 | 28 |
| 49069.0 | 27 |
| 49081.0 | 26 |
| 49103.0 | 27 |
| 49109.0 | 26 |
| 49117.0 | 25 |
| 49121.0 | 24 |
| 49123.0 | 25 |
| 49139.0 | 26 |
| 49157.0 | 25 |
| 49169.0 | 24 |
| 49171.0 | 25 |
| 49177.0 | 24 |
| 49193.0 | 23 |
| 49199.0 | 24 |
| 49201.0 | 23 |
| 49207.0 | 24 |
| 49211.0 | 25 |
| 49223.0 | 26 |
| 49253.0 | 25 |
| 49261.0 | 24 |
| 49277.0 | 23 |
| 49279.0 | 24 |
| 49297.0 | 23 |
| 49307.0 | 24 |
| 49331.0 | 25 |
| 49333.0 | 24 |
| 49339.0 | 25 |
| 49363.0 | 26 |
| 49367.0 | 27 |
| 49369.0 | 26 |
| 49391.0 | 27 |
| 49393.0 | 26 |
| 49409.0 | 25 |
| 49411.0 | 26 |
| 49417.0 | 25 |
| 49429.0 | 24 |
| 49433.0 | 23 |
| 49451.0 | 24 |
| 49459.0 | 25 |
| 49463.0 | 26 |
| 49477.0 | 25 |
| 49481.0 | 24 |
| 49499.0 | 25 |
| 49523.0 | 26 |
| 49529.0 | 25 |
| 49531.0 | 26 |
| 49537.0 | 25 |
| 49547.0 | 26 |
| 49549.0 | 25 |
| 49559.0 | 26 |
| 49597.0 | 25 |
| 49603.0 | 26 |
| 49613.0 | 25 |
| 49627.0 | 26 |
| 49633.0 | 25 |
| 49639.0 | 26 |
| 49663.0 | 27 |
| 49667.0 | 28 |
| 49669.0 | 27 |
| 49681.0 | 26 |
| 49697.0 | 25 |
| 49711.0 | 26 |
| 49727.0 | 27 |
| 49739.0 | 28 |
| 49741.0 | 27 |
| 49747.0 | 28 |
| 49757.0 | 27 |
| 49783.0 | 28 |
| 49787.0 | 29 |
| 49789.0 | 28 |
| 49801.0 | 27 |
| 49807.0 | 28 |
| 49811.0 | 29 |
| 49823.0 | 30 |
| 49831.0 | 31 |
| 49843.0 | 32 |
| 49853.0 | 31 |
| 49871.0 | 32 |
| 49877.0 | 31 |
| 49891.0 | 32 |
| 49919.0 | 33 |
| 49921.0 | 32 |
| 49927.0 | 33 |
| 49937.0 | 32 |
| 49939.0 | 33 |
| 49943.0 | 34 |
| 49957.0 | 33 |
| 49991.0 | 34 |
| 49993.0 | 33 |
| 49999.0 | 34 |
| 50021.0 | 33 |
| 50023.0 | 34 |
| 50033.0 | 33 |
| 50047.0 | 34 |
| 50051.0 | 35 |
| 50053.0 | 34 |
| 50069.0 | 33 |
| 50077.0 | 32 |
| 50087.0 | 33 |
| 50093.0 | 32 |
| 50101.0 | 31 |
| 50111.0 | 32 |
| 50119.0 | 33 |
| 50123.0 | 34 |
| 50129.0 | 33 |
| 50131.0 | 34 |
| 50147.0 | 35 |
| 50153.0 | 34 |
| 50159.0 | 35 |
| 50177.0 | 34 |
| 50207.0 | 35 |
| 50221.0 | 34 |
| 50227.0 | 35 |
| 50231.0 | 36 |
| 50261.0 | 35 |
| 50263.0 | 36 |
| 50273.0 | 35 |
| 50287.0 | 36 |
| 50291.0 | 37 |
| 50311.0 | 38 |
| 50321.0 | 37 |
| 50329.0 | 36 |
| 50333.0 | 35 |
| 50341.0 | 34 |
| 50359.0 | 35 |
| 50363.0 | 36 |
| 50377.0 | 35 |
| 50383.0 | 36 |
| 50387.0 | 37 |
| 50411.0 | 38 |
| 50417.0 | 37 |
| 50423.0 | 38 |
| 50441.0 | 37 |
| 50459.0 | 38 |
| 50461.0 | 37 |
| 50497.0 | 36 |
| 50503.0 | 37 |
| 50513.0 | 36 |
| 50527.0 | 37 |
| 50539.0 | 38 |
| 50543.0 | 39 |
| 50549.0 | 38 |
| 50551.0 | 39 |
| 50581.0 | 38 |
| 50587.0 | 39 |
| 50591.0 | 40 |
| 50593.0 | 39 |
| 50599.0 | 40 |
| 50627.0 | 41 |
| 50647.0 | 42 |
| 50651.0 | 43 |
| 50671.0 | 44 |
| 50683.0 | 45 |
| 50707.0 | 46 |
| 50723.0 | 47 |
| 50741.0 | 46 |
| 50753.0 | 45 |
| 50767.0 | 46 |
| 50773.0 | 45 |
| 50777.0 | 44 |
| 50789.0 | 43 |
| 50821.0 | 42 |
| 50833.0 | 41 |
| 50839.0 | 42 |
| 50849.0 | 41 |
| 50857.0 | 40 |
| 50867.0 | 41 |
| 50873.0 | 40 |
| 50891.0 | 41 |
| 50893.0 | 40 |
| 50909.0 | 39 |
| 50923.0 | 40 |
| 50929.0 | 39 |
| 50951.0 | 40 |
| 50957.0 | 39 |
| 50969.0 | 38 |
| 50971.0 | 39 |
| 50989.0 | 38 |
| 50993.0 | 37 |
| 51001.0 | 36 |
| 51031.0 | 37 |
| 51043.0 | 38 |
| 51047.0 | 39 |
| 51059.0 | 40 |
| 51061.0 | 39 |
| 51071.0 | 40 |
| 51109.0 | 39 |
| 51131.0 | 40 |
| 51133.0 | 39 |
| 51137.0 | 38 |
| 51151.0 | 39 |
| 51157.0 | 38 |
| 51169.0 | 37 |
| 51193.0 | 36 |
| 51197.0 | 35 |
| 51199.0 | 36 |
| 51203.0 | 37 |
| 51217.0 | 36 |
| 51229.0 | 35 |
| 51239.0 | 36 |
| 51241.0 | 35 |
| 51257.0 | 34 |
| 51263.0 | 35 |
| 51283.0 | 36 |
| 51287.0 | 37 |
| 51307.0 | 38 |
| 51329.0 | 37 |
| 51341.0 | 36 |
| 51343.0 | 37 |
| 51347.0 | 38 |
| 51349.0 | 37 |
| 51361.0 | 36 |
| 51383.0 | 37 |
| 51407.0 | 38 |
| 51413.0 | 37 |
| 51419.0 | 38 |
| 51421.0 | 37 |
| 51427.0 | 38 |
| 51431.0 | 39 |
| 51437.0 | 38 |
| 51439.0 | 39 |
| 51449.0 | 38 |
| 51461.0 | 37 |
| 51473.0 | 36 |
| 51479.0 | 37 |
| 51481.0 | 36 |
| 51487.0 | 37 |
| 51503.0 | 38 |
| 51511.0 | 39 |
| 51517.0 | 38 |
| 51521.0 | 37 |
| 51539.0 | 38 |
| 51551.0 | 39 |
| 51563.0 | 40 |
| 51577.0 | 39 |
| 51581.0 | 38 |
| 51593.0 | 37 |
| 51599.0 | 38 |
| 51607.0 | 39 |
| 51613.0 | 38 |
| 51631.0 | 39 |
| 51637.0 | 38 |
| 51647.0 | 39 |
| 51659.0 | 40 |
| 51673.0 | 39 |
| 51679.0 | 40 |
| 51683.0 | 41 |
| 51691.0 | 42 |
| 51713.0 | 41 |
| 51719.0 | 42 |
| 51721.0 | 41 |
| 51749.0 | 40 |
| 51767.0 | 41 |
| 51769.0 | 40 |
| 51787.0 | 41 |
| 51797.0 | 40 |
| 51803.0 | 41 |
| 51817.0 | 40 |
| 51827.0 | 41 |
| 51829.0 | 40 |
| 51839.0 | 41 |
| 51853.0 | 40 |
| 51859.0 | 41 |
| 51869.0 | 40 |
| 51871.0 | 41 |
| 51893.0 | 40 |
| 51899.0 | 41 |
| 51907.0 | 42 |
| 51913.0 | 41 |
| 51929.0 | 40 |
| 51941.0 | 39 |
| 51949.0 | 38 |
| 51971.0 | 39 |
| 51973.0 | 38 |
| 51977.0 | 37 |
| 51991.0 | 38 |
| 52009.0 | 37 |
| 52021.0 | 36 |
| 52027.0 | 37 |
| 52051.0 | 38 |
| 52057.0 | 37 |
| 52067.0 | 38 |
| 52069.0 | 37 |
| 52081.0 | 36 |
| 52103.0 | 37 |
| 52121.0 | 36 |
| 52127.0 | 37 |
| 52147.0 | 38 |
| 52153.0 | 37 |
| 52163.0 | 38 |
| 52177.0 | 37 |
| 52181.0 | 36 |
| 52183.0 | 37 |
| 52189.0 | 36 |
| 52201.0 | 35 |
| 52223.0 | 36 |
| 52237.0 | 35 |
| 52249.0 | 34 |
| 52253.0 | 33 |
| 52259.0 | 34 |
| 52267.0 | 35 |
| 52289.0 | 34 |
| 52291.0 | 35 |
| 52301.0 | 34 |
| 52313.0 | 33 |
| 52321.0 | 32 |
| 52361.0 | 31 |
| 52363.0 | 32 |
| 52369.0 | 31 |
| 52379.0 | 32 |
| 52387.0 | 33 |
| 52391.0 | 34 |
| 52433.0 | 33 |
| 52453.0 | 32 |
| 52457.0 | 31 |
| 52489.0 | 30 |
| 52501.0 | 29 |
| 52511.0 | 30 |
| 52517.0 | 29 |
| 52529.0 | 28 |
| 52541.0 | 27 |
| 52543.0 | 28 |
| 52553.0 | 27 |
| 52561.0 | 26 |
| 52567.0 | 27 |
| 52571.0 | 28 |
| 52579.0 | 29 |
| 52583.0 | 30 |
| 52609.0 | 29 |
| 52627.0 | 30 |
| 52631.0 | 31 |
| 52639.0 | 32 |
| 52667.0 | 33 |
| 52673.0 | 32 |
| 52691.0 | 33 |
| 52697.0 | 32 |
| 52709.0 | 31 |
| 52711.0 | 32 |
| 52721.0 | 31 |
| 52727.0 | 32 |
| 52733.0 | 31 |
| 52747.0 | 32 |
| 52757.0 | 31 |
| 52769.0 | 30 |
| 52783.0 | 31 |
| 52807.0 | 32 |
| 52813.0 | 31 |
| 52817.0 | 30 |
| 52837.0 | 29 |
| 52859.0 | 30 |
| 52861.0 | 29 |
| 52879.0 | 30 |
| 52883.0 | 31 |
| 52889.0 | 30 |
| 52901.0 | 29 |
| 52903.0 | 30 |
| 52919.0 | 31 |
| 52937.0 | 30 |
| 52951.0 | 31 |
| 52957.0 | 30 |
| 52963.0 | 31 |
| 52967.0 | 32 |
| 52973.0 | 31 |
| 52981.0 | 30 |
| 52999.0 | 31 |
| 53003.0 | 32 |
| 53017.0 | 31 |
| 53047.0 | 32 |
| 53051.0 | 33 |
| 53069.0 | 32 |
| 53077.0 | 31 |
| 53087.0 | 32 |
| 53089.0 | 31 |
| 53093.0 | 30 |
| 53101.0 | 29 |
| 53113.0 | 28 |
| 53117.0 | 27 |
| 53129.0 | 26 |
| 53147.0 | 27 |
| 53149.0 | 26 |
| 53161.0 | 25 |
| 53171.0 | 26 |
| 53173.0 | 25 |
| 53189.0 | 24 |
| 53197.0 | 23 |
| 53201.0 | 22 |
| 53231.0 | 23 |
| 53233.0 | 22 |
| 53239.0 | 23 |
| 53267.0 | 24 |
| 53269.0 | 23 |
| 53279.0 | 24 |
| 53281.0 | 23 |
| 53299.0 | 24 |
| 53309.0 | 23 |
| 53323.0 | 24 |
| 53327.0 | 25 |
| 53353.0 | 24 |
| 53359.0 | 25 |
| 53377.0 | 24 |
| 53381.0 | 23 |
| 53401.0 | 22 |
| 53407.0 | 23 |
| 53411.0 | 24 |
| 53419.0 | 25 |
| 53437.0 | 24 |
| 53441.0 | 23 |
| 53453.0 | 22 |
| 53479.0 | 23 |
| 53503.0 | 24 |
| 53507.0 | 25 |
| 53527.0 | 26 |
| 53549.0 | 25 |
| 53551.0 | 26 |
| 53569.0 | 25 |
| 53591.0 | 26 |
| 53593.0 | 25 |
| 53597.0 | 24 |
| 53609.0 | 23 |
| 53611.0 | 24 |
| 53617.0 | 23 |
| 53623.0 | 24 |
| 53629.0 | 23 |
| 53633.0 | 22 |
| 53639.0 | 23 |
| 53653.0 | 22 |
| 53657.0 | 21 |
| 53681.0 | 20 |
| 53693.0 | 19 |
| 53699.0 | 20 |
| 53717.0 | 19 |
| 53719.0 | 20 |
| 53731.0 | 21 |
| 53759.0 | 22 |
| 53773.0 | 21 |
| 53777.0 | 20 |
| 53783.0 | 21 |
| 53791.0 | 22 |
| 53813.0 | 21 |
| 53819.0 | 22 |
| 53831.0 | 23 |
| 53849.0 | 22 |
| 53857.0 | 21 |
| 53861.0 | 20 |
| 53881.0 | 19 |
| 53887.0 | 20 |
| 53891.0 | 21 |
| 53897.0 | 20 |
| 53899.0 | 21 |
| 53917.0 | 20 |
| 53923.0 | 21 |
| 53927.0 | 22 |
| 53939.0 | 23 |
| 53951.0 | 24 |
| 53959.0 | 25 |
| 53987.0 | 26 |
| 53993.0 | 25 |
| 54001.0 | 24 |
| 54011.0 | 25 |
| 54013.0 | 24 |
| 54037.0 | 23 |
| 54049.0 | 22 |
| 54059.0 | 23 |
| 54083.0 | 24 |
| 54091.0 | 25 |
| 54101.0 | 24 |
| 54121.0 | 23 |
| 54133.0 | 22 |
| 54139.0 | 23 |
| 54151.0 | 24 |
| 54163.0 | 25 |
| 54167.0 | 26 |
| 54181.0 | 25 |
| 54193.0 | 24 |
| 54217.0 | 23 |
| 54251.0 | 24 |
| 54269.0 | 23 |
| 54277.0 | 22 |
| 54287.0 | 23 |
| 54293.0 | 22 |
| 54311.0 | 23 |
| 54319.0 | 24 |
| 54323.0 | 25 |
| 54331.0 | 26 |
| 54347.0 | 27 |
| 54361.0 | 26 |
| 54367.0 | 27 |
| 54371.0 | 28 |
| 54377.0 | 27 |
| 54401.0 | 26 |
| 54403.0 | 27 |
| 54409.0 | 26 |
| 54413.0 | 25 |
| 54419.0 | 26 |
| 54421.0 | 25 |
| 54437.0 | 24 |
| 54443.0 | 25 |
| 54449.0 | 24 |
| 54469.0 | 23 |
| 54493.0 | 22 |
| 54497.0 | 21 |
| 54499.0 | 22 |
| 54503.0 | 23 |
| 54517.0 | 22 |
| 54521.0 | 21 |
| 54539.0 | 22 |
| 54541.0 | 21 |
| 54547.0 | 22 |
| 54559.0 | 23 |
| 54563.0 | 24 |
| 54577.0 | 23 |
| 54581.0 | 22 |
| 54583.0 | 23 |
| 54601.0 | 22 |
| 54617.0 | 21 |
| 54623.0 | 22 |
| 54629.0 | 21 |
| 54631.0 | 22 |
| 54647.0 | 23 |
| 54667.0 | 24 |
| 54673.0 | 23 |
| 54679.0 | 24 |
| 54709.0 | 23 |
| 54713.0 | 22 |
| 54721.0 | 21 |
| 54727.0 | 22 |
| 54751.0 | 23 |
| 54767.0 | 24 |
| 54773.0 | 23 |
| 54779.0 | 24 |
| 54787.0 | 25 |
| 54799.0 | 26 |
| 54829.0 | 25 |
| 54833.0 | 24 |
| 54851.0 | 25 |
| 54869.0 | 24 |
| 54877.0 | 23 |
| 54881.0 | 22 |
| 54907.0 | 23 |
| 54917.0 | 22 |
| 54919.0 | 23 |
| 54941.0 | 22 |
| 54949.0 | 21 |
| 54959.0 | 22 |
| 54973.0 | 21 |
| 54979.0 | 22 |
| 54983.0 | 23 |
| 55001.0 | 22 |
| 55009.0 | 21 |
| 55021.0 | 20 |
| 55049.0 | 19 |
| 55051.0 | 20 |
| 55057.0 | 19 |
| 55061.0 | 18 |
| 55073.0 | 17 |
| 55079.0 | 18 |
| 55103.0 | 19 |
| 55109.0 | 18 |
| 55117.0 | 17 |
| 55127.0 | 18 |
| 55147.0 | 19 |
| 55163.0 | 20 |
| 55171.0 | 21 |
| 55201.0 | 20 |
| 55207.0 | 21 |
| 55213.0 | 20 |
| 55217.0 | 19 |
| 55219.0 | 20 |
| 55229.0 | 19 |
| 55243.0 | 20 |
| 55249.0 | 19 |
| 55259.0 | 20 |
| 55291.0 | 21 |
| 55313.0 | 20 |
| 55331.0 | 21 |
| 55333.0 | 20 |
| 55337.0 | 19 |
| 55339.0 | 20 |
| 55343.0 | 21 |
| 55351.0 | 22 |
| 55373.0 | 21 |
| 55381.0 | 20 |
| 55399.0 | 21 |
| 55411.0 | 22 |
| 55439.0 | 23 |
| 55441.0 | 22 |
| 55457.0 | 21 |
| 55469.0 | 20 |
| 55487.0 | 21 |
| 55501.0 | 20 |
| 55511.0 | 21 |
| 55529.0 | 20 |
| 55541.0 | 19 |
| 55547.0 | 20 |
| 55579.0 | 21 |
| 55589.0 | 20 |
| 55603.0 | 21 |
| 55609.0 | 20 |
| 55619.0 | 21 |
| 55621.0 | 20 |
| 55631.0 | 21 |
| 55633.0 | 20 |
| 55639.0 | 21 |
| 55661.0 | 20 |
| 55663.0 | 21 |
| 55667.0 | 22 |
| 55673.0 | 21 |
| 55681.0 | 20 |
| 55691.0 | 21 |
| 55697.0 | 20 |
| 55711.0 | 21 |
| 55717.0 | 20 |
| 55721.0 | 19 |
| 55733.0 | 18 |
| 55763.0 | 19 |
| 55787.0 | 20 |
| 55793.0 | 19 |
| 55799.0 | 20 |
| 55807.0 | 21 |
| 55813.0 | 20 |
| 55817.0 | 19 |
| 55819.0 | 20 |
| 55823.0 | 21 |
| 55829.0 | 20 |
| 55837.0 | 19 |
| 55843.0 | 20 |
| 55849.0 | 19 |
| 55871.0 | 20 |
| 55889.0 | 19 |
| 55897.0 | 18 |
| 55901.0 | 17 |
| 55903.0 | 18 |
| 55921.0 | 17 |
| 55927.0 | 18 |
| 55931.0 | 19 |
| 55933.0 | 18 |
| 55949.0 | 17 |
| 55967.0 | 18 |
| 55987.0 | 19 |
| 55997.0 | 18 |
| 56003.0 | 19 |
| 56009.0 | 18 |
| 56039.0 | 19 |
| 56041.0 | 18 |
| 56053.0 | 17 |
| 56081.0 | 16 |
| 56087.0 | 17 |
| 56093.0 | 16 |
| 56099.0 | 17 |
| 56101.0 | 16 |
| 56113.0 | 15 |
| 56123.0 | 16 |
| 56131.0 | 17 |
| 56149.0 | 16 |
| 56167.0 | 17 |
| 56171.0 | 18 |
| 56179.0 | 19 |
| 56197.0 | 18 |
| 56207.0 | 19 |
| 56209.0 | 18 |
| 56237.0 | 17 |
| 56239.0 | 18 |
| 56249.0 | 17 |
| 56263.0 | 18 |
| 56267.0 | 19 |
| 56269.0 | 18 |
| 56299.0 | 19 |
| 56311.0 | 20 |
| 56333.0 | 19 |
| 56359.0 | 20 |
| 56369.0 | 19 |
| 56377.0 | 18 |
| 56383.0 | 19 |
| 56393.0 | 18 |
| 56401.0 | 17 |
| 56417.0 | 16 |
| 56431.0 | 17 |
| 56437.0 | 16 |
| 56443.0 | 17 |
| 56453.0 | 16 |
| 56467.0 | 17 |
| 56473.0 | 16 |
| 56477.0 | 15 |
| 56479.0 | 16 |
| 56489.0 | 15 |
| 56501.0 | 14 |
| 56503.0 | 15 |
| 56509.0 | 14 |
| 56519.0 | 15 |
| 56527.0 | 16 |
| 56531.0 | 17 |
| 56533.0 | 16 |
| 56543.0 | 17 |
| 56569.0 | 16 |
| 56591.0 | 17 |
| 56597.0 | 16 |
| 56599.0 | 17 |
| 56611.0 | 18 |
| 56629.0 | 17 |
| 56633.0 | 16 |
| 56659.0 | 17 |
| 56663.0 | 18 |
| 56671.0 | 19 |
| 56681.0 | 18 |
| 56687.0 | 19 |
| 56701.0 | 18 |
| 56711.0 | 19 |
| 56713.0 | 18 |
| 56731.0 | 19 |
| 56737.0 | 18 |
| 56747.0 | 19 |
| 56767.0 | 20 |
| 56773.0 | 19 |
| 56779.0 | 20 |
| 56783.0 | 21 |
| 56807.0 | 22 |
| 56809.0 | 21 |
| 56813.0 | 20 |
| 56821.0 | 19 |
| 56827.0 | 20 |
| 56843.0 | 21 |
| 56857.0 | 20 |
| 56873.0 | 19 |
| 56891.0 | 20 |
| 56893.0 | 19 |
| 56897.0 | 18 |
| 56909.0 | 17 |
| 56911.0 | 18 |
| 56921.0 | 17 |
| 56923.0 | 18 |
| 56929.0 | 17 |
| 56941.0 | 16 |
| 56951.0 | 17 |
| 56957.0 | 16 |
| 56963.0 | 17 |
| 56983.0 | 18 |
| 56989.0 | 17 |
| 56993.0 | 16 |
| 56999.0 | 17 |
| 57037.0 | 16 |
| 57041.0 | 15 |
| 57047.0 | 16 |
| 57059.0 | 17 |
| 57073.0 | 16 |
| 57077.0 | 15 |
| 57089.0 | 14 |
| 57097.0 | 13 |
| 57107.0 | 14 |
| 57119.0 | 15 |
| 57131.0 | 16 |
| 57139.0 | 17 |
| 57143.0 | 18 |
| 57149.0 | 17 |
| 57163.0 | 18 |
| 57173.0 | 17 |
| 57179.0 | 18 |
| 57191.0 | 19 |
| 57193.0 | 18 |
| 57203.0 | 19 |
| 57221.0 | 18 |
| 57223.0 | 19 |
| 57241.0 | 18 |
| 57251.0 | 19 |
| 57259.0 | 20 |
| 57269.0 | 19 |
| 57271.0 | 20 |
| 57283.0 | 21 |
| 57287.0 | 22 |
| 57301.0 | 21 |
| 57329.0 | 20 |
| 57331.0 | 21 |
| 57347.0 | 22 |
| 57349.0 | 21 |
| 57367.0 | 22 |
| 57373.0 | 21 |
| 57383.0 | 22 |
| 57389.0 | 21 |
| 57397.0 | 20 |
| 57413.0 | 19 |
| 57427.0 | 20 |
| 57457.0 | 19 |
| 57467.0 | 20 |
| 57487.0 | 21 |
| 57493.0 | 20 |
| 57503.0 | 21 |
| 57527.0 | 22 |
| 57529.0 | 21 |
| 57557.0 | 20 |
| 57559.0 | 21 |
| 57571.0 | 22 |
| 57587.0 | 23 |
| 57593.0 | 22 |
| 57601.0 | 21 |
| 57637.0 | 20 |
| 57641.0 | 19 |
| 57649.0 | 18 |
| 57653.0 | 17 |
| 57667.0 | 18 |
| 57679.0 | 19 |
| 57689.0 | 18 |
| 57697.0 | 17 |
| 57709.0 | 16 |
| 57713.0 | 15 |
| 57719.0 | 16 |
| 57727.0 | 17 |
| 57731.0 | 18 |
| 57737.0 | 17 |
| 57751.0 | 18 |
| 57773.0 | 17 |
| 57781.0 | 16 |
| 57787.0 | 17 |
| 57791.0 | 18 |
| 57793.0 | 17 |
| 57803.0 | 18 |
| 57809.0 | 17 |
| 57829.0 | 16 |
| 57839.0 | 17 |
| 57847.0 | 18 |
| 57853.0 | 17 |
| 57859.0 | 18 |
| 57881.0 | 17 |
| 57899.0 | 18 |
| 57901.0 | 17 |
| 57917.0 | 16 |
| 57923.0 | 17 |
| 57943.0 | 18 |
| 57947.0 | 19 |
| 57973.0 | 18 |
| 57977.0 | 17 |
| 57991.0 | 18 |
| 58013.0 | 17 |
| 58027.0 | 18 |
| 58031.0 | 19 |
| 58043.0 | 20 |
| 58049.0 | 19 |
| 58057.0 | 18 |
| 58061.0 | 17 |
| 58067.0 | 18 |
| 58073.0 | 17 |
| 58099.0 | 18 |
| 58109.0 | 17 |
| 58111.0 | 18 |
| 58129.0 | 17 |
| 58147.0 | 18 |
| 58151.0 | 19 |
| 58153.0 | 18 |
| 58169.0 | 17 |
| 58171.0 | 18 |
| 58189.0 | 17 |
| 58193.0 | 16 |
| 58199.0 | 17 |
| 58207.0 | 18 |
| 58211.0 | 19 |
| 58217.0 | 18 |
| 58229.0 | 17 |
| 58231.0 | 18 |
| 58237.0 | 17 |
| 58243.0 | 18 |
| 58271.0 | 19 |
| 58309.0 | 18 |
| 58313.0 | 17 |
| 58321.0 | 16 |
| 58337.0 | 15 |
| 58363.0 | 16 |
| 58367.0 | 17 |
| 58369.0 | 16 |
| 58379.0 | 17 |
| 58391.0 | 18 |
| 58393.0 | 17 |
| 58403.0 | 18 |
| 58411.0 | 19 |
| 58417.0 | 18 |
| 58427.0 | 19 |
| 58439.0 | 20 |
| 58441.0 | 19 |
| 58451.0 | 20 |
| 58453.0 | 19 |
| 58477.0 | 18 |
| 58481.0 | 17 |
| 58511.0 | 18 |
| 58537.0 | 17 |
| 58543.0 | 18 |
| 58549.0 | 17 |
| 58567.0 | 18 |
| 58573.0 | 17 |
| 58579.0 | 18 |
| 58601.0 | 17 |
| 58603.0 | 18 |
| 58613.0 | 17 |
| 58631.0 | 18 |
| 58657.0 | 17 |
| 58661.0 | 16 |
| 58679.0 | 17 |
| 58687.0 | 18 |
| 58693.0 | 17 |
| 58699.0 | 18 |
| 58711.0 | 19 |
| 58727.0 | 20 |
| 58733.0 | 19 |
| 58741.0 | 18 |
| 58757.0 | 17 |
| 58763.0 | 18 |
| 58771.0 | 19 |
| 58787.0 | 20 |
| 58789.0 | 19 |
| 58831.0 | 20 |
| 58889.0 | 19 |
| 58897.0 | 18 |
| 58901.0 | 17 |
| 58907.0 | 18 |
| 58909.0 | 17 |
| 58913.0 | 16 |
| 58921.0 | 15 |
| 58937.0 | 14 |
| 58943.0 | 15 |
| 58963.0 | 16 |
| 58967.0 | 17 |
| 58979.0 | 18 |
| 58991.0 | 19 |
| 58997.0 | 18 |
| 59009.0 | 17 |
| 59011.0 | 18 |
| 59021.0 | 17 |
| 59023.0 | 18 |
| 59029.0 | 17 |
| 59051.0 | 18 |
| 59053.0 | 17 |
| 59063.0 | 18 |
| 59069.0 | 17 |
| 59077.0 | 16 |
| 59083.0 | 17 |
| 59093.0 | 16 |
| 59107.0 | 17 |
| 59113.0 | 16 |
| 59119.0 | 17 |
| 59123.0 | 18 |
| 59141.0 | 17 |
| 59149.0 | 16 |
| 59159.0 | 17 |
| 59167.0 | 18 |
| 59183.0 | 19 |
| 59197.0 | 18 |
| 59207.0 | 19 |
| 59209.0 | 18 |
| 59219.0 | 19 |
| 59221.0 | 18 |
| 59233.0 | 17 |
| 59239.0 | 18 |
| 59243.0 | 19 |
| 59263.0 | 20 |
| 59273.0 | 19 |
| 59281.0 | 18 |
| 59333.0 | 17 |
| 59341.0 | 16 |
| 59351.0 | 17 |
| 59357.0 | 16 |
| 59359.0 | 17 |
| 59369.0 | 16 |
| 59377.0 | 15 |
| 59387.0 | 16 |
| 59393.0 | 15 |
| 59399.0 | 16 |
| 59407.0 | 17 |
| 59417.0 | 16 |
| 59419.0 | 17 |
| 59441.0 | 16 |
| 59443.0 | 17 |
| 59447.0 | 18 |
| 59453.0 | 17 |
| 59467.0 | 18 |
| 59471.0 | 19 |
| 59473.0 | 18 |
| 59497.0 | 17 |
| 59509.0 | 16 |
| 59513.0 | 15 |
| 59539.0 | 16 |
| 59557.0 | 15 |
| 59561.0 | 14 |
| 59567.0 | 15 |
| 59581.0 | 14 |
| 59611.0 | 15 |
| 59617.0 | 14 |
| 59621.0 | 13 |
| 59627.0 | 14 |
| 59629.0 | 13 |
| 59651.0 | 14 |
| 59659.0 | 15 |
| 59663.0 | 16 |
| 59669.0 | 15 |
| 59671.0 | 16 |
| 59693.0 | 15 |
| 59699.0 | 16 |
| 59707.0 | 17 |
| 59723.0 | 18 |
| 59729.0 | 17 |
| 59743.0 | 18 |
| 59747.0 | 19 |
| 59753.0 | 18 |
| 59771.0 | 19 |
| 59779.0 | 20 |
| 59791.0 | 21 |
| 59797.0 | 20 |
| 59809.0 | 19 |
| 59833.0 | 18 |
| 59863.0 | 19 |
| 59879.0 | 20 |
| 59887.0 | 21 |
| 59921.0 | 20 |
| 59929.0 | 19 |
| 59951.0 | 20 |
| 59957.0 | 19 |
| 59971.0 | 20 |
| 59981.0 | 19 |
| 59999.0 | 20 |
| 60013.0 | 19 |
| 60017.0 | 18 |
| 60029.0 | 17 |
| 60037.0 | 16 |
| 60041.0 | 15 |
| 60077.0 | 14 |
| 60083.0 | 15 |
| 60089.0 | 14 |
| 60091.0 | 15 |
| 60101.0 | 14 |
| 60103.0 | 15 |
| 60107.0 | 16 |
| 60127.0 | 17 |
| 60133.0 | 16 |
| 60139.0 | 17 |
| 60149.0 | 16 |
| 60161.0 | 15 |
| 60167.0 | 16 |
| 60169.0 | 15 |
| 60209.0 | 14 |
| 60217.0 | 13 |
| 60223.0 | 14 |
| 60251.0 | 15 |
| 60257.0 | 14 |
| 60259.0 | 15 |
| 60271.0 | 16 |
| 60289.0 | 15 |
| 60293.0 | 14 |
| 60317.0 | 13 |
| 60331.0 | 14 |
| 60337.0 | 13 |
| 60343.0 | 14 |
| 60353.0 | 13 |
| 60373.0 | 12 |
| 60383.0 | 13 |
| 60397.0 | 12 |
| 60413.0 | 11 |
| 60427.0 | 12 |
| 60443.0 | 13 |
| 60449.0 | 12 |
| 60457.0 | 11 |
| 60493.0 | 10 |
| 60497.0 | 9 |
| 60509.0 | 8 |
| 60521.0 | 7 |
| 60527.0 | 8 |
| 60539.0 | 9 |
| 60589.0 | 8 |
| 60601.0 | 7 |
| 60607.0 | 8 |
| 60611.0 | 9 |
| 60617.0 | 8 |
| 60623.0 | 9 |
| 60631.0 | 10 |
| 60637.0 | 9 |
| 60647.0 | 10 |
| 60649.0 | 9 |
| 60659.0 | 10 |
| 60661.0 | 9 |
| 60679.0 | 10 |
| 60689.0 | 9 |
| 60703.0 | 10 |
| 60719.0 | 11 |
| 60727.0 | 12 |
| 60733.0 | 11 |
| 60737.0 | 10 |
| 60757.0 | 9 |
| 60761.0 | 8 |
| 60763.0 | 9 |
| 60773.0 | 8 |
| 60779.0 | 9 |
| 60793.0 | 8 |
| 60811.0 | 9 |
| 60821.0 | 8 |
| 60859.0 | 9 |
| 60869.0 | 8 |
| 60887.0 | 9 |
| 60889.0 | 8 |
| 60899.0 | 9 |
| 60901.0 | 8 |
| 60913.0 | 7 |
| 60917.0 | 6 |
| 60919.0 | 7 |
| 60923.0 | 8 |
| 60937.0 | 7 |
| 60943.0 | 8 |
| 60953.0 | 7 |
| 60961.0 | 6 |
| 61001.0 | 5 |
| 61007.0 | 6 |
| 61027.0 | 7 |
| 61031.0 | 8 |
| 61043.0 | 9 |
| 61051.0 | 10 |
| 61057.0 | 9 |
| 61091.0 | 10 |
| 61099.0 | 11 |
| 61121.0 | 10 |
| 61129.0 | 9 |
| 61141.0 | 8 |
| 61151.0 | 9 |
| 61153.0 | 8 |
| 61169.0 | 7 |
| 61211.0 | 8 |
| 61223.0 | 9 |
| 61231.0 | 10 |
| 61253.0 | 9 |
| 61261.0 | 8 |
| 61283.0 | 9 |
| 61291.0 | 10 |
| 61297.0 | 9 |
| 61331.0 | 10 |
| 61333.0 | 9 |
| 61339.0 | 10 |
| 61343.0 | 11 |
| 61357.0 | 10 |
| 61363.0 | 11 |
| 61379.0 | 12 |
| 61381.0 | 11 |
| 61403.0 | 12 |
| 61409.0 | 11 |
| 61417.0 | 10 |
| 61441.0 | 9 |
| 61463.0 | 10 |
| 61469.0 | 9 |
| 61471.0 | 10 |
| 61483.0 | 11 |
| 61487.0 | 12 |
| 61493.0 | 11 |
| 61507.0 | 12 |
| 61511.0 | 13 |
| 61519.0 | 14 |
| 61543.0 | 15 |
| 61547.0 | 16 |
| 61553.0 | 15 |
| 61559.0 | 16 |
| 61561.0 | 15 |
| 61583.0 | 16 |
| 61603.0 | 17 |
| 61609.0 | 16 |
| 61613.0 | 15 |
| 61627.0 | 16 |
| 61631.0 | 17 |
| 61637.0 | 16 |
| 61643.0 | 17 |
| 61651.0 | 18 |
| 61657.0 | 17 |
| 61667.0 | 18 |
| 61673.0 | 17 |
| 61681.0 | 16 |
| 61687.0 | 17 |
| 61703.0 | 18 |
| 61717.0 | 17 |
| 61723.0 | 18 |
| 61729.0 | 17 |
| 61751.0 | 18 |
| 61757.0 | 17 |
| 61781.0 | 16 |
| 61813.0 | 15 |
| 61819.0 | 16 |
| 61837.0 | 15 |
| 61843.0 | 16 |
| 61861.0 | 15 |
| 61871.0 | 16 |
| 61879.0 | 17 |
| 61909.0 | 16 |
| 61927.0 | 17 |
| 61933.0 | 16 |
| 61949.0 | 15 |
| 61961.0 | 14 |
| 61967.0 | 15 |
| 61979.0 | 16 |
| 61981.0 | 15 |
| 61987.0 | 16 |
| 61991.0 | 17 |
| 62003.0 | 18 |
| 62011.0 | 19 |
| 62017.0 | 18 |
| 62039.0 | 19 |
| 62047.0 | 20 |
| 62053.0 | 19 |
| 62057.0 | 18 |
| 62071.0 | 19 |
| 62081.0 | 18 |
| 62099.0 | 19 |
| 62119.0 | 20 |
| 62129.0 | 19 |
| 62131.0 | 20 |
| 62137.0 | 19 |
| 62141.0 | 18 |
| 62143.0 | 19 |
| 62171.0 | 20 |
| 62189.0 | 19 |
| 62191.0 | 20 |
| 62201.0 | 19 |
| 62207.0 | 20 |
| 62213.0 | 19 |
| 62219.0 | 20 |
| 62233.0 | 19 |
| 62273.0 | 18 |
| 62297.0 | 17 |
| 62299.0 | 18 |
| 62303.0 | 19 |
| 62311.0 | 20 |
| 62323.0 | 21 |
| 62327.0 | 22 |
| 62347.0 | 23 |
| 62351.0 | 24 |
| 62383.0 | 25 |
| 62401.0 | 24 |
| 62417.0 | 23 |
| 62423.0 | 24 |
| 62459.0 | 25 |
| 62467.0 | 26 |
| 62473.0 | 25 |
| 62477.0 | 24 |
| 62483.0 | 25 |
| 62497.0 | 24 |
| 62501.0 | 23 |
| 62507.0 | 24 |
| 62533.0 | 23 |
| 62539.0 | 24 |
| 62549.0 | 23 |
| 62563.0 | 24 |
| 62581.0 | 23 |
| 62591.0 | 24 |
| 62597.0 | 23 |
| 62603.0 | 24 |
| 62617.0 | 23 |
| 62627.0 | 24 |
| 62633.0 | 23 |
| 62639.0 | 24 |
| 62653.0 | 23 |
| 62659.0 | 24 |
| 62683.0 | 25 |
| 62687.0 | 26 |
| 62701.0 | 25 |
| 62723.0 | 26 |
| 62731.0 | 27 |
| 62743.0 | 28 |
| 62753.0 | 27 |
| 62761.0 | 26 |
| 62773.0 | 25 |
| 62791.0 | 26 |
| 62801.0 | 25 |
| 62819.0 | 26 |
| 62827.0 | 27 |
| 62851.0 | 28 |
| 62861.0 | 27 |
| 62869.0 | 26 |
| 62873.0 | 25 |
| 62897.0 | 24 |
| 62903.0 | 25 |
| 62921.0 | 24 |
| 62927.0 | 25 |
| 62929.0 | 24 |
| 62939.0 | 25 |
| 62969.0 | 24 |
| 62971.0 | 25 |
| 62981.0 | 24 |
| 62983.0 | 25 |
| 62987.0 | 26 |
| 62989.0 | 25 |
| 63029.0 | 24 |
| 63031.0 | 25 |
| 63059.0 | 26 |
| 63067.0 | 27 |
| 63073.0 | 26 |
| 63079.0 | 27 |
| 63097.0 | 26 |
| 63103.0 | 27 |
| 63113.0 | 26 |
| 63127.0 | 27 |
| 63131.0 | 28 |
| 63149.0 | 27 |
| 63179.0 | 28 |
| 63197.0 | 27 |
| 63199.0 | 28 |
| 63211.0 | 29 |
| 63241.0 | 28 |
| 63247.0 | 29 |
| 63277.0 | 28 |
| 63281.0 | 27 |
| 63299.0 | 28 |
| 63311.0 | 29 |
| 63313.0 | 28 |
| 63317.0 | 27 |
| 63331.0 | 28 |
| 63337.0 | 27 |
| 63347.0 | 28 |
| 63353.0 | 27 |
| 63361.0 | 26 |
| 63367.0 | 27 |
| 63377.0 | 26 |
| 63389.0 | 25 |
| 63391.0 | 26 |
| 63397.0 | 25 |
| 63409.0 | 24 |
| 63419.0 | 25 |
| 63421.0 | 24 |
| 63439.0 | 25 |
| 63443.0 | 26 |
| 63463.0 | 27 |
| 63467.0 | 28 |
| 63473.0 | 27 |
| 63487.0 | 28 |
| 63493.0 | 27 |
| 63499.0 | 28 |
| 63521.0 | 27 |
| 63527.0 | 28 |
| 63533.0 | 27 |
| 63541.0 | 26 |
| 63559.0 | 27 |
| 63577.0 | 26 |
| 63587.0 | 27 |
| 63589.0 | 26 |
| 63599.0 | 27 |
| 63601.0 | 26 |
| 63607.0 | 27 |
| 63611.0 | 28 |
| 63617.0 | 27 |
| 63629.0 | 26 |
| 63647.0 | 27 |
| 63649.0 | 26 |
| 63659.0 | 27 |
| 63667.0 | 28 |
| 63671.0 | 29 |
| 63689.0 | 28 |
| 63691.0 | 29 |
| 63697.0 | 28 |
| 63703.0 | 29 |
| 63709.0 | 28 |
| 63719.0 | 29 |
| 63727.0 | 30 |
| 63737.0 | 29 |
| 63743.0 | 30 |
| 63761.0 | 29 |
| 63773.0 | 28 |
| 63781.0 | 27 |
| 63793.0 | 26 |
| 63799.0 | 27 |
| 63803.0 | 28 |
| 63809.0 | 27 |
| 63823.0 | 28 |
| 63839.0 | 29 |
| 63841.0 | 28 |
| 63853.0 | 27 |
| 63857.0 | 26 |
| 63863.0 | 27 |
| 63901.0 | 26 |
| 63907.0 | 27 |
| 63913.0 | 26 |
| 63929.0 | 25 |
| 63949.0 | 24 |
| 63977.0 | 23 |
| 63997.0 | 22 |
| 64007.0 | 23 |
| 64013.0 | 22 |
| 64019.0 | 23 |
| 64033.0 | 22 |
| 64037.0 | 21 |
| 64063.0 | 22 |
| 64067.0 | 23 |
| 64081.0 | 22 |
| 64091.0 | 23 |
| 64109.0 | 22 |
| 64123.0 | 23 |
| 64151.0 | 24 |
| 64153.0 | 23 |
| 64157.0 | 22 |
| 64171.0 | 23 |
| 64187.0 | 24 |
| 64189.0 | 23 |
| 64217.0 | 22 |
| 64223.0 | 23 |
| 64231.0 | 24 |
| 64237.0 | 23 |
| 64271.0 | 24 |
| 64279.0 | 25 |
| 64283.0 | 26 |
| 64301.0 | 25 |
| 64303.0 | 26 |
| 64319.0 | 27 |
| 64327.0 | 28 |
| 64333.0 | 27 |
| 64373.0 | 26 |
| 64381.0 | 25 |
| 64399.0 | 26 |
| 64403.0 | 27 |
| 64433.0 | 26 |
| 64439.0 | 27 |
| 64451.0 | 28 |
| 64453.0 | 27 |
| 64483.0 | 28 |
| 64489.0 | 27 |
| 64499.0 | 28 |
| 64513.0 | 27 |
| 64553.0 | 26 |
| 64567.0 | 27 |
| 64577.0 | 26 |
| 64579.0 | 27 |
| 64591.0 | 28 |
| 64601.0 | 27 |
| 64609.0 | 26 |
| 64613.0 | 25 |
| 64621.0 | 24 |
| 64627.0 | 25 |
| 64633.0 | 24 |
| 64661.0 | 23 |
| 64663.0 | 24 |
| 64667.0 | 25 |
| 64679.0 | 26 |
| 64693.0 | 25 |
| 64709.0 | 24 |
| 64717.0 | 23 |
| 64747.0 | 24 |
| 64763.0 | 25 |
| 64781.0 | 24 |
| 64783.0 | 25 |
| 64793.0 | 24 |
| 64811.0 | 25 |
| 64817.0 | 24 |
| 64849.0 | 23 |
| 64853.0 | 22 |
| 64871.0 | 23 |
| 64877.0 | 22 |
| 64879.0 | 23 |
| 64891.0 | 24 |
| 64901.0 | 23 |
| 64919.0 | 24 |
| 64921.0 | 23 |
| 64927.0 | 24 |
| 64937.0 | 23 |
| 64951.0 | 24 |
| 64969.0 | 23 |
| 64997.0 | 22 |
| 65003.0 | 23 |
| 65011.0 | 24 |
| 65027.0 | 25 |
| 65029.0 | 24 |
| 65033.0 | 23 |
| 65053.0 | 22 |
| 65063.0 | 23 |
| 65071.0 | 24 |
| 65089.0 | 23 |
| 65099.0 | 24 |
| 65101.0 | 23 |
| 65111.0 | 24 |
| 65119.0 | 25 |
| 65123.0 | 26 |
| 65129.0 | 25 |
| 65141.0 | 24 |
| 65147.0 | 25 |
| 65167.0 | 26 |
| 65171.0 | 27 |
| 65173.0 | 26 |
| 65179.0 | 27 |
| 65183.0 | 28 |
| 65203.0 | 29 |
| 65213.0 | 28 |
| 65239.0 | 29 |
| 65257.0 | 28 |
| 65267.0 | 29 |
| 65269.0 | 28 |
| 65287.0 | 29 |
| 65293.0 | 28 |
| 65309.0 | 27 |
| 65323.0 | 28 |
| 65327.0 | 29 |
| 65353.0 | 28 |
| 65357.0 | 27 |
| 65371.0 | 28 |
| 65381.0 | 27 |
| 65393.0 | 26 |
| 65407.0 | 27 |
| 65413.0 | 26 |
| 65419.0 | 27 |
| 65423.0 | 28 |
| 65437.0 | 27 |
| 65447.0 | 28 |
| 65449.0 | 27 |
| 65479.0 | 28 |
| 65497.0 | 27 |
| 65519.0 | 28 |
| 65521.0 | 27 |
| 65537.0 | 26 |
| 65539.0 | 27 |
| 65543.0 | 28 |
| 65551.0 | 29 |
| 65557.0 | 28 |
| 65563.0 | 29 |
| 65579.0 | 30 |
| 65581.0 | 29 |
| 65587.0 | 30 |
| 65599.0 | 31 |
| 65609.0 | 30 |
| 65617.0 | 29 |
| 65629.0 | 28 |
| 65633.0 | 27 |
| 65647.0 | 28 |
| 65651.0 | 29 |
| 65657.0 | 28 |
| 65677.0 | 27 |
| 65687.0 | 28 |
| 65699.0 | 29 |
| 65701.0 | 28 |
| 65707.0 | 29 |
| 65713.0 | 28 |
| 65717.0 | 27 |
| 65719.0 | 28 |
| 65729.0 | 27 |
| 65731.0 | 28 |
| 65761.0 | 27 |
| 65777.0 | 26 |
| 65789.0 | 25 |
| 65809.0 | 24 |
| 65827.0 | 25 |
| 65831.0 | 26 |
| 65837.0 | 25 |
| 65839.0 | 26 |
| 65843.0 | 27 |
| 65851.0 | 28 |
| 65867.0 | 29 |
| 65881.0 | 28 |
| 65899.0 | 29 |
| 65921.0 | 28 |
| 65927.0 | 29 |
| 65929.0 | 28 |
| 65951.0 | 29 |
| 65957.0 | 28 |
| 65963.0 | 29 |
| 65981.0 | 28 |
| 65983.0 | 29 |
| 65993.0 | 28 |
| 66029.0 | 27 |
| 66037.0 | 26 |
| 66041.0 | 25 |
| 66047.0 | 26 |
| 66067.0 | 27 |
| 66071.0 | 28 |
| 66083.0 | 29 |
| 66089.0 | 28 |
| 66103.0 | 29 |
| 66107.0 | 30 |
| 66109.0 | 29 |
| 66137.0 | 28 |
| 66161.0 | 27 |
| 66169.0 | 26 |
| 66173.0 | 25 |
| 66179.0 | 26 |
| 66191.0 | 27 |
| 66221.0 | 26 |
| 66239.0 | 27 |
| 66271.0 | 28 |
| 66293.0 | 27 |
| 66301.0 | 26 |
| 66337.0 | 25 |
| 66343.0 | 26 |
| 66347.0 | 27 |
| 66359.0 | 28 |
| 66361.0 | 27 |
| 66373.0 | 26 |
| 66377.0 | 25 |
| 66383.0 | 26 |
| 66403.0 | 27 |
| 66413.0 | 26 |
| 66431.0 | 27 |
| 66449.0 | 26 |
| 66457.0 | 25 |
| 66463.0 | 26 |
| 66467.0 | 27 |
| 66491.0 | 28 |
| 66499.0 | 29 |
| 66509.0 | 28 |
| 66523.0 | 29 |
| 66529.0 | 28 |
| 66533.0 | 27 |
| 66541.0 | 26 |
| 66553.0 | 25 |
| 66569.0 | 24 |
| 66571.0 | 25 |
| 66587.0 | 26 |
| 66593.0 | 25 |
| 66601.0 | 24 |
| 66617.0 | 23 |
| 66629.0 | 22 |
| 66643.0 | 23 |
| 66653.0 | 22 |
| 66683.0 | 23 |
| 66697.0 | 22 |
| 66701.0 | 21 |
| 66713.0 | 20 |
| 66721.0 | 19 |
| 66733.0 | 18 |
| 66739.0 | 19 |
| 66749.0 | 18 |
| 66751.0 | 19 |
| 66763.0 | 20 |
| 66791.0 | 21 |
| 66797.0 | 20 |
| 66809.0 | 19 |
| 66821.0 | 18 |
| 66841.0 | 17 |
| 66851.0 | 18 |
| 66853.0 | 17 |
| 66863.0 | 18 |
| 66877.0 | 17 |
| 66883.0 | 18 |
| 66889.0 | 17 |
| 66919.0 | 18 |
| 66923.0 | 19 |
| 66931.0 | 20 |
| 66943.0 | 21 |
| 66947.0 | 22 |
| 66949.0 | 21 |
| 66959.0 | 22 |
| 66973.0 | 21 |
| 66977.0 | 20 |
| 67003.0 | 21 |
| 67021.0 | 20 |
| 67033.0 | 19 |
| 67043.0 | 20 |
| 67049.0 | 19 |
| 67057.0 | 18 |
| 67061.0 | 17 |
| 67073.0 | 16 |
| 67079.0 | 17 |
| 67103.0 | 18 |
| 67121.0 | 17 |
| 67129.0 | 16 |
| 67139.0 | 17 |
| 67141.0 | 16 |
| 67153.0 | 15 |
| 67157.0 | 14 |
| 67169.0 | 13 |
| 67181.0 | 12 |
| 67187.0 | 13 |
| 67189.0 | 12 |
| 67211.0 | 13 |
| 67213.0 | 12 |
| 67217.0 | 11 |
| 67219.0 | 12 |
| 67231.0 | 13 |
| 67247.0 | 14 |
| 67261.0 | 13 |
| 67271.0 | 14 |
| 67273.0 | 13 |
| 67289.0 | 12 |
| 67307.0 | 13 |
| 67339.0 | 14 |
| 67343.0 | 15 |
| 67349.0 | 14 |
| 67369.0 | 13 |
| 67391.0 | 14 |
| 67399.0 | 15 |
| 67409.0 | 14 |
| 67411.0 | 15 |
| 67421.0 | 14 |
| 67427.0 | 15 |
| 67429.0 | 14 |
| 67433.0 | 13 |
| 67447.0 | 14 |
| 67453.0 | 13 |
| 67477.0 | 12 |
| 67481.0 | 11 |
| 67489.0 | 10 |
| 67493.0 | 9 |
| 67499.0 | 10 |
| 67511.0 | 11 |
| 67523.0 | 12 |
| 67531.0 | 13 |
| 67537.0 | 12 |
| 67547.0 | 13 |
| 67559.0 | 14 |
| 67567.0 | 15 |
| 67577.0 | 14 |
| 67579.0 | 15 |
| 67589.0 | 14 |
| 67601.0 | 13 |
| 67607.0 | 14 |
| 67619.0 | 15 |
| 67631.0 | 16 |
| 67651.0 | 17 |
| 67679.0 | 18 |
| 67699.0 | 19 |
| 67709.0 | 18 |
| 67723.0 | 19 |
| 67733.0 | 18 |
| 67741.0 | 17 |
| 67751.0 | 18 |
| 67757.0 | 17 |
| 67759.0 | 18 |
| 67763.0 | 19 |
| 67777.0 | 18 |
| 67783.0 | 19 |
| 67789.0 | 18 |
| 67801.0 | 17 |
| 67807.0 | 18 |
| 67819.0 | 19 |
| 67829.0 | 18 |
| 67843.0 | 19 |
| 67853.0 | 18 |
| 67867.0 | 19 |
| 67883.0 | 20 |
| 67891.0 | 21 |
| 67901.0 | 20 |
| 67927.0 | 21 |
| 67931.0 | 22 |
| 67933.0 | 21 |
| 67939.0 | 22 |
| 67943.0 | 23 |
| 67957.0 | 22 |
| 67961.0 | 21 |
| 67967.0 | 22 |
| 67979.0 | 23 |
| 67987.0 | 24 |
| 67993.0 | 23 |
| 68023.0 | 24 |
| 68041.0 | 23 |
| 68053.0 | 22 |
| 68059.0 | 23 |
| 68071.0 | 24 |
| 68087.0 | 25 |
| 68099.0 | 26 |
| 68111.0 | 27 |
| 68113.0 | 26 |
| 68141.0 | 25 |
| 68147.0 | 26 |
| 68161.0 | 25 |
| 68171.0 | 26 |
| 68207.0 | 27 |
| 68209.0 | 26 |
| 68213.0 | 25 |
| 68219.0 | 26 |
| 68227.0 | 27 |
| 68239.0 | 28 |
| 68261.0 | 27 |
| 68279.0 | 28 |
| 68281.0 | 27 |
| 68311.0 | 28 |
| 68329.0 | 27 |
| 68351.0 | 28 |
| 68371.0 | 29 |
| 68389.0 | 28 |
| 68399.0 | 29 |
| 68437.0 | 28 |
| 68443.0 | 29 |
| 68447.0 | 30 |
| 68449.0 | 29 |
| 68473.0 | 28 |
| 68477.0 | 27 |
| 68483.0 | 28 |
| 68489.0 | 27 |
| 68491.0 | 28 |
| 68501.0 | 27 |
| 68507.0 | 28 |
| 68521.0 | 27 |
| 68531.0 | 28 |
| 68539.0 | 29 |
| 68543.0 | 30 |
| 68567.0 | 31 |
| 68581.0 | 30 |
| 68597.0 | 29 |
| 68611.0 | 30 |
| 68633.0 | 29 |
| 68639.0 | 30 |
| 68659.0 | 31 |
| 68669.0 | 30 |
| 68683.0 | 31 |
| 68687.0 | 32 |
| 68699.0 | 33 |
| 68711.0 | 34 |
| 68713.0 | 33 |
| 68729.0 | 32 |
| 68737.0 | 31 |
| 68743.0 | 32 |
| 68749.0 | 31 |
| 68767.0 | 32 |
| 68771.0 | 33 |
| 68777.0 | 32 |
| 68791.0 | 33 |
| 68813.0 | 32 |
| 68819.0 | 33 |
| 68821.0 | 32 |
| 68863.0 | 33 |
| 68879.0 | 34 |
| 68881.0 | 33 |
| 68891.0 | 34 |
| 68897.0 | 33 |
| 68899.0 | 34 |
| 68903.0 | 35 |
| 68909.0 | 34 |
| 68917.0 | 33 |
| 68927.0 | 34 |
| 68947.0 | 35 |
| 68963.0 | 36 |
| 68993.0 | 35 |
| 69001.0 | 34 |
| 69011.0 | 35 |
| 69019.0 | 36 |
| 69029.0 | 35 |
| 69031.0 | 36 |
| 69061.0 | 35 |
| 69067.0 | 36 |
| 69073.0 | 35 |
| 69109.0 | 34 |
| 69119.0 | 35 |
| 69127.0 | 36 |
| 69143.0 | 37 |
| 69149.0 | 36 |
| 69151.0 | 37 |
| 69163.0 | 38 |
| 69191.0 | 39 |
| 69193.0 | 38 |
| 69197.0 | 37 |
| 69203.0 | 38 |
| 69221.0 | 37 |
| 69233.0 | 36 |
| 69239.0 | 37 |
| 69247.0 | 38 |
| 69257.0 | 37 |
| 69259.0 | 38 |
| 69263.0 | 39 |
| 69313.0 | 38 |
| 69317.0 | 37 |
| 69337.0 | 36 |
| 69341.0 | 35 |
| 69371.0 | 36 |
| 69379.0 | 37 |
| 69383.0 | 38 |
| 69389.0 | 37 |
| 69401.0 | 36 |
| 69403.0 | 37 |
| 69427.0 | 38 |
| 69431.0 | 39 |
| 69439.0 | 40 |
| 69457.0 | 39 |
| 69463.0 | 40 |
| 69467.0 | 41 |
| 69473.0 | 40 |
| 69481.0 | 39 |
| 69491.0 | 40 |
| 69493.0 | 39 |
| 69497.0 | 38 |
| 69499.0 | 39 |
| 69539.0 | 40 |
| 69557.0 | 39 |
| 69593.0 | 38 |
| 69623.0 | 39 |
| 69653.0 | 38 |
| 69661.0 | 37 |
| 69677.0 | 36 |
| 69691.0 | 37 |
| 69697.0 | 36 |
| 69709.0 | 35 |
| 69737.0 | 34 |
| 69739.0 | 35 |
| 69761.0 | 34 |
| 69763.0 | 35 |
| 69767.0 | 36 |
| 69779.0 | 37 |
| 69809.0 | 36 |
| 69821.0 | 35 |
| 69827.0 | 36 |
| 69829.0 | 35 |
| 69833.0 | 34 |
| 69847.0 | 35 |
| 69857.0 | 34 |
| 69859.0 | 35 |
| 69877.0 | 34 |
| 69899.0 | 35 |
| 69911.0 | 36 |
| 69929.0 | 35 |
| 69931.0 | 36 |
| 69941.0 | 35 |
| 69959.0 | 36 |
| 69991.0 | 37 |
| 69997.0 | 36 |
| 70001.0 | 35 |
| 70003.0 | 36 |
| 70009.0 | 35 |
| 70019.0 | 36 |
| 70039.0 | 37 |
| 70051.0 | 38 |
| 70061.0 | 37 |
| 70067.0 | 38 |
| 70079.0 | 39 |
| 70099.0 | 40 |
| 70111.0 | 41 |
| 70117.0 | 40 |
| 70121.0 | 39 |
| 70123.0 | 40 |
| 70139.0 | 41 |
| 70141.0 | 40 |
| 70157.0 | 39 |
| 70163.0 | 40 |
| 70177.0 | 39 |
| 70181.0 | 38 |
| 70183.0 | 39 |
| 70199.0 | 40 |
| 70201.0 | 39 |
| 70207.0 | 40 |
| 70223.0 | 41 |
| 70229.0 | 40 |
| 70237.0 | 39 |
| 70241.0 | 38 |
| 70249.0 | 37 |
| 70271.0 | 38 |
| 70289.0 | 37 |
| 70297.0 | 36 |
| 70309.0 | 35 |
| 70313.0 | 34 |
| 70321.0 | 33 |
| 70327.0 | 34 |
| 70351.0 | 35 |
| 70373.0 | 34 |
| 70379.0 | 35 |
| 70381.0 | 34 |
| 70393.0 | 33 |
| 70423.0 | 34 |
| 70429.0 | 33 |
| 70439.0 | 34 |
| 70451.0 | 35 |
| 70457.0 | 34 |
| 70459.0 | 35 |
| 70481.0 | 34 |
| 70487.0 | 35 |
| 70489.0 | 34 |
| 70501.0 | 33 |
| 70507.0 | 34 |
| 70529.0 | 33 |
| 70537.0 | 32 |
| 70549.0 | 31 |
| 70571.0 | 32 |
| 70573.0 | 31 |
| 70583.0 | 32 |
| 70589.0 | 31 |
| 70607.0 | 32 |
| 70619.0 | 33 |
| 70621.0 | 32 |
| 70627.0 | 33 |
| 70639.0 | 34 |
| 70657.0 | 33 |
| 70663.0 | 34 |
| 70667.0 | 35 |
| 70687.0 | 36 |
| 70709.0 | 35 |
| 70717.0 | 34 |
| 70729.0 | 33 |
| 70753.0 | 32 |
| 70769.0 | 31 |
| 70783.0 | 32 |
| 70793.0 | 31 |
| 70823.0 | 32 |
| 70841.0 | 31 |
| 70843.0 | 32 |
| 70849.0 | 31 |
| 70853.0 | 30 |
| 70867.0 | 31 |
| 70877.0 | 30 |
| 70879.0 | 31 |
| 70891.0 | 32 |
| 70901.0 | 31 |
| 70913.0 | 30 |
| 70919.0 | 31 |
| 70921.0 | 30 |
| 70937.0 | 29 |
| 70949.0 | 28 |
| 70951.0 | 29 |
| 70957.0 | 28 |
| 70969.0 | 27 |
| 70979.0 | 28 |
| 70981.0 | 27 |
| 70991.0 | 28 |
| 70997.0 | 27 |
| 70999.0 | 28 |
| 71011.0 | 29 |
| 71023.0 | 30 |
| 71039.0 | 31 |
| 71059.0 | 32 |
| 71069.0 | 31 |
| 71081.0 | 30 |
| 71089.0 | 29 |
| 71119.0 | 30 |
| 71129.0 | 29 |
| 71143.0 | 30 |
| 71147.0 | 31 |
| 71153.0 | 30 |
| 71161.0 | 29 |
| 71167.0 | 30 |
| 71171.0 | 31 |
| 71191.0 | 32 |
| 71209.0 | 31 |
| 71233.0 | 30 |
| 71237.0 | 29 |
| 71249.0 | 28 |
| 71257.0 | 27 |
| 71261.0 | 26 |
| 71263.0 | 27 |
| 71287.0 | 28 |
| 71293.0 | 27 |
| 71317.0 | 26 |
| 71327.0 | 27 |
| 71329.0 | 26 |
| 71333.0 | 25 |
| 71339.0 | 26 |
| 71341.0 | 25 |
| 71347.0 | 26 |
| 71353.0 | 25 |
| 71359.0 | 26 |
| 71363.0 | 27 |
| 71387.0 | 28 |
| 71389.0 | 27 |
| 71399.0 | 28 |
| 71411.0 | 29 |
| 71413.0 | 28 |
| 71419.0 | 29 |
| 71429.0 | 28 |
| 71437.0 | 27 |
| 71443.0 | 28 |
| 71453.0 | 27 |
| 71471.0 | 28 |
| 71473.0 | 27 |
| 71479.0 | 28 |
| 71483.0 | 29 |
| 71503.0 | 30 |
| 71527.0 | 31 |
| 71537.0 | 30 |
| 71549.0 | 29 |
| 71551.0 | 30 |
| 71563.0 | 31 |
| 71569.0 | 30 |
| 71593.0 | 29 |
| 71597.0 | 28 |
| 71633.0 | 27 |
| 71647.0 | 28 |
| 71663.0 | 29 |
| 71671.0 | 30 |
| 71693.0 | 29 |
| 71699.0 | 30 |
| 71707.0 | 31 |
| 71711.0 | 32 |
| 71713.0 | 31 |
| 71719.0 | 32 |
| 71741.0 | 31 |
| 71761.0 | 30 |
| 71777.0 | 29 |
| 71789.0 | 28 |
| 71807.0 | 29 |
| 71809.0 | 28 |
| 71821.0 | 27 |
| 71837.0 | 26 |
| 71843.0 | 27 |
| 71849.0 | 26 |
| 71861.0 | 25 |
| 71867.0 | 26 |
| 71879.0 | 27 |
| 71881.0 | 26 |
| 71887.0 | 27 |
| 71899.0 | 28 |
| 71909.0 | 27 |
| 71917.0 | 26 |
| 71933.0 | 25 |
| 71941.0 | 24 |
| 71947.0 | 25 |
| 71963.0 | 26 |
| 71971.0 | 27 |
| 71983.0 | 28 |
| 71987.0 | 29 |
| 71993.0 | 28 |
| 71999.0 | 29 |
| 72019.0 | 30 |
| 72031.0 | 31 |
| 72043.0 | 32 |
| 72047.0 | 33 |
| 72053.0 | 32 |
| 72073.0 | 31 |
| 72077.0 | 30 |
| 72089.0 | 29 |
| 72091.0 | 30 |
| 72101.0 | 29 |
| 72103.0 | 30 |
| 72109.0 | 29 |
| 72139.0 | 30 |
| 72161.0 | 29 |
| 72167.0 | 30 |
| 72169.0 | 29 |
| 72173.0 | 28 |
| 72211.0 | 29 |
| 72221.0 | 28 |
| 72223.0 | 29 |
| 72227.0 | 30 |
| 72229.0 | 29 |
| 72251.0 | 30 |
| 72253.0 | 29 |
| 72269.0 | 28 |
| 72271.0 | 29 |
| 72277.0 | 28 |
| 72287.0 | 29 |
| 72307.0 | 30 |
| 72313.0 | 29 |
| 72337.0 | 28 |
| 72341.0 | 27 |
| 72353.0 | 26 |
| 72367.0 | 27 |
| 72379.0 | 28 |
| 72383.0 | 29 |
| 72421.0 | 28 |
| 72431.0 | 29 |
| 72461.0 | 28 |
| 72467.0 | 29 |
| 72469.0 | 28 |
| 72481.0 | 27 |
| 72493.0 | 26 |
| 72497.0 | 25 |
| 72503.0 | 26 |
| 72533.0 | 25 |
| 72547.0 | 26 |
| 72551.0 | 27 |
| 72559.0 | 28 |
| 72577.0 | 27 |
| 72613.0 | 26 |
| 72617.0 | 25 |
| 72623.0 | 26 |
| 72643.0 | 27 |
| 72647.0 | 28 |
| 72649.0 | 27 |
| 72661.0 | 26 |
| 72671.0 | 27 |
| 72673.0 | 26 |
| 72679.0 | 27 |
| 72689.0 | 26 |
| 72701.0 | 25 |
| 72707.0 | 26 |
| 72719.0 | 27 |
| 72727.0 | 28 |
| 72733.0 | 27 |
| 72739.0 | 28 |
| 72763.0 | 29 |
| 72767.0 | 30 |
| 72797.0 | 29 |
| 72817.0 | 28 |
| 72823.0 | 29 |
| 72859.0 | 30 |
| 72869.0 | 29 |
| 72871.0 | 30 |
| 72883.0 | 31 |
| 72889.0 | 30 |
| 72893.0 | 29 |
| 72901.0 | 28 |
| 72907.0 | 29 |
| 72911.0 | 30 |
| 72923.0 | 31 |
| 72931.0 | 32 |
| 72937.0 | 31 |
| 72949.0 | 30 |
| 72953.0 | 29 |
| 72959.0 | 30 |
| 72973.0 | 29 |
| 72977.0 | 28 |
| 72997.0 | 27 |
| 73009.0 | 26 |
| 73013.0 | 25 |
| 73019.0 | 26 |
| 73037.0 | 25 |
| 73039.0 | 26 |
| 73043.0 | 27 |
| 73061.0 | 26 |
| 73063.0 | 27 |
| 73079.0 | 28 |
| 73091.0 | 29 |
| 73121.0 | 28 |
| 73127.0 | 29 |
| 73133.0 | 28 |
| 73141.0 | 27 |
| 73181.0 | 26 |
| 73189.0 | 25 |
| 73237.0 | 24 |
| 73243.0 | 25 |
| 73259.0 | 26 |
| 73277.0 | 25 |
| 73291.0 | 26 |
| 73303.0 | 27 |
| 73309.0 | 26 |
| 73327.0 | 27 |
| 73331.0 | 28 |
| 73351.0 | 29 |
| 73361.0 | 28 |
| 73363.0 | 29 |
| 73369.0 | 28 |
| 73379.0 | 29 |
| 73387.0 | 30 |
| 73417.0 | 29 |
| 73421.0 | 28 |
| 73433.0 | 27 |
| 73453.0 | 26 |
| 73459.0 | 27 |
| 73471.0 | 28 |
| 73477.0 | 27 |
| 73483.0 | 28 |
| 73517.0 | 27 |
| 73523.0 | 28 |
| 73529.0 | 27 |
| 73547.0 | 28 |
| 73553.0 | 27 |
| 73561.0 | 26 |
| 73571.0 | 27 |
| 73583.0 | 28 |
| 73589.0 | 27 |
| 73597.0 | 26 |
| 73607.0 | 27 |
| 73609.0 | 26 |
| 73613.0 | 25 |
| 73637.0 | 24 |
| 73643.0 | 25 |
| 73651.0 | 26 |
| 73673.0 | 25 |
| 73679.0 | 26 |
| 73681.0 | 25 |
| 73693.0 | 24 |
| 73699.0 | 25 |
| 73709.0 | 24 |
| 73721.0 | 23 |
| 73727.0 | 24 |
| 73751.0 | 25 |
| 73757.0 | 24 |
| 73771.0 | 25 |
| 73783.0 | 26 |
| 73819.0 | 27 |
| 73823.0 | 28 |
| 73847.0 | 29 |
| 73849.0 | 28 |
| 73859.0 | 29 |
| 73867.0 | 30 |
| 73877.0 | 29 |
| 73883.0 | 30 |
| 73897.0 | 29 |
| 73907.0 | 30 |
| 73939.0 | 31 |
| 73943.0 | 32 |
| 73951.0 | 33 |
| 73961.0 | 32 |
| 73973.0 | 31 |
| 73999.0 | 32 |
| 74017.0 | 31 |
| 74021.0 | 30 |
| 74027.0 | 31 |
| 74047.0 | 32 |
| 74051.0 | 33 |
| 74071.0 | 34 |
| 74077.0 | 33 |
| 74093.0 | 32 |
| 74099.0 | 33 |
| 74101.0 | 32 |
| 74131.0 | 33 |
| 74143.0 | 34 |
| 74149.0 | 33 |
| 74159.0 | 34 |
| 74161.0 | 33 |
| 74167.0 | 34 |
| 74177.0 | 33 |
| 74189.0 | 32 |
| 74197.0 | 31 |
| 74201.0 | 30 |
| 74203.0 | 31 |
| 74209.0 | 30 |
| 74219.0 | 31 |
| 74231.0 | 32 |
| 74257.0 | 31 |
| 74279.0 | 32 |
| 74287.0 | 33 |
| 74293.0 | 32 |
| 74297.0 | 31 |
| 74311.0 | 32 |
| 74317.0 | 31 |
| 74323.0 | 32 |
| 74353.0 | 31 |
| 74357.0 | 30 |
| 74363.0 | 31 |
| 74377.0 | 30 |
| 74381.0 | 29 |
| 74383.0 | 30 |
| 74411.0 | 31 |
| 74413.0 | 30 |
| 74419.0 | 31 |
| 74441.0 | 30 |
| 74449.0 | 29 |
| 74453.0 | 28 |
| 74471.0 | 29 |
| 74489.0 | 28 |
| 74507.0 | 29 |
| 74509.0 | 28 |
| 74521.0 | 27 |
| 74527.0 | 28 |
| 74531.0 | 29 |
| 74551.0 | 30 |
| 74561.0 | 29 |
| 74567.0 | 30 |
| 74573.0 | 29 |
| 74587.0 | 30 |
| 74597.0 | 29 |
| 74609.0 | 28 |
| 74611.0 | 29 |
| 74623.0 | 30 |
| 74653.0 | 29 |
| 74687.0 | 30 |
| 74699.0 | 31 |
| 74707.0 | 32 |
| 74713.0 | 31 |
| 74717.0 | 30 |
| 74719.0 | 31 |
| 74729.0 | 30 |
| 74731.0 | 31 |
| 74747.0 | 32 |
| 74759.0 | 33 |
| 74761.0 | 32 |
| 74771.0 | 33 |
| 74779.0 | 34 |
| 74797.0 | 33 |
| 74821.0 | 32 |
| 74827.0 | 33 |
| 74831.0 | 34 |
| 74843.0 | 35 |
| 74857.0 | 34 |
| 74861.0 | 33 |
| 74869.0 | 32 |
| 74873.0 | 31 |
| 74887.0 | 32 |
| 74891.0 | 33 |
| 74897.0 | 32 |
| 74903.0 | 33 |
| 74923.0 | 34 |
| 74929.0 | 33 |
| 74933.0 | 32 |
| 74941.0 | 31 |
| 74959.0 | 32 |
| 75011.0 | 33 |
| 75013.0 | 32 |
| 75017.0 | 31 |
| 75029.0 | 30 |
| 75037.0 | 29 |
| 75041.0 | 28 |
| 75079.0 | 29 |
| 75083.0 | 30 |
| 75109.0 | 29 |
| 75133.0 | 28 |
| 75149.0 | 27 |
| 75161.0 | 26 |
| 75167.0 | 27 |
| 75169.0 | 26 |
| 75181.0 | 25 |
| 75193.0 | 24 |
| 75209.0 | 23 |
| 75211.0 | 24 |
| 75217.0 | 23 |
| 75223.0 | 24 |
| 75227.0 | 25 |
| 75239.0 | 26 |
| 75253.0 | 25 |
| 75269.0 | 24 |
| 75277.0 | 23 |
| 75289.0 | 22 |
| 75307.0 | 23 |
| 75323.0 | 24 |
| 75329.0 | 23 |
| 75337.0 | 22 |
| 75347.0 | 23 |
| 75353.0 | 22 |
| 75367.0 | 23 |
| 75377.0 | 22 |
| 75389.0 | 21 |
| 75391.0 | 22 |
| 75401.0 | 21 |
| 75403.0 | 22 |
| 75407.0 | 23 |
| 75431.0 | 24 |
| 75437.0 | 23 |
| 75479.0 | 24 |
| 75503.0 | 25 |
| 75511.0 | 26 |
| 75521.0 | 25 |
| 75527.0 | 26 |
| 75533.0 | 25 |
| 75539.0 | 26 |
| 75541.0 | 25 |
| 75553.0 | 24 |
| 75557.0 | 23 |
| 75571.0 | 24 |
| 75577.0 | 23 |
| 75583.0 | 24 |
| 75611.0 | 25 |
| 75617.0 | 24 |
| 75619.0 | 25 |
| 75629.0 | 24 |
| 75641.0 | 23 |
| 75653.0 | 22 |
| 75659.0 | 23 |
| 75679.0 | 24 |
| 75683.0 | 25 |
| 75689.0 | 24 |
| 75703.0 | 25 |
| 75707.0 | 26 |
| 75709.0 | 25 |
| 75721.0 | 24 |
| 75731.0 | 25 |
| 75743.0 | 26 |
| 75767.0 | 27 |
| 75773.0 | 26 |
| 75781.0 | 25 |
| 75787.0 | 26 |
| 75793.0 | 25 |
| 75797.0 | 24 |
| 75821.0 | 23 |
| 75833.0 | 22 |
| 75853.0 | 21 |
| 75869.0 | 20 |
| 75883.0 | 21 |
| 75913.0 | 20 |
| 75931.0 | 21 |
| 75937.0 | 20 |
| 75941.0 | 19 |
| 75967.0 | 20 |
| 75979.0 | 21 |
| 75983.0 | 22 |
| 75989.0 | 21 |
| 75991.0 | 22 |
| 75997.0 | 21 |
| 76001.0 | 20 |
| 76003.0 | 21 |
| 76031.0 | 22 |
| 76039.0 | 23 |
| 76079.0 | 24 |
| 76081.0 | 23 |
| 76091.0 | 24 |
| 76099.0 | 25 |
| 76103.0 | 26 |
| 76123.0 | 27 |
| 76129.0 | 26 |
| 76147.0 | 27 |
| 76157.0 | 26 |
| 76159.0 | 27 |
| 76163.0 | 28 |
| 76207.0 | 29 |
| 76213.0 | 28 |
| 76231.0 | 29 |
| 76243.0 | 30 |
| 76249.0 | 29 |
| 76253.0 | 28 |
| 76259.0 | 29 |
| 76261.0 | 28 |
| 76283.0 | 29 |
| 76289.0 | 28 |
| 76303.0 | 29 |
| 76333.0 | 28 |
| 76343.0 | 29 |
| 76367.0 | 30 |
| 76369.0 | 29 |
| 76379.0 | 30 |
| 76387.0 | 31 |
| 76403.0 | 32 |
| 76421.0 | 31 |
| 76423.0 | 32 |
| 76441.0 | 31 |
| 76463.0 | 32 |
| 76471.0 | 33 |
| 76481.0 | 32 |
| 76487.0 | 33 |
| 76493.0 | 32 |
| 76507.0 | 33 |
| 76511.0 | 34 |
| 76519.0 | 35 |
| 76537.0 | 34 |
| 76541.0 | 33 |
| 76543.0 | 34 |
| 76561.0 | 33 |
| 76579.0 | 34 |
| 76597.0 | 33 |
| 76603.0 | 34 |
| 76607.0 | 35 |
| 76631.0 | 36 |
| 76649.0 | 35 |
| 76651.0 | 36 |
| 76667.0 | 37 |
| 76673.0 | 36 |
| 76679.0 | 37 |
| 76697.0 | 36 |
| 76717.0 | 35 |
| 76733.0 | 34 |
| 76753.0 | 33 |
| 76757.0 | 32 |
| 76771.0 | 33 |
| 76777.0 | 32 |
| 76781.0 | 31 |
| 76801.0 | 30 |
| 76819.0 | 31 |
| 76829.0 | 30 |
| 76831.0 | 31 |
| 76837.0 | 30 |
| 76847.0 | 31 |
| 76871.0 | 32 |
| 76873.0 | 31 |
| 76883.0 | 32 |
| 76907.0 | 33 |
| 76913.0 | 32 |
| 76919.0 | 33 |
| 76943.0 | 34 |
| 76949.0 | 33 |
| 76961.0 | 32 |
| 76963.0 | 33 |
| 76991.0 | 34 |
| 77003.0 | 35 |
| 77017.0 | 34 |
| 77023.0 | 35 |
| 77029.0 | 34 |
| 77041.0 | 33 |
| 77047.0 | 34 |
| 77069.0 | 33 |
| 77081.0 | 32 |
| 77093.0 | 31 |
| 77101.0 | 30 |
| 77137.0 | 29 |
| 77141.0 | 28 |
| 77153.0 | 27 |
| 77167.0 | 28 |
| 77171.0 | 29 |
| 77191.0 | 30 |
| 77201.0 | 29 |
| 77213.0 | 28 |
| 77237.0 | 27 |
| 77239.0 | 28 |
| 77243.0 | 29 |
| 77249.0 | 28 |
| 77261.0 | 27 |
| 77263.0 | 28 |
| 77267.0 | 29 |
| 77269.0 | 28 |
| 77279.0 | 29 |
| 77291.0 | 30 |
| 77317.0 | 29 |
| 77323.0 | 30 |
| 77339.0 | 31 |
| 77347.0 | 32 |
| 77351.0 | 33 |
| 77359.0 | 34 |
| 77369.0 | 33 |
| 77377.0 | 32 |
| 77383.0 | 33 |
| 77417.0 | 32 |
| 77419.0 | 33 |
| 77431.0 | 34 |
| 77447.0 | 35 |
| 77471.0 | 36 |
| 77477.0 | 35 |
| 77479.0 | 36 |
| 77489.0 | 35 |
| 77491.0 | 36 |
| 77509.0 | 35 |
| 77513.0 | 34 |
| 77521.0 | 33 |
| 77527.0 | 34 |
| 77543.0 | 35 |
| 77549.0 | 34 |
| 77551.0 | 35 |
| 77557.0 | 34 |
| 77563.0 | 35 |
| 77569.0 | 34 |
| 77573.0 | 33 |
| 77587.0 | 34 |
| 77591.0 | 35 |
| 77611.0 | 36 |
| 77617.0 | 35 |
| 77621.0 | 34 |
| 77641.0 | 33 |
| 77647.0 | 34 |
| 77659.0 | 35 |
| 77681.0 | 34 |
| 77687.0 | 35 |
| 77689.0 | 34 |
| 77699.0 | 35 |
| 77711.0 | 36 |
| 77713.0 | 35 |
| 77719.0 | 36 |
| 77723.0 | 37 |
| 77731.0 | 38 |
| 77743.0 | 39 |
| 77747.0 | 40 |
| 77761.0 | 39 |
| 77773.0 | 38 |
| 77783.0 | 39 |
| 77797.0 | 38 |
| 77801.0 | 37 |
| 77813.0 | 36 |
| 77839.0 | 37 |
| 77849.0 | 36 |
| 77863.0 | 37 |
| 77867.0 | 38 |
| 77893.0 | 37 |
| 77899.0 | 38 |
| 77929.0 | 37 |
| 77933.0 | 36 |
| 77951.0 | 37 |
| 77969.0 | 36 |
| 77977.0 | 35 |
| 77983.0 | 36 |
| 77999.0 | 37 |
| 78007.0 | 38 |
| 78017.0 | 37 |
| 78031.0 | 38 |
| 78041.0 | 37 |
| 78049.0 | 36 |
| 78059.0 | 37 |
| 78079.0 | 38 |
| 78101.0 | 37 |
| 78121.0 | 36 |
| 78137.0 | 35 |
| 78139.0 | 36 |
| 78157.0 | 35 |
| 78163.0 | 36 |
| 78167.0 | 37 |
| 78173.0 | 36 |
| 78179.0 | 37 |
| 78191.0 | 38 |
| 78193.0 | 37 |
| 78203.0 | 38 |
| 78229.0 | 37 |
| 78233.0 | 36 |
| 78241.0 | 35 |
| 78259.0 | 36 |
| 78277.0 | 35 |
| 78283.0 | 36 |
| 78301.0 | 35 |
| 78307.0 | 36 |
| 78311.0 | 37 |
| 78317.0 | 36 |
| 78341.0 | 35 |
| 78347.0 | 36 |
| 78367.0 | 37 |
| 78401.0 | 36 |
| 78427.0 | 37 |
| 78437.0 | 36 |
| 78439.0 | 37 |
| 78467.0 | 38 |
| 78479.0 | 39 |
| 78487.0 | 40 |
| 78497.0 | 39 |
| 78509.0 | 38 |
| 78511.0 | 39 |
| 78517.0 | 38 |
| 78539.0 | 39 |
| 78541.0 | 38 |
| 78553.0 | 37 |
| 78569.0 | 36 |
| 78571.0 | 37 |
| 78577.0 | 36 |
| 78583.0 | 37 |
| 78593.0 | 36 |
| 78607.0 | 37 |
| 78623.0 | 38 |
| 78643.0 | 39 |
| 78649.0 | 38 |
| 78653.0 | 37 |
| 78691.0 | 38 |
| 78697.0 | 37 |
| 78707.0 | 38 |
| 78713.0 | 37 |
| 78721.0 | 36 |
| 78737.0 | 35 |
| 78779.0 | 36 |
| 78781.0 | 35 |
| 78787.0 | 36 |
| 78791.0 | 37 |
| 78797.0 | 36 |
| 78803.0 | 37 |
| 78809.0 | 36 |
| 78823.0 | 37 |
| 78839.0 | 38 |
| 78853.0 | 37 |
| 78857.0 | 36 |
| 78877.0 | 35 |
| 78887.0 | 36 |
| 78889.0 | 35 |
| 78893.0 | 34 |
| 78901.0 | 33 |
| 78919.0 | 34 |
| 78929.0 | 33 |
| 78941.0 | 32 |
| 78977.0 | 31 |
| 78979.0 | 32 |
| 78989.0 | 31 |
| 79031.0 | 32 |
| 79039.0 | 33 |
| 79043.0 | 34 |
| 79063.0 | 35 |
| 79087.0 | 36 |
| 79103.0 | 37 |
| 79111.0 | 38 |
| 79133.0 | 37 |
| 79139.0 | 38 |
| 79147.0 | 39 |
| 79151.0 | 40 |
| 79153.0 | 39 |
| 79159.0 | 40 |
| 79181.0 | 39 |
| 79187.0 | 40 |
| 79193.0 | 39 |
| 79201.0 | 38 |
| 79229.0 | 37 |
| 79231.0 | 38 |
| 79241.0 | 37 |
| 79259.0 | 38 |
| 79273.0 | 37 |
| 79279.0 | 38 |
| 79283.0 | 39 |
| 79301.0 | 38 |
| 79309.0 | 37 |
| 79319.0 | 38 |
| 79333.0 | 37 |
| 79337.0 | 36 |
| 79349.0 | 35 |
| 79357.0 | 34 |
| 79367.0 | 35 |
| 79379.0 | 36 |
| 79393.0 | 35 |
| 79397.0 | 34 |
| 79399.0 | 35 |
| 79411.0 | 36 |
| 79423.0 | 37 |
| 79427.0 | 38 |
| 79433.0 | 37 |
| 79451.0 | 38 |
| 79481.0 | 37 |
| 79493.0 | 36 |
| 79531.0 | 37 |
| 79537.0 | 36 |
| 79549.0 | 35 |
| 79559.0 | 36 |
| 79561.0 | 35 |
| 79579.0 | 36 |
| 79589.0 | 35 |
| 79601.0 | 34 |
| 79609.0 | 33 |
| 79613.0 | 32 |
| 79621.0 | 31 |
| 79627.0 | 32 |
| 79631.0 | 33 |
| 79633.0 | 32 |
| 79657.0 | 31 |
| 79669.0 | 30 |
| 79687.0 | 31 |
| 79691.0 | 32 |
| 79693.0 | 31 |
| 79697.0 | 30 |
| 79699.0 | 31 |
| 79757.0 | 30 |
| 79769.0 | 29 |
| 79777.0 | 28 |
| 79801.0 | 27 |
| 79811.0 | 28 |
| 79813.0 | 27 |
| 79817.0 | 26 |
| 79823.0 | 27 |
| 79829.0 | 26 |
| 79841.0 | 25 |
| 79843.0 | 26 |
| 79847.0 | 27 |
| 79861.0 | 26 |
| 79867.0 | 27 |
| 79873.0 | 26 |
| 79889.0 | 25 |
| 79901.0 | 24 |
| 79903.0 | 25 |
| 79907.0 | 26 |
| 79939.0 | 27 |
| 79943.0 | 28 |
| 79967.0 | 29 |
| 79973.0 | 28 |
| 79979.0 | 29 |
| 79987.0 | 30 |
| 79997.0 | 29 |
| 79999.0 | 30 |
| 80021.0 | 29 |
| 80039.0 | 30 |
| 80051.0 | 31 |
| 80071.0 | 32 |
| 80077.0 | 31 |
| 80107.0 | 32 |
| 80111.0 | 33 |
| 80141.0 | 32 |
| 80147.0 | 33 |
| 80149.0 | 32 |
| 80153.0 | 31 |
| 80167.0 | 32 |
| 80173.0 | 31 |
| 80177.0 | 30 |
| 80191.0 | 31 |
| 80207.0 | 32 |
| 80209.0 | 31 |
| 80221.0 | 30 |
| 80231.0 | 31 |
| 80233.0 | 30 |
| 80239.0 | 31 |
| 80251.0 | 32 |
| 80263.0 | 33 |
| 80273.0 | 32 |
| 80279.0 | 33 |
| 80287.0 | 34 |
| 80309.0 | 33 |
| 80317.0 | 32 |
| 80329.0 | 31 |
| 80341.0 | 30 |
| 80347.0 | 31 |
| 80363.0 | 32 |
| 80369.0 | 31 |
| 80387.0 | 32 |
| 80407.0 | 33 |
| 80429.0 | 32 |
| 80447.0 | 33 |
| 80449.0 | 32 |
| 80471.0 | 33 |
| 80473.0 | 32 |
| 80489.0 | 31 |
| 80491.0 | 32 |
| 80513.0 | 31 |
| 80527.0 | 32 |
| 80537.0 | 31 |
| 80557.0 | 30 |
| 80567.0 | 31 |
| 80599.0 | 32 |
| 80603.0 | 33 |
| 80611.0 | 34 |
| 80621.0 | 33 |
| 80627.0 | 34 |
| 80629.0 | 33 |
| 80651.0 | 34 |
| 80657.0 | 33 |
| 80669.0 | 32 |
| 80671.0 | 33 |
| 80677.0 | 32 |
| 80681.0 | 31 |
| 80683.0 | 32 |
| 80687.0 | 33 |
| 80701.0 | 32 |
| 80713.0 | 31 |
| 80737.0 | 30 |
| 80747.0 | 31 |
| 80749.0 | 30 |
| 80761.0 | 29 |
| 80777.0 | 28 |
| 80779.0 | 29 |
| 80783.0 | 30 |
| 80789.0 | 29 |
| 80803.0 | 30 |
| 80809.0 | 29 |
| 80819.0 | 30 |
| 80831.0 | 31 |
| 80833.0 | 30 |
| 80849.0 | 29 |
| 80863.0 | 30 |
| 80897.0 | 29 |
| 80909.0 | 28 |
| 80911.0 | 29 |
| 80917.0 | 28 |
| 80923.0 | 29 |
| 80929.0 | 28 |
| 80933.0 | 27 |
| 80953.0 | 26 |
| 80963.0 | 27 |
| 80989.0 | 26 |
| 81001.0 | 25 |
| 81013.0 | 24 |
| 81017.0 | 23 |
| 81019.0 | 24 |
| 81023.0 | 25 |
| 81031.0 | 26 |
| 81041.0 | 25 |
| 81043.0 | 26 |
| 81047.0 | 27 |
| 81049.0 | 26 |
| 81071.0 | 27 |
| 81077.0 | 26 |
| 81083.0 | 27 |
| 81097.0 | 26 |
| 81101.0 | 25 |
| 81119.0 | 26 |
| 81131.0 | 27 |
| 81157.0 | 26 |
| 81163.0 | 27 |
| 81173.0 | 26 |
| 81181.0 | 25 |
| 81197.0 | 24 |
| 81199.0 | 25 |
| 81203.0 | 26 |
| 81223.0 | 27 |
| 81233.0 | 26 |
| 81239.0 | 27 |
| 81281.0 | 26 |
| 81283.0 | 27 |
| 81293.0 | 26 |
| 81299.0 | 27 |
| 81307.0 | 28 |
| 81331.0 | 29 |
| 81343.0 | 30 |
| 81349.0 | 29 |
| 81353.0 | 28 |
| 81359.0 | 29 |
| 81371.0 | 30 |
| 81373.0 | 29 |
| 81401.0 | 28 |
| 81409.0 | 27 |
| 81421.0 | 26 |
| 81439.0 | 27 |
| 81457.0 | 26 |
| 81463.0 | 27 |
| 81509.0 | 26 |
| 81517.0 | 25 |
| 81527.0 | 26 |
| 81533.0 | 25 |
| 81547.0 | 26 |
| 81551.0 | 27 |
| 81553.0 | 26 |
| 81559.0 | 27 |
| 81563.0 | 28 |
| 81569.0 | 27 |
| 81611.0 | 28 |
| 81619.0 | 29 |
| 81629.0 | 28 |
| 81637.0 | 27 |
| 81647.0 | 28 |
| 81649.0 | 27 |
| 81667.0 | 28 |
| 81671.0 | 29 |
| 81677.0 | 28 |
| 81689.0 | 27 |
| 81701.0 | 26 |
| 81703.0 | 27 |
| 81707.0 | 28 |
| 81727.0 | 29 |
| 81737.0 | 28 |
| 81749.0 | 27 |
| 81761.0 | 26 |
| 81769.0 | 25 |
| 81773.0 | 24 |
| 81799.0 | 25 |
| 81817.0 | 24 |
| 81839.0 | 25 |
| 81847.0 | 26 |
| 81853.0 | 25 |
| 81869.0 | 24 |
| 81883.0 | 25 |
| 81899.0 | 26 |
| 81901.0 | 25 |
| 81919.0 | 26 |
| 81929.0 | 25 |
| 81931.0 | 26 |
| 81937.0 | 25 |
| 81943.0 | 26 |
| 81953.0 | 25 |
| 81967.0 | 26 |
| 81971.0 | 27 |
| 81973.0 | 26 |
| 82003.0 | 27 |
| 82007.0 | 28 |
| 82009.0 | 27 |
| 82013.0 | 26 |
| 82021.0 | 25 |
| 82031.0 | 26 |
| 82037.0 | 25 |
| 82039.0 | 26 |
| 82051.0 | 27 |
| 82067.0 | 28 |
| 82073.0 | 27 |
| 82129.0 | 26 |
| 82139.0 | 27 |
| 82141.0 | 26 |
| 82153.0 | 25 |
| 82163.0 | 26 |
| 82171.0 | 27 |
| 82183.0 | 28 |
| 82189.0 | 27 |
| 82193.0 | 26 |
| 82207.0 | 27 |
| 82217.0 | 26 |
| 82219.0 | 27 |
| 82223.0 | 28 |
| 82231.0 | 29 |
| 82237.0 | 28 |
| 82241.0 | 27 |
| 82261.0 | 26 |
| 82267.0 | 27 |
| 82279.0 | 28 |
| 82301.0 | 27 |
| 82307.0 | 28 |
| 82339.0 | 29 |
| 82349.0 | 28 |
| 82351.0 | 29 |
| 82361.0 | 28 |
| 82373.0 | 27 |
| 82387.0 | 28 |
| 82393.0 | 27 |
| 82421.0 | 26 |
| 82457.0 | 25 |
| 82463.0 | 26 |
| 82469.0 | 25 |
| 82471.0 | 26 |
| 82483.0 | 27 |
| 82487.0 | 28 |
| 82493.0 | 27 |
| 82499.0 | 28 |
| 82507.0 | 29 |
| 82529.0 | 28 |
| 82531.0 | 29 |
| 82549.0 | 28 |
| 82559.0 | 29 |
| 82561.0 | 28 |
| 82567.0 | 29 |
| 82571.0 | 30 |
| 82591.0 | 31 |
| 82601.0 | 30 |
| 82609.0 | 29 |
| 82613.0 | 28 |
| 82619.0 | 29 |
| 82633.0 | 28 |
| 82651.0 | 29 |
| 82657.0 | 28 |
| 82699.0 | 29 |
| 82721.0 | 28 |
| 82723.0 | 29 |
| 82727.0 | 30 |
| 82729.0 | 29 |
| 82757.0 | 28 |
| 82759.0 | 29 |
| 82763.0 | 30 |
| 82781.0 | 29 |
| 82787.0 | 30 |
| 82793.0 | 29 |
| 82799.0 | 30 |
| 82811.0 | 31 |
| 82813.0 | 30 |
| 82837.0 | 29 |
| 82847.0 | 30 |
| 82883.0 | 31 |
| 82889.0 | 30 |
| 82891.0 | 31 |
| 82903.0 | 32 |
| 82913.0 | 31 |
| 82939.0 | 32 |
| 82963.0 | 33 |
| 82981.0 | 32 |
| 82997.0 | 31 |
| 83003.0 | 32 |
| 83009.0 | 31 |
| 83023.0 | 32 |
| 83047.0 | 33 |
| 83059.0 | 34 |
| 83063.0 | 35 |
| 83071.0 | 36 |
| 83077.0 | 35 |
| 83089.0 | 34 |
| 83093.0 | 33 |
| 83101.0 | 32 |
| 83117.0 | 31 |
| 83137.0 | 30 |
| 83177.0 | 29 |
| 83203.0 | 30 |
| 83207.0 | 31 |
| 83219.0 | 32 |
| 83221.0 | 31 |
| 83227.0 | 32 |
| 83231.0 | 33 |
| 83233.0 | 32 |
| 83243.0 | 33 |
| 83257.0 | 32 |
| 83267.0 | 33 |
| 83269.0 | 32 |
| 83273.0 | 31 |
| 83299.0 | 32 |
| 83311.0 | 33 |
| 83339.0 | 34 |
| 83341.0 | 33 |
| 83357.0 | 32 |
| 83383.0 | 33 |
| 83389.0 | 32 |
| 83399.0 | 33 |
| 83401.0 | 32 |
| 83407.0 | 33 |
| 83417.0 | 32 |
| 83423.0 | 33 |
| 83431.0 | 34 |
| 83437.0 | 33 |
| 83443.0 | 34 |
| 83449.0 | 33 |
| 83459.0 | 34 |
| 83471.0 | 35 |
| 83477.0 | 34 |
| 83497.0 | 33 |
| 83537.0 | 32 |
| 83557.0 | 31 |
| 83561.0 | 30 |
| 83563.0 | 31 |
| 83579.0 | 32 |
| 83591.0 | 33 |
| 83597.0 | 32 |
| 83609.0 | 31 |
| 83617.0 | 30 |
| 83621.0 | 29 |
| 83639.0 | 30 |
| 83641.0 | 29 |
| 83653.0 | 28 |
| 83663.0 | 29 |
| 83689.0 | 28 |
| 83701.0 | 27 |
| 83717.0 | 26 |
| 83719.0 | 27 |
| 83737.0 | 26 |
| 83761.0 | 25 |
| 83773.0 | 24 |
| 83777.0 | 23 |
| 83791.0 | 24 |
| 83813.0 | 23 |
| 83833.0 | 22 |
| 83843.0 | 23 |
| 83857.0 | 22 |
| 83869.0 | 21 |
| 83873.0 | 20 |
| 83891.0 | 21 |
| 83903.0 | 22 |
| 83911.0 | 23 |
| 83921.0 | 22 |
| 83933.0 | 21 |
| 83939.0 | 22 |
| 83969.0 | 21 |
| 83983.0 | 22 |
| 83987.0 | 23 |
| 84011.0 | 24 |
| 84017.0 | 23 |
| 84047.0 | 24 |
| 84053.0 | 23 |
| 84059.0 | 24 |
| 84061.0 | 23 |
| 84067.0 | 24 |
| 84089.0 | 23 |
| 84121.0 | 22 |
| 84127.0 | 23 |
| 84131.0 | 24 |
| 84137.0 | 23 |
| 84143.0 | 24 |
| 84163.0 | 25 |
| 84179.0 | 26 |
| 84181.0 | 25 |
| 84191.0 | 26 |
| 84199.0 | 27 |
| 84211.0 | 28 |
| 84221.0 | 27 |
| 84223.0 | 28 |
| 84229.0 | 27 |
| 84239.0 | 28 |
| 84247.0 | 29 |
| 84263.0 | 30 |
| 84299.0 | 31 |
| 84307.0 | 32 |
| 84313.0 | 31 |
| 84317.0 | 30 |
| 84319.0 | 31 |
| 84347.0 | 32 |
| 84349.0 | 31 |
| 84377.0 | 30 |
| 84389.0 | 29 |
| 84391.0 | 30 |
| 84401.0 | 29 |
| 84407.0 | 30 |
| 84421.0 | 29 |
| 84431.0 | 30 |
| 84437.0 | 29 |
| 84443.0 | 30 |
| 84449.0 | 29 |
| 84457.0 | 28 |
| 84463.0 | 29 |
| 84467.0 | 30 |
| 84481.0 | 29 |
| 84499.0 | 30 |
| 84503.0 | 31 |
| 84509.0 | 30 |
| 84521.0 | 29 |
| 84523.0 | 30 |
| 84533.0 | 29 |
| 84551.0 | 30 |
| 84559.0 | 31 |
| 84589.0 | 30 |
| 84629.0 | 29 |
| 84631.0 | 30 |
| 84649.0 | 29 |
| 84653.0 | 28 |
| 84659.0 | 29 |
| 84673.0 | 28 |
| 84691.0 | 29 |
| 84697.0 | 28 |
| 84701.0 | 27 |
| 84713.0 | 26 |
| 84719.0 | 27 |
| 84731.0 | 28 |
| 84737.0 | 27 |
| 84751.0 | 28 |
| 84761.0 | 27 |
| 84787.0 | 28 |
| 84793.0 | 27 |
| 84809.0 | 26 |
| 84811.0 | 27 |
| 84827.0 | 28 |
| 84857.0 | 27 |
| 84859.0 | 28 |
| 84869.0 | 27 |
| 84871.0 | 28 |
| 84913.0 | 27 |
| 84919.0 | 28 |
| 84947.0 | 29 |
| 84961.0 | 28 |
| 84967.0 | 29 |
| 84977.0 | 28 |
| 84979.0 | 29 |
| 84991.0 | 30 |
| 85009.0 | 29 |
| 85021.0 | 28 |
| 85027.0 | 29 |
| 85037.0 | 28 |
| 85049.0 | 27 |
| 85061.0 | 26 |
| 85081.0 | 25 |
| 85087.0 | 26 |
| 85091.0 | 27 |
| 85093.0 | 26 |
| 85103.0 | 27 |
| 85109.0 | 26 |
| 85121.0 | 25 |
| 85133.0 | 24 |
| 85147.0 | 25 |
| 85159.0 | 26 |
| 85193.0 | 25 |
| 85199.0 | 26 |
| 85201.0 | 25 |
| 85213.0 | 24 |
| 85223.0 | 25 |
| 85229.0 | 24 |
| 85237.0 | 23 |
| 85243.0 | 24 |
| 85247.0 | 25 |
| 85259.0 | 26 |
| 85297.0 | 25 |
| 85303.0 | 26 |
| 85313.0 | 25 |
| 85331.0 | 26 |
| 85333.0 | 25 |
| 85361.0 | 24 |
| 85363.0 | 25 |
| 85369.0 | 24 |
| 85381.0 | 23 |
| 85411.0 | 24 |
| 85427.0 | 25 |
| 85429.0 | 24 |
| 85439.0 | 25 |
| 85447.0 | 26 |
| 85451.0 | 27 |
| 85453.0 | 26 |
| 85469.0 | 25 |
| 85487.0 | 26 |
| 85513.0 | 25 |
| 85517.0 | 24 |
| 85523.0 | 25 |
| 85531.0 | 26 |
| 85549.0 | 25 |
| 85571.0 | 26 |
| 85577.0 | 25 |
| 85597.0 | 24 |
| 85601.0 | 23 |
| 85607.0 | 24 |
| 85619.0 | 25 |
| 85621.0 | 24 |
| 85627.0 | 25 |
| 85639.0 | 26 |
| 85643.0 | 27 |
| 85661.0 | 26 |
| 85667.0 | 27 |
| 85669.0 | 26 |
| 85691.0 | 27 |
| 85703.0 | 28 |
| 85711.0 | 29 |
| 85717.0 | 28 |
| 85733.0 | 27 |
| 85751.0 | 28 |
| 85781.0 | 27 |
| 85793.0 | 26 |
| 85817.0 | 25 |
| 85819.0 | 26 |
| 85829.0 | 25 |
| 85831.0 | 26 |
| 85837.0 | 25 |
| 85843.0 | 26 |
| 85847.0 | 27 |
| 85853.0 | 26 |
| 85889.0 | 25 |
| 85903.0 | 26 |
| 85909.0 | 25 |
| 85931.0 | 26 |
| 85933.0 | 25 |
| 85991.0 | 26 |
| 85999.0 | 27 |
| 86011.0 | 28 |
| 86017.0 | 27 |
| 86027.0 | 28 |
| 86029.0 | 27 |
| 86069.0 | 26 |
| 86077.0 | 25 |
| 86083.0 | 26 |
| 86111.0 | 27 |
| 86113.0 | 26 |
| 86117.0 | 25 |
| 86131.0 | 26 |
| 86137.0 | 25 |
| 86143.0 | 26 |
| 86161.0 | 25 |
| 86171.0 | 26 |
| 86179.0 | 27 |
| 86183.0 | 28 |
| 86197.0 | 27 |
| 86201.0 | 26 |
| 86209.0 | 25 |
| 86239.0 | 26 |
| 86243.0 | 27 |
| 86249.0 | 26 |
| 86257.0 | 25 |
| 86263.0 | 26 |
| 86269.0 | 25 |
| 86287.0 | 26 |
| 86291.0 | 27 |
| 86293.0 | 26 |
| 86297.0 | 25 |
| 86311.0 | 26 |
| 86323.0 | 27 |
| 86341.0 | 26 |
| 86351.0 | 27 |
| 86353.0 | 26 |
| 86357.0 | 25 |
| 86369.0 | 24 |
| 86371.0 | 25 |
| 86381.0 | 24 |
| 86389.0 | 23 |
| 86399.0 | 24 |
| 86413.0 | 23 |
| 86423.0 | 24 |
| 86441.0 | 23 |
| 86453.0 | 22 |
| 86461.0 | 21 |
| 86467.0 | 22 |
| 86477.0 | 21 |
| 86491.0 | 22 |
| 86501.0 | 21 |
| 86509.0 | 20 |
| 86531.0 | 21 |
| 86533.0 | 20 |
| 86539.0 | 21 |
| 86561.0 | 20 |
| 86573.0 | 19 |
| 86579.0 | 20 |
| 86587.0 | 21 |
| 86599.0 | 22 |
| 86627.0 | 23 |
| 86629.0 | 22 |
| 86677.0 | 21 |
| 86689.0 | 20 |
| 86693.0 | 19 |
| 86711.0 | 20 |
| 86719.0 | 21 |
| 86729.0 | 20 |
| 86743.0 | 21 |
| 86753.0 | 20 |
| 86767.0 | 21 |
| 86771.0 | 22 |
| 86783.0 | 23 |
| 86813.0 | 22 |
| 86837.0 | 21 |
| 86843.0 | 22 |
| 86851.0 | 23 |
| 86857.0 | 22 |
| 86861.0 | 21 |
| 86869.0 | 20 |
| 86923.0 | 21 |
| 86927.0 | 22 |
| 86929.0 | 21 |
| 86939.0 | 22 |
| 86951.0 | 23 |
| 86959.0 | 24 |
| 86969.0 | 23 |
| 86981.0 | 22 |
| 86993.0 | 21 |
| 87011.0 | 22 |
| 87013.0 | 21 |
| 87037.0 | 20 |
| 87041.0 | 19 |
| 87049.0 | 18 |
| 87071.0 | 19 |
| 87083.0 | 20 |
| 87103.0 | 21 |
| 87107.0 | 22 |
| 87119.0 | 23 |
| 87121.0 | 22 |
| 87133.0 | 21 |
| 87149.0 | 20 |
| 87151.0 | 21 |
| 87179.0 | 22 |
| 87181.0 | 21 |
| 87187.0 | 22 |
| 87211.0 | 23 |
| 87221.0 | 22 |
| 87223.0 | 23 |
| 87251.0 | 24 |
| 87253.0 | 23 |
| 87257.0 | 22 |
| 87277.0 | 21 |
| 87281.0 | 20 |
| 87293.0 | 19 |
| 87299.0 | 20 |
| 87313.0 | 19 |
| 87317.0 | 18 |
| 87323.0 | 19 |
| 87337.0 | 18 |
| 87359.0 | 19 |
| 87383.0 | 20 |
| 87403.0 | 21 |
| 87407.0 | 22 |
| 87421.0 | 21 |
| 87427.0 | 22 |
| 87433.0 | 21 |
| 87443.0 | 22 |
| 87473.0 | 21 |
| 87481.0 | 20 |
| 87491.0 | 21 |
| 87509.0 | 20 |
| 87511.0 | 21 |
| 87517.0 | 20 |
| 87523.0 | 21 |
| 87539.0 | 22 |
| 87541.0 | 21 |
| 87547.0 | 22 |
| 87553.0 | 21 |
| 87557.0 | 20 |
| 87559.0 | 21 |
| 87583.0 | 22 |
| 87587.0 | 23 |
| 87589.0 | 22 |
| 87613.0 | 21 |
| 87623.0 | 22 |
| 87629.0 | 21 |
| 87631.0 | 22 |
| 87641.0 | 21 |
| 87643.0 | 22 |
| 87649.0 | 21 |
| 87671.0 | 22 |
| 87679.0 | 23 |
| 87683.0 | 24 |
| 87691.0 | 25 |
| 87697.0 | 24 |
| 87701.0 | 23 |
| 87719.0 | 24 |
| 87721.0 | 23 |
| 87739.0 | 24 |
| 87743.0 | 25 |
| 87751.0 | 26 |
| 87767.0 | 27 |
| 87793.0 | 26 |
| 87797.0 | 25 |
| 87803.0 | 26 |
| 87811.0 | 27 |
| 87833.0 | 26 |
| 87853.0 | 25 |
| 87869.0 | 24 |
| 87877.0 | 23 |
| 87881.0 | 22 |
| 87887.0 | 23 |
| 87911.0 | 24 |
| 87917.0 | 23 |
| 87931.0 | 24 |
| 87943.0 | 25 |
| 87959.0 | 26 |
| 87961.0 | 25 |
| 87973.0 | 24 |
| 87977.0 | 23 |
| 87991.0 | 24 |
| 88001.0 | 23 |
| 88003.0 | 24 |
| 88007.0 | 25 |
| 88019.0 | 26 |
| 88037.0 | 25 |
| 88069.0 | 24 |
| 88079.0 | 25 |
| 88093.0 | 24 |
| 88117.0 | 23 |
| 88129.0 | 22 |
| 88169.0 | 21 |
| 88177.0 | 20 |
| 88211.0 | 21 |
| 88223.0 | 22 |
| 88237.0 | 21 |
| 88241.0 | 20 |
| 88259.0 | 21 |
| 88261.0 | 20 |
| 88289.0 | 19 |
| 88301.0 | 18 |
| 88321.0 | 17 |
| 88327.0 | 18 |
| 88337.0 | 17 |
| 88339.0 | 18 |
| 88379.0 | 19 |
| 88397.0 | 18 |
| 88411.0 | 19 |
| 88423.0 | 20 |
| 88427.0 | 21 |
| 88463.0 | 22 |
| 88469.0 | 21 |
| 88471.0 | 22 |
| 88493.0 | 21 |
| 88499.0 | 22 |
| 88513.0 | 21 |
| 88523.0 | 22 |
| 88547.0 | 23 |
| 88589.0 | 22 |
| 88591.0 | 23 |
| 88607.0 | 24 |
| 88609.0 | 23 |
| 88643.0 | 24 |
| 88651.0 | 25 |
| 88657.0 | 24 |
| 88661.0 | 23 |
| 88663.0 | 24 |
| 88667.0 | 25 |
| 88681.0 | 24 |
| 88721.0 | 23 |
| 88729.0 | 22 |
| 88741.0 | 21 |
| 88747.0 | 22 |
| 88771.0 | 23 |
| 88789.0 | 22 |
| 88793.0 | 21 |
| 88799.0 | 22 |
| 88801.0 | 21 |
| 88807.0 | 22 |
| 88811.0 | 23 |
| 88813.0 | 22 |
| 88817.0 | 21 |
| 88819.0 | 22 |
| 88843.0 | 23 |
| 88853.0 | 22 |
| 88861.0 | 21 |
| 88867.0 | 22 |
| 88873.0 | 21 |
| 88883.0 | 22 |
| 88897.0 | 21 |
| 88903.0 | 22 |
| 88919.0 | 23 |
| 88937.0 | 22 |
| 88951.0 | 23 |
| 88969.0 | 22 |
| 88993.0 | 21 |
| 88997.0 | 20 |
| 89003.0 | 21 |
| 89009.0 | 20 |
| 89017.0 | 19 |
| 89021.0 | 18 |
| 89041.0 | 17 |
| 89051.0 | 18 |
| 89057.0 | 17 |
| 89069.0 | 16 |
| 89071.0 | 17 |
| 89083.0 | 18 |
| 89087.0 | 19 |
| 89101.0 | 18 |
| 89107.0 | 19 |
| 89113.0 | 18 |
| 89119.0 | 19 |
| 89123.0 | 20 |
| 89137.0 | 19 |
| 89153.0 | 18 |
| 89189.0 | 17 |
| 89203.0 | 18 |
| 89209.0 | 17 |
| 89213.0 | 16 |
| 89227.0 | 17 |
| 89231.0 | 18 |
| 89237.0 | 17 |
| 89261.0 | 16 |
| 89269.0 | 15 |
| 89273.0 | 14 |
| 89293.0 | 13 |
| 89303.0 | 14 |
| 89317.0 | 13 |
| 89329.0 | 12 |
| 89363.0 | 13 |
| 89371.0 | 14 |
| 89381.0 | 13 |
| 89387.0 | 14 |
| 89393.0 | 13 |
| 89399.0 | 14 |
| 89413.0 | 13 |
| 89417.0 | 12 |
| 89431.0 | 13 |
| 89443.0 | 14 |
| 89449.0 | 13 |
| 89459.0 | 14 |
| 89477.0 | 13 |
| 89491.0 | 14 |
| 89501.0 | 13 |
| 89513.0 | 12 |
| 89519.0 | 13 |
| 89521.0 | 12 |
| 89527.0 | 13 |
| 89533.0 | 12 |
| 89561.0 | 11 |
| 89563.0 | 12 |
| 89567.0 | 13 |
| 89591.0 | 14 |
| 89597.0 | 13 |
| 89599.0 | 14 |
| 89603.0 | 15 |
| 89611.0 | 16 |
| 89627.0 | 17 |
| 89633.0 | 16 |
| 89653.0 | 15 |
| 89657.0 | 14 |
| 89659.0 | 15 |
| 89669.0 | 14 |
| 89671.0 | 15 |
| 89681.0 | 14 |
| 89689.0 | 13 |
| 89753.0 | 12 |
| 89759.0 | 13 |
| 89767.0 | 14 |
| 89779.0 | 15 |
| 89783.0 | 16 |
| 89797.0 | 15 |
| 89809.0 | 14 |
| 89819.0 | 15 |
| 89821.0 | 14 |
| 89833.0 | 13 |
| 89839.0 | 14 |
| 89849.0 | 13 |
| 89867.0 | 14 |
| 89891.0 | 15 |
| 89897.0 | 14 |
| 89899.0 | 15 |
| 89909.0 | 14 |
| 89917.0 | 13 |
| 89923.0 | 14 |
| 89939.0 | 15 |
| 89959.0 | 16 |
| 89963.0 | 17 |
| 89977.0 | 16 |
| 89983.0 | 17 |
| 89989.0 | 16 |
| 90001.0 | 15 |
| 90007.0 | 16 |
| 90011.0 | 17 |
| 90017.0 | 16 |
| 90019.0 | 17 |
| 90023.0 | 18 |
| 90031.0 | 19 |
| 90053.0 | 18 |
| 90059.0 | 19 |
| 90067.0 | 20 |
| 90071.0 | 21 |
| 90073.0 | 20 |
| 90089.0 | 19 |
| 90107.0 | 20 |
| 90121.0 | 19 |
| 90127.0 | 20 |
| 90149.0 | 19 |
| 90163.0 | 20 |
| 90173.0 | 19 |
| 90187.0 | 20 |
| 90191.0 | 21 |
| 90197.0 | 20 |
| 90199.0 | 21 |
| 90203.0 | 22 |
| 90217.0 | 21 |
| 90227.0 | 22 |
| 90239.0 | 23 |
| 90247.0 | 24 |
| 90263.0 | 25 |
| 90271.0 | 26 |
| 90281.0 | 25 |
| 90289.0 | 24 |
| 90313.0 | 23 |
| 90353.0 | 22 |
| 90359.0 | 23 |
| 90371.0 | 24 |
| 90373.0 | 23 |
| 90379.0 | 24 |
| 90397.0 | 23 |
| 90401.0 | 22 |
| 90403.0 | 23 |
| 90407.0 | 24 |
| 90437.0 | 23 |
| 90439.0 | 24 |
| 90469.0 | 23 |
| 90473.0 | 22 |
| 90481.0 | 21 |
| 90499.0 | 22 |
| 90511.0 | 23 |
| 90523.0 | 24 |
| 90527.0 | 25 |
| 90529.0 | 24 |
| 90533.0 | 23 |
| 90547.0 | 24 |
| 90583.0 | 25 |
| 90599.0 | 26 |
| 90617.0 | 25 |
| 90619.0 | 26 |
| 90631.0 | 27 |
| 90641.0 | 26 |
| 90647.0 | 27 |
| 90659.0 | 28 |
| 90677.0 | 27 |
| 90679.0 | 28 |
| 90697.0 | 27 |
| 90703.0 | 28 |
| 90709.0 | 27 |
| 90731.0 | 28 |
| 90749.0 | 27 |
| 90787.0 | 28 |
| 90793.0 | 27 |
| 90803.0 | 28 |
| 90821.0 | 27 |
| 90823.0 | 28 |
| 90833.0 | 27 |
| 90841.0 | 26 |
| 90847.0 | 27 |
| 90863.0 | 28 |
| 90887.0 | 29 |
| 90901.0 | 28 |
| 90907.0 | 29 |
| 90911.0 | 30 |
| 90917.0 | 29 |
| 90931.0 | 30 |
| 90947.0 | 31 |
| 90971.0 | 32 |
| 90977.0 | 31 |
| 90989.0 | 30 |
| 90997.0 | 29 |
| 91009.0 | 28 |
| 91019.0 | 29 |
| 91033.0 | 28 |
| 91079.0 | 29 |
| 91081.0 | 28 |
| 91097.0 | 27 |
| 91099.0 | 28 |
| 91121.0 | 27 |
| 91127.0 | 28 |
| 91129.0 | 27 |
| 91139.0 | 28 |
| 91141.0 | 27 |
| 91151.0 | 28 |
| 91153.0 | 27 |
| 91159.0 | 28 |
| 91163.0 | 29 |
| 91183.0 | 30 |
| 91193.0 | 29 |
| 91199.0 | 30 |
| 91229.0 | 29 |
| 91237.0 | 28 |
| 91243.0 | 29 |
| 91249.0 | 28 |
| 91253.0 | 27 |
| 91283.0 | 28 |
| 91291.0 | 29 |
| 91297.0 | 28 |
| 91303.0 | 29 |
| 91309.0 | 28 |
| 91331.0 | 29 |
| 91367.0 | 30 |
| 91369.0 | 29 |
| 91373.0 | 28 |
| 91381.0 | 27 |
| 91387.0 | 28 |
| 91393.0 | 27 |
| 91397.0 | 26 |
| 91411.0 | 27 |
| 91423.0 | 28 |
| 91433.0 | 27 |
| 91453.0 | 26 |
| 91457.0 | 25 |
| 91459.0 | 26 |
| 91463.0 | 27 |
| 91493.0 | 26 |
| 91499.0 | 27 |
| 91513.0 | 26 |
| 91529.0 | 25 |
| 91541.0 | 24 |
| 91571.0 | 25 |
| 91573.0 | 24 |
| 91577.0 | 23 |
| 91583.0 | 24 |
| 91591.0 | 25 |
| 91621.0 | 24 |
| 91631.0 | 25 |
| 91639.0 | 26 |
| 91673.0 | 25 |
| 91691.0 | 26 |
| 91703.0 | 27 |
| 91711.0 | 28 |
| 91733.0 | 27 |
| 91753.0 | 26 |
| 91757.0 | 25 |
| 91771.0 | 26 |
| 91781.0 | 25 |
| 91801.0 | 24 |
| 91807.0 | 25 |
| 91811.0 | 26 |
| 91813.0 | 25 |
| 91823.0 | 26 |
| 91837.0 | 25 |
| 91841.0 | 24 |
| 91867.0 | 25 |
| 91873.0 | 24 |
| 91909.0 | 23 |
| 91921.0 | 22 |
| 91939.0 | 23 |
| 91943.0 | 24 |
| 91951.0 | 25 |
| 91957.0 | 24 |
| 91961.0 | 23 |
| 91967.0 | 24 |
| 91969.0 | 23 |
| 91997.0 | 22 |
| 92003.0 | 23 |
| 92009.0 | 22 |
| 92033.0 | 21 |
| 92041.0 | 20 |
| 92051.0 | 21 |
| 92077.0 | 20 |
| 92083.0 | 21 |
| 92107.0 | 22 |
| 92111.0 | 23 |
| 92119.0 | 24 |
| 92143.0 | 25 |
| 92153.0 | 24 |
| 92173.0 | 23 |
| 92177.0 | 22 |
| 92179.0 | 23 |
| 92189.0 | 22 |
| 92203.0 | 23 |
| 92219.0 | 24 |
| 92221.0 | 23 |
| 92227.0 | 24 |
| 92233.0 | 23 |
| 92237.0 | 22 |
| 92243.0 | 23 |
| 92251.0 | 24 |
| 92269.0 | 23 |
| 92297.0 | 22 |
| 92311.0 | 23 |
| 92317.0 | 22 |
| 92333.0 | 21 |
| 92347.0 | 22 |
| 92353.0 | 21 |
| 92357.0 | 20 |
| 92363.0 | 21 |
| 92369.0 | 20 |
| 92377.0 | 19 |
| 92381.0 | 18 |
| 92383.0 | 19 |
| 92387.0 | 20 |
| 92399.0 | 21 |
| 92401.0 | 20 |
| 92413.0 | 19 |
| 92419.0 | 20 |
| 92431.0 | 21 |
| 92459.0 | 22 |
| 92461.0 | 21 |
| 92467.0 | 22 |
| 92479.0 | 23 |
| 92489.0 | 22 |
| 92503.0 | 23 |
| 92507.0 | 24 |
| 92551.0 | 25 |
| 92557.0 | 24 |
| 92567.0 | 25 |
| 92569.0 | 24 |
| 92581.0 | 23 |
| 92593.0 | 22 |
| 92623.0 | 23 |
| 92627.0 | 24 |
| 92639.0 | 25 |
| 92641.0 | 24 |
| 92647.0 | 25 |
| 92657.0 | 24 |
| 92669.0 | 23 |
| 92671.0 | 24 |
| 92681.0 | 23 |
| 92683.0 | 24 |
| 92693.0 | 23 |
| 92699.0 | 24 |
| 92707.0 | 25 |
| 92717.0 | 24 |
| 92723.0 | 25 |
| 92737.0 | 24 |
| 92753.0 | 23 |
| 92761.0 | 22 |
| 92767.0 | 23 |
| 92779.0 | 24 |
| 92789.0 | 23 |
| 92791.0 | 24 |
| 92801.0 | 23 |
| 92809.0 | 22 |
| 92821.0 | 21 |
| 92831.0 | 22 |
| 92849.0 | 21 |
| 92857.0 | 20 |
| 92861.0 | 19 |
| 92863.0 | 20 |
| 92867.0 | 21 |
| 92893.0 | 20 |
| 92899.0 | 21 |
| 92921.0 | 20 |
| 92927.0 | 21 |
| 92941.0 | 20 |
| 92951.0 | 21 |
| 92957.0 | 20 |
| 92959.0 | 21 |
| 92987.0 | 22 |
| 92993.0 | 21 |
| 93001.0 | 20 |
| 93047.0 | 21 |
| 93053.0 | 20 |
| 93059.0 | 21 |
| 93077.0 | 20 |
| 93083.0 | 21 |
| 93089.0 | 20 |
| 93097.0 | 19 |
| 93103.0 | 20 |
| 93113.0 | 19 |
| 93131.0 | 20 |
| 93133.0 | 19 |
| 93139.0 | 20 |
| 93151.0 | 21 |
| 93169.0 | 20 |
| 93179.0 | 21 |
| 93187.0 | 22 |
| 93199.0 | 23 |
| 93229.0 | 22 |
| 93239.0 | 23 |
| 93241.0 | 22 |
| 93251.0 | 23 |
| 93253.0 | 22 |
| 93257.0 | 21 |
| 93263.0 | 22 |
| 93281.0 | 21 |
| 93283.0 | 22 |
| 93287.0 | 23 |
| 93307.0 | 24 |
| 93319.0 | 25 |
| 93323.0 | 26 |
| 93329.0 | 25 |
| 93337.0 | 24 |
| 93371.0 | 25 |
| 93377.0 | 24 |
| 93383.0 | 25 |
| 93407.0 | 26 |
| 93419.0 | 27 |
| 93427.0 | 28 |
| 93463.0 | 29 |
| 93479.0 | 30 |
| 93481.0 | 29 |
| 93487.0 | 30 |
| 93491.0 | 31 |
| 93493.0 | 30 |
| 93497.0 | 29 |
| 93503.0 | 30 |
| 93523.0 | 31 |
| 93529.0 | 30 |
| 93553.0 | 29 |
| 93557.0 | 28 |
| 93559.0 | 29 |
| 93563.0 | 30 |
| 93581.0 | 29 |
| 93601.0 | 28 |
| 93607.0 | 29 |
| 93629.0 | 28 |
| 93637.0 | 27 |
| 93683.0 | 28 |
| 93701.0 | 27 |
| 93703.0 | 28 |
| 93719.0 | 29 |
| 93739.0 | 30 |
| 93761.0 | 29 |
| 93763.0 | 30 |
| 93787.0 | 31 |
| 93809.0 | 30 |
| 93811.0 | 31 |
| 93827.0 | 32 |
| 93851.0 | 33 |
| 93871.0 | 34 |
| 93887.0 | 35 |
| 93889.0 | 34 |
| 93893.0 | 33 |
| 93901.0 | 32 |
| 93911.0 | 33 |
| 93913.0 | 32 |
| 93923.0 | 33 |
| 93937.0 | 32 |
| 93941.0 | 31 |
| 93949.0 | 30 |
| 93967.0 | 31 |
| 93971.0 | 32 |
| 93979.0 | 33 |
| 93983.0 | 34 |
| 93997.0 | 33 |
| 94007.0 | 34 |
| 94009.0 | 33 |
| 94033.0 | 32 |
| 94049.0 | 31 |
| 94057.0 | 30 |
| 94063.0 | 31 |
| 94079.0 | 32 |
| 94099.0 | 33 |
| 94109.0 | 32 |
| 94111.0 | 33 |
| 94117.0 | 32 |
| 94121.0 | 31 |
| 94151.0 | 32 |
| 94153.0 | 31 |
| 94169.0 | 30 |
| 94201.0 | 29 |
| 94207.0 | 30 |
| 94219.0 | 31 |
| 94229.0 | 30 |
| 94253.0 | 29 |
| 94261.0 | 28 |
| 94273.0 | 27 |
| 94291.0 | 28 |
| 94307.0 | 29 |
| 94309.0 | 28 |
| 94321.0 | 27 |
| 94327.0 | 28 |
| 94331.0 | 29 |
| 94343.0 | 30 |
| 94349.0 | 29 |
| 94351.0 | 30 |
| 94379.0 | 31 |
| 94397.0 | 30 |
| 94399.0 | 31 |
| 94421.0 | 30 |
| 94427.0 | 31 |
| 94433.0 | 30 |
| 94439.0 | 31 |
| 94441.0 | 30 |
| 94447.0 | 31 |
| 94463.0 | 32 |
| 94477.0 | 31 |
| 94483.0 | 32 |
| 94513.0 | 31 |
| 94529.0 | 30 |
| 94531.0 | 31 |
| 94541.0 | 30 |
| 94543.0 | 31 |
| 94547.0 | 32 |
| 94559.0 | 33 |
| 94561.0 | 32 |
| 94573.0 | 31 |
| 94583.0 | 32 |
| 94597.0 | 31 |
| 94603.0 | 32 |
| 94613.0 | 31 |
| 94621.0 | 30 |
| 94649.0 | 29 |
| 94651.0 | 30 |
| 94687.0 | 31 |
| 94693.0 | 30 |
| 94709.0 | 29 |
| 94723.0 | 30 |
| 94727.0 | 31 |
| 94747.0 | 32 |
| 94771.0 | 33 |
| 94777.0 | 32 |
| 94781.0 | 31 |
| 94789.0 | 30 |
| 94793.0 | 29 |
| 94811.0 | 30 |
| 94819.0 | 31 |
| 94823.0 | 32 |
| 94837.0 | 31 |
| 94841.0 | 30 |
| 94847.0 | 31 |
| 94849.0 | 30 |
| 94873.0 | 29 |
| 94889.0 | 28 |
| 94903.0 | 29 |
| 94907.0 | 30 |
| 94933.0 | 29 |
| 94949.0 | 28 |
| 94951.0 | 29 |
| 94961.0 | 28 |
| 94993.0 | 27 |
| 94999.0 | 28 |
| 95003.0 | 29 |
| 95009.0 | 28 |
| 95021.0 | 27 |
| 95027.0 | 28 |
| 95063.0 | 29 |
| 95071.0 | 30 |
| 95083.0 | 31 |
| 95087.0 | 32 |
| 95089.0 | 31 |
| 95093.0 | 30 |
| 95101.0 | 29 |
| 95107.0 | 30 |
| 95111.0 | 31 |
| 95131.0 | 32 |
| 95143.0 | 33 |
| 95153.0 | 32 |
| 95177.0 | 31 |
| 95189.0 | 30 |
| 95191.0 | 31 |
| 95203.0 | 32 |
| 95213.0 | 31 |
| 95219.0 | 32 |
| 95231.0 | 33 |
| 95233.0 | 32 |
| 95239.0 | 33 |
| 95257.0 | 32 |
| 95261.0 | 31 |
| 95267.0 | 32 |
| 95273.0 | 31 |
| 95279.0 | 32 |
| 95287.0 | 33 |
| 95311.0 | 34 |
| 95317.0 | 33 |
| 95327.0 | 34 |
| 95339.0 | 35 |
| 95369.0 | 34 |
| 95383.0 | 35 |
| 95393.0 | 34 |
| 95401.0 | 33 |
| 95413.0 | 32 |
| 95419.0 | 33 |
| 95429.0 | 32 |
| 95441.0 | 31 |
| 95443.0 | 32 |
| 95461.0 | 31 |
| 95467.0 | 32 |
| 95471.0 | 33 |
| 95479.0 | 34 |
| 95483.0 | 35 |
| 95507.0 | 36 |
| 95527.0 | 37 |
| 95531.0 | 38 |
| 95539.0 | 39 |
| 95549.0 | 38 |
| 95561.0 | 37 |
| 95569.0 | 36 |
| 95581.0 | 35 |
| 95597.0 | 34 |
| 95603.0 | 35 |
| 95617.0 | 34 |
| 95621.0 | 33 |
| 95629.0 | 32 |
| 95633.0 | 31 |
| 95651.0 | 32 |
| 95701.0 | 31 |
| 95707.0 | 32 |
| 95713.0 | 31 |
| 95717.0 | 30 |
| 95723.0 | 31 |
| 95731.0 | 32 |
| 95737.0 | 31 |
| 95747.0 | 32 |
| 95773.0 | 31 |
| 95783.0 | 32 |
| 95789.0 | 31 |
| 95791.0 | 32 |
| 95801.0 | 31 |
| 95803.0 | 32 |
| 95813.0 | 31 |
| 95819.0 | 32 |
| 95857.0 | 31 |
| 95869.0 | 30 |
| 95873.0 | 29 |
| 95881.0 | 28 |
| 95891.0 | 29 |
| 95911.0 | 30 |
| 95917.0 | 29 |
| 95923.0 | 30 |
| 95929.0 | 29 |
| 95947.0 | 30 |
| 95957.0 | 29 |
| 95959.0 | 30 |
| 95971.0 | 31 |
| 95987.0 | 32 |
| 95989.0 | 31 |
| 96001.0 | 30 |
| 96013.0 | 29 |
| 96017.0 | 28 |
| 96043.0 | 29 |
| 96053.0 | 28 |
| 96059.0 | 29 |
| 96079.0 | 30 |
| 96097.0 | 29 |
| 96137.0 | 28 |
| 96149.0 | 27 |
| 96157.0 | 26 |
| 96167.0 | 27 |
| 96179.0 | 28 |
| 96181.0 | 27 |
| 96199.0 | 28 |
| 96211.0 | 29 |
| 96221.0 | 28 |
| 96223.0 | 29 |
| 96233.0 | 28 |
| 96259.0 | 29 |
| 96263.0 | 30 |
| 96269.0 | 29 |
| 96281.0 | 28 |
| 96289.0 | 27 |
| 96293.0 | 26 |
| 96323.0 | 27 |
| 96329.0 | 26 |
| 96331.0 | 27 |
| 96337.0 | 26 |
| 96353.0 | 25 |
| 96377.0 | 24 |
| 96401.0 | 23 |
| 96419.0 | 24 |
| 96431.0 | 25 |
| 96443.0 | 26 |
| 96451.0 | 27 |
| 96457.0 | 26 |
| 96461.0 | 25 |
| 96469.0 | 24 |
| 96479.0 | 25 |
| 96487.0 | 26 |
| 96493.0 | 25 |
| 96497.0 | 24 |
| 96517.0 | 23 |
| 96527.0 | 24 |
| 96553.0 | 23 |
| 96557.0 | 22 |
| 96581.0 | 21 |
| 96587.0 | 22 |
| 96589.0 | 21 |
| 96601.0 | 20 |
| 96643.0 | 21 |
| 96661.0 | 20 |
| 96667.0 | 21 |
| 96671.0 | 22 |
| 96697.0 | 21 |
| 96703.0 | 22 |
| 96731.0 | 23 |
| 96737.0 | 22 |
| 96739.0 | 23 |
| 96749.0 | 22 |
| 96757.0 | 21 |
| 96763.0 | 22 |
| 96769.0 | 21 |
| 96779.0 | 22 |
| 96787.0 | 23 |
| 96797.0 | 22 |
| 96799.0 | 23 |
| 96821.0 | 22 |
| 96823.0 | 23 |
| 96827.0 | 24 |
| 96847.0 | 25 |
| 96851.0 | 26 |
| 96857.0 | 25 |
| 96893.0 | 24 |
| 96907.0 | 25 |
| 96911.0 | 26 |
| 96931.0 | 27 |
| 96953.0 | 26 |
| 96959.0 | 27 |
| 96973.0 | 26 |
| 96979.0 | 27 |
| 96989.0 | 26 |
| 96997.0 | 25 |
| 97001.0 | 24 |
| 97003.0 | 25 |
| 97007.0 | 26 |
| 97021.0 | 25 |
| 97039.0 | 26 |
| 97073.0 | 25 |
| 97081.0 | 24 |
| 97103.0 | 25 |
| 97117.0 | 24 |
| 97127.0 | 25 |
| 97151.0 | 26 |
| 97157.0 | 25 |
| 97159.0 | 26 |
| 97169.0 | 25 |
| 97171.0 | 26 |
| 97177.0 | 25 |
| 97187.0 | 26 |
| 97213.0 | 25 |
| 97231.0 | 26 |
| 97241.0 | 25 |
| 97259.0 | 26 |
| 97283.0 | 27 |
| 97301.0 | 26 |
| 97303.0 | 27 |
| 97327.0 | 28 |
| 97367.0 | 29 |
| 97369.0 | 28 |
| 97373.0 | 27 |
| 97379.0 | 28 |
| 97381.0 | 27 |
| 97387.0 | 28 |
| 97397.0 | 27 |
| 97423.0 | 28 |
| 97429.0 | 27 |
| 97441.0 | 26 |
| 97453.0 | 25 |
| 97459.0 | 26 |
| 97463.0 | 27 |
| 97499.0 | 28 |
| 97501.0 | 27 |
| 97511.0 | 28 |
| 97523.0 | 29 |
| 97547.0 | 30 |
| 97549.0 | 29 |
| 97553.0 | 28 |
| 97561.0 | 27 |
| 97571.0 | 28 |
| 97577.0 | 27 |
| 97579.0 | 28 |
| 97583.0 | 29 |
| 97607.0 | 30 |
| 97609.0 | 29 |
| 97613.0 | 28 |
| 97649.0 | 27 |
| 97651.0 | 28 |
| 97673.0 | 27 |
| 97687.0 | 28 |
| 97711.0 | 29 |
| 97729.0 | 28 |
| 97771.0 | 29 |
| 97777.0 | 28 |
| 97787.0 | 29 |
| 97789.0 | 28 |
| 97813.0 | 27 |
| 97829.0 | 26 |
| 97841.0 | 25 |
| 97843.0 | 26 |
| 97847.0 | 27 |
| 97849.0 | 26 |
| 97859.0 | 27 |
| 97861.0 | 26 |
| 97871.0 | 27 |
| 97879.0 | 28 |
| 97883.0 | 29 |
| 97919.0 | 30 |
| 97927.0 | 31 |
| 97931.0 | 32 |
| 97943.0 | 33 |
| 97961.0 | 32 |
| 97967.0 | 33 |
| 97973.0 | 32 |
| 97987.0 | 33 |
| 98009.0 | 32 |
| 98011.0 | 33 |
| 98017.0 | 32 |
| 98041.0 | 31 |
| 98047.0 | 32 |
| 98057.0 | 31 |
| 98081.0 | 30 |
| 98101.0 | 29 |
| 98123.0 | 30 |
| 98129.0 | 29 |
| 98143.0 | 30 |
| 98179.0 | 31 |
| 98207.0 | 32 |
| 98213.0 | 31 |
| 98221.0 | 30 |
| 98227.0 | 31 |
| 98251.0 | 32 |
| 98257.0 | 31 |
| 98269.0 | 30 |
| 98297.0 | 29 |
| 98299.0 | 30 |
| 98317.0 | 29 |
| 98321.0 | 28 |
| 98323.0 | 29 |
| 98327.0 | 30 |
| 98347.0 | 31 |
| 98369.0 | 30 |
| 98377.0 | 29 |
| 98387.0 | 30 |
| 98389.0 | 29 |
| 98407.0 | 30 |
| 98411.0 | 31 |
| 98419.0 | 32 |
| 98429.0 | 31 |
| 98443.0 | 32 |
| 98453.0 | 31 |
| 98459.0 | 32 |
| 98467.0 | 33 |
| 98473.0 | 32 |
| 98479.0 | 33 |
| 98491.0 | 34 |
| 98507.0 | 35 |
| 98519.0 | 36 |
| 98533.0 | 35 |
| 98543.0 | 36 |
| 98561.0 | 35 |
| 98563.0 | 36 |
| 98573.0 | 35 |
| 98597.0 | 34 |
| 98621.0 | 33 |
| 98627.0 | 34 |
| 98639.0 | 35 |
| 98641.0 | 34 |
| 98663.0 | 35 |
| 98669.0 | 34 |
| 98689.0 | 33 |
| 98711.0 | 34 |
| 98713.0 | 33 |
| 98717.0 | 32 |
| 98729.0 | 31 |
| 98731.0 | 32 |
| 98737.0 | 31 |
| 98773.0 | 30 |
| 98779.0 | 31 |
| 98801.0 | 30 |
| 98807.0 | 31 |
| 98809.0 | 30 |
| 98837.0 | 29 |
| 98849.0 | 28 |
| 98867.0 | 29 |
| 98869.0 | 28 |
| 98873.0 | 27 |
| 98887.0 | 28 |
| 98893.0 | 27 |
| 98897.0 | 26 |
| 98899.0 | 27 |
| 98909.0 | 26 |
| 98911.0 | 27 |
| 98927.0 | 28 |
| 98929.0 | 27 |
| 98939.0 | 28 |
| 98947.0 | 29 |
| 98953.0 | 28 |
| 98963.0 | 29 |
| 98981.0 | 28 |
| 98993.0 | 27 |
| 98999.0 | 28 |
| 99013.0 | 27 |
| 99017.0 | 26 |
| 99023.0 | 27 |
| 99041.0 | 26 |
| 99053.0 | 25 |
| 99079.0 | 26 |
| 99083.0 | 27 |
| 99089.0 | 26 |
| 99103.0 | 27 |
| 99109.0 | 26 |
| 99119.0 | 27 |
| 99131.0 | 28 |
| 99133.0 | 27 |
| 99137.0 | 26 |
| 99139.0 | 27 |
| 99149.0 | 26 |
| 99173.0 | 25 |
| 99181.0 | 24 |
| 99191.0 | 25 |
| 99223.0 | 26 |
| 99233.0 | 25 |
| 99241.0 | 24 |
| 99251.0 | 25 |
| 99257.0 | 24 |
| 99259.0 | 25 |
| 99277.0 | 24 |
| 99289.0 | 23 |
| 99317.0 | 22 |
| 99347.0 | 23 |
| 99349.0 | 22 |
| 99367.0 | 23 |
| 99371.0 | 24 |
| 99377.0 | 23 |
| 99391.0 | 24 |
| 99397.0 | 23 |
| 99401.0 | 22 |
| 99409.0 | 21 |
| 99431.0 | 22 |
| 99439.0 | 23 |
| 99469.0 | 22 |
| 99487.0 | 23 |
| 99497.0 | 22 |
| 99523.0 | 23 |
| 99527.0 | 24 |
| 99529.0 | 23 |
| 99551.0 | 24 |
| 99559.0 | 25 |
| 99563.0 | 26 |
| 99571.0 | 27 |
| 99577.0 | 26 |
| 99581.0 | 25 |
| 99607.0 | 26 |
| 99611.0 | 27 |
| 99623.0 | 28 |
| 99643.0 | 29 |
| 99661.0 | 28 |
| 99667.0 | 29 |
| 99679.0 | 30 |
| 99689.0 | 29 |
| 99707.0 | 30 |
| 99709.0 | 29 |
| 99713.0 | 28 |
| 99719.0 | 29 |
| 99721.0 | 28 |
| 99733.0 | 27 |
| 99761.0 | 26 |
| 99767.0 | 27 |
| 99787.0 | 28 |
| 99793.0 | 27 |
| 99809.0 | 26 |
| 99817.0 | 25 |
| 99823.0 | 26 |
| 99829.0 | 25 |
| 99833.0 | 24 |
| 99839.0 | 25 |
| 99859.0 | 26 |
| 99871.0 | 27 |
| 99877.0 | 26 |
| 99881.0 | 25 |
| 99901.0 | 24 |
| 99907.0 | 25 |
| 99923.0 | 26 |
| 99929.0 | 25 |
| 99961.0 | 24 |
| 99971.0 | 25 |
| 99989.0 | 24 |
| 99991.0 | 25 |
| 100003.0 | 26 |